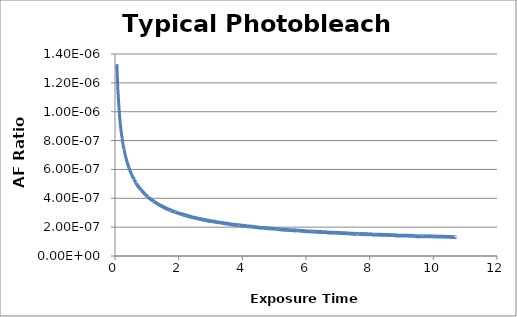
| Category | AF Ratio (a.u.) |
|---|---|
| 0.05972 | 0 |
| 0.06111 | 0 |
| 0.0625 | 0 |
| 0.06389 | 0 |
| 0.06528 | 0 |
| 0.06667 | 0 |
| 0.06806 | 0 |
| 0.06944 | 0 |
| 0.07083 | 0 |
| 0.07222 | 0 |
| 0.07361 | 0 |
| 0.075 | 0 |
| 0.07639 | 0 |
| 0.07778 | 0 |
| 0.07917 | 0 |
| 0.08056 | 0 |
| 0.08194 | 0 |
| 0.08333 | 0 |
| 0.08472 | 0 |
| 0.08611 | 0 |
| 0.0875 | 0 |
| 0.08889 | 0 |
| 0.09028 | 0 |
| 0.09167 | 0 |
| 0.09306 | 0 |
| 0.09444 | 0 |
| 0.09583 | 0 |
| 0.09722 | 0 |
| 0.09861 | 0 |
| 0.1 | 0 |
| 0.10139 | 0 |
| 0.10278 | 0 |
| 0.10417 | 0 |
| 0.10556 | 0 |
| 0.10694 | 0 |
| 0.10833 | 0 |
| 0.10972 | 0 |
| 0.11111 | 0 |
| 0.1125 | 0 |
| 0.11389 | 0 |
| 0.11528 | 0 |
| 0.11667 | 0 |
| 0.11806 | 0 |
| 0.11944 | 0 |
| 0.12083 | 0 |
| 0.12222 | 0 |
| 0.12361 | 0 |
| 0.125 | 0 |
| 0.12639 | 0 |
| 0.12778 | 0 |
| 0.12917 | 0 |
| 0.13056 | 0 |
| 0.13194 | 0 |
| 0.13333 | 0 |
| 0.13472 | 0 |
| 0.13611 | 0 |
| 0.1375 | 0 |
| 0.13889 | 0 |
| 0.14028 | 0 |
| 0.14167 | 0 |
| 0.14306 | 0 |
| 0.14444 | 0 |
| 0.14583 | 0 |
| 0.14722 | 0 |
| 0.14861 | 0 |
| 0.15 | 0 |
| 0.15139 | 0 |
| 0.15278 | 0 |
| 0.15417 | 0 |
| 0.15556 | 0 |
| 0.15694 | 0 |
| 0.15833 | 0 |
| 0.15972 | 0 |
| 0.16111 | 0 |
| 0.1625 | 0 |
| 0.16389 | 0 |
| 0.16528 | 0 |
| 0.16667 | 0 |
| 0.16806 | 0 |
| 0.16944 | 0 |
| 0.17083 | 0 |
| 0.17222 | 0 |
| 0.17361 | 0 |
| 0.175 | 0 |
| 0.17639 | 0 |
| 0.17778 | 0 |
| 0.17917 | 0 |
| 0.18056 | 0 |
| 0.18194 | 0 |
| 0.18333 | 0 |
| 0.18472 | 0 |
| 0.18611 | 0 |
| 0.1875 | 0 |
| 0.18889 | 0 |
| 0.19028 | 0 |
| 0.19167 | 0 |
| 0.19306 | 0 |
| 0.19444 | 0 |
| 0.19583 | 0 |
| 0.19722 | 0 |
| 0.19861 | 0 |
| 0.2 | 0 |
| 0.20139 | 0 |
| 0.20278 | 0 |
| 0.20417 | 0 |
| 0.20556 | 0 |
| 0.20694 | 0 |
| 0.20833 | 0 |
| 0.20972 | 0 |
| 0.21111 | 0 |
| 0.2125 | 0 |
| 0.21389 | 0 |
| 0.21528 | 0 |
| 0.21667 | 0 |
| 0.21806 | 0 |
| 0.21944 | 0 |
| 0.22083 | 0 |
| 0.22222 | 0 |
| 0.22361 | 0 |
| 0.225 | 0 |
| 0.22639 | 0 |
| 0.22778 | 0 |
| 0.22917 | 0 |
| 0.23056 | 0 |
| 0.23194 | 0 |
| 0.23333 | 0 |
| 0.23472 | 0 |
| 0.23611 | 0 |
| 0.2375 | 0 |
| 0.23889 | 0 |
| 0.24028 | 0 |
| 0.24167 | 0 |
| 0.24306 | 0 |
| 0.24444 | 0 |
| 0.24583 | 0 |
| 0.24722 | 0 |
| 0.24861 | 0 |
| 0.25 | 0 |
| 0.25139 | 0 |
| 0.25278 | 0 |
| 0.25417 | 0 |
| 0.25556 | 0 |
| 0.25694 | 0 |
| 0.25833 | 0 |
| 0.25972 | 0 |
| 0.26111 | 0 |
| 0.2625 | 0 |
| 0.26389 | 0 |
| 0.26528 | 0 |
| 0.26667 | 0 |
| 0.26806 | 0 |
| 0.26944 | 0 |
| 0.27083 | 0 |
| 0.27222 | 0 |
| 0.27361 | 0 |
| 0.275 | 0 |
| 0.27639 | 0 |
| 0.27778 | 0 |
| 0.27917 | 0 |
| 0.28056 | 0 |
| 0.28194 | 0 |
| 0.28333 | 0 |
| 0.28472 | 0 |
| 0.28611 | 0 |
| 0.2875 | 0 |
| 0.28889 | 0 |
| 0.29028 | 0 |
| 0.29167 | 0 |
| 0.29306 | 0 |
| 0.29444 | 0 |
| 0.29583 | 0 |
| 0.29722 | 0 |
| 0.29861 | 0 |
| 0.3 | 0 |
| 0.30139 | 0 |
| 0.30278 | 0 |
| 0.30417 | 0 |
| 0.30556 | 0 |
| 0.30694 | 0 |
| 0.30833 | 0 |
| 0.30972 | 0 |
| 0.31111 | 0 |
| 0.3125 | 0 |
| 0.31389 | 0 |
| 0.31528 | 0 |
| 0.31667 | 0 |
| 0.31806 | 0 |
| 0.31944 | 0 |
| 0.32083 | 0 |
| 0.32222 | 0 |
| 0.32361 | 0 |
| 0.325 | 0 |
| 0.32639 | 0 |
| 0.32778 | 0 |
| 0.32917 | 0 |
| 0.33056 | 0 |
| 0.33194 | 0 |
| 0.33333 | 0 |
| 0.33472 | 0 |
| 0.33611 | 0 |
| 0.3375 | 0 |
| 0.33889 | 0 |
| 0.34028 | 0 |
| 0.34167 | 0 |
| 0.34306 | 0 |
| 0.34444 | 0 |
| 0.34583 | 0 |
| 0.34722 | 0 |
| 0.34861 | 0 |
| 0.35 | 0 |
| 0.35139 | 0 |
| 0.35278 | 0 |
| 0.35417 | 0 |
| 0.35556 | 0 |
| 0.35694 | 0 |
| 0.35833 | 0 |
| 0.35972 | 0 |
| 0.36111 | 0 |
| 0.3625 | 0 |
| 0.36389 | 0 |
| 0.36528 | 0 |
| 0.36667 | 0 |
| 0.36806 | 0 |
| 0.36944 | 0 |
| 0.37083 | 0 |
| 0.37222 | 0 |
| 0.37361 | 0 |
| 0.375 | 0 |
| 0.37639 | 0 |
| 0.37778 | 0 |
| 0.37917 | 0 |
| 0.38056 | 0 |
| 0.38194 | 0 |
| 0.38333 | 0 |
| 0.38472 | 0 |
| 0.38611 | 0 |
| 0.3875 | 0 |
| 0.38889 | 0 |
| 0.39028 | 0 |
| 0.39167 | 0 |
| 0.39306 | 0 |
| 0.39444 | 0 |
| 0.39583 | 0 |
| 0.39722 | 0 |
| 0.39861 | 0 |
| 0.4 | 0 |
| 0.40139 | 0 |
| 0.40278 | 0 |
| 0.40417 | 0 |
| 0.40556 | 0 |
| 0.40694 | 0 |
| 0.40833 | 0 |
| 0.40972 | 0 |
| 0.41111 | 0 |
| 0.4125 | 0 |
| 0.41389 | 0 |
| 0.41528 | 0 |
| 0.41667 | 0 |
| 0.41806 | 0 |
| 0.41944 | 0 |
| 0.42083 | 0 |
| 0.42222 | 0 |
| 0.42361 | 0 |
| 0.425 | 0 |
| 0.42639 | 0 |
| 0.42778 | 0 |
| 0.42917 | 0 |
| 0.43056 | 0 |
| 0.43194 | 0 |
| 0.43333 | 0 |
| 0.43472 | 0 |
| 0.43611 | 0 |
| 0.4375 | 0 |
| 0.43889 | 0 |
| 0.44028 | 0 |
| 0.44167 | 0 |
| 0.44306 | 0 |
| 0.44444 | 0 |
| 0.44583 | 0 |
| 0.44722 | 0 |
| 0.44861 | 0 |
| 0.45 | 0 |
| 0.45139 | 0 |
| 0.45278 | 0 |
| 0.45417 | 0 |
| 0.45556 | 0 |
| 0.45694 | 0 |
| 0.45833 | 0 |
| 0.45972 | 0 |
| 0.46111 | 0 |
| 0.4625 | 0 |
| 0.46389 | 0 |
| 0.46528 | 0 |
| 0.46667 | 0 |
| 0.46806 | 0 |
| 0.46944 | 0 |
| 0.47083 | 0 |
| 0.47222 | 0 |
| 0.47361 | 0 |
| 0.475 | 0 |
| 0.47639 | 0 |
| 0.47778 | 0 |
| 0.47917 | 0 |
| 0.48056 | 0 |
| 0.48194 | 0 |
| 0.48333 | 0 |
| 0.48472 | 0 |
| 0.48611 | 0 |
| 0.4875 | 0 |
| 0.48889 | 0 |
| 0.49028 | 0 |
| 0.49167 | 0 |
| 0.49306 | 0 |
| 0.49444 | 0 |
| 0.49583 | 0 |
| 0.49722 | 0 |
| 0.49861 | 0 |
| 0.5 | 0 |
| 0.50139 | 0 |
| 0.50278 | 0 |
| 0.50417 | 0 |
| 0.50556 | 0 |
| 0.50694 | 0 |
| 0.50833 | 0 |
| 0.50972 | 0 |
| 0.51111 | 0 |
| 0.5125 | 0 |
| 0.51389 | 0 |
| 0.51528 | 0 |
| 0.51667 | 0 |
| 0.51806 | 0 |
| 0.51944 | 0 |
| 0.52083 | 0 |
| 0.52222 | 0 |
| 0.52361 | 0 |
| 0.525 | 0 |
| 0.52639 | 0 |
| 0.52778 | 0 |
| 0.52917 | 0 |
| 0.53056 | 0 |
| 0.53194 | 0 |
| 0.53333 | 0 |
| 0.53472 | 0 |
| 0.53611 | 0 |
| 0.5375 | 0 |
| 0.53889 | 0 |
| 0.54028 | 0 |
| 0.54167 | 0 |
| 0.54306 | 0 |
| 0.54444 | 0 |
| 0.54583 | 0 |
| 0.54722 | 0 |
| 0.54861 | 0 |
| 0.55 | 0 |
| 0.55139 | 0 |
| 0.55278 | 0 |
| 0.55417 | 0 |
| 0.55556 | 0 |
| 0.55694 | 0 |
| 0.55833 | 0 |
| 0.55972 | 0 |
| 0.56111 | 0 |
| 0.5625 | 0 |
| 0.56389 | 0 |
| 0.56528 | 0 |
| 0.56667 | 0 |
| 0.56806 | 0 |
| 0.56944 | 0 |
| 0.57083 | 0 |
| 0.57222 | 0 |
| 0.57361 | 0 |
| 0.575 | 0 |
| 0.57639 | 0 |
| 0.57778 | 0 |
| 0.57917 | 0 |
| 0.58056 | 0 |
| 0.58194 | 0 |
| 0.58333 | 0 |
| 0.58472 | 0 |
| 0.58611 | 0 |
| 0.5875 | 0 |
| 0.58889 | 0 |
| 0.59028 | 0 |
| 0.59167 | 0 |
| 0.59306 | 0 |
| 0.59444 | 0 |
| 0.59583 | 0 |
| 0.59722 | 0 |
| 0.59861 | 0 |
| 0.6 | 0 |
| 0.60139 | 0 |
| 0.60278 | 0 |
| 0.60417 | 0 |
| 0.60556 | 0 |
| 0.60694 | 0 |
| 0.60833 | 0 |
| 0.60972 | 0 |
| 0.61111 | 0 |
| 0.6125 | 0 |
| 0.61389 | 0 |
| 0.61528 | 0 |
| 0.61667 | 0 |
| 0.61806 | 0 |
| 0.61944 | 0 |
| 0.62083 | 0 |
| 0.62222 | 0 |
| 0.62361 | 0 |
| 0.625 | 0 |
| 0.62639 | 0 |
| 0.62778 | 0 |
| 0.62917 | 0 |
| 0.63056 | 0 |
| 0.63194 | 0 |
| 0.63333 | 0 |
| 0.63472 | 0 |
| 0.63611 | 0 |
| 0.6375 | 0 |
| 0.63889 | 0 |
| 0.64028 | 0 |
| 0.64167 | 0 |
| 0.64306 | 0 |
| 0.64444 | 0 |
| 0.64583 | 0 |
| 0.64722 | 0 |
| 0.64861 | 0 |
| 0.65 | 0 |
| 0.65139 | 0 |
| 0.65278 | 0 |
| 0.65417 | 0 |
| 0.65556 | 0 |
| 0.65694 | 0 |
| 0.65833 | 0 |
| 0.65972 | 0 |
| 0.66111 | 0 |
| 0.6625 | 0 |
| 0.66389 | 0 |
| 0.66528 | 0 |
| 0.66667 | 0 |
| 0.66806 | 0 |
| 0.66944 | 0 |
| 0.67083 | 0 |
| 0.67222 | 0 |
| 0.67361 | 0 |
| 0.675 | 0 |
| 0.67639 | 0 |
| 0.67778 | 0 |
| 0.67917 | 0 |
| 0.68056 | 0 |
| 0.68194 | 0 |
| 0.68333 | 0 |
| 0.68472 | 0 |
| 0.68611 | 0 |
| 0.6875 | 0 |
| 0.68889 | 0 |
| 0.69028 | 0 |
| 0.69167 | 0 |
| 0.69306 | 0 |
| 0.69444 | 0 |
| 0.69583 | 0 |
| 0.69722 | 0 |
| 0.69861 | 0 |
| 0.7 | 0 |
| 0.70139 | 0 |
| 0.70278 | 0 |
| 0.70417 | 0 |
| 0.70556 | 0 |
| 0.70694 | 0 |
| 0.70833 | 0 |
| 0.70972 | 0 |
| 0.71111 | 0 |
| 0.7125 | 0 |
| 0.71389 | 0 |
| 0.71528 | 0 |
| 0.71667 | 0 |
| 0.71806 | 0 |
| 0.71944 | 0 |
| 0.72083 | 0 |
| 0.72222 | 0 |
| 0.72361 | 0 |
| 0.725 | 0 |
| 0.72639 | 0 |
| 0.72778 | 0 |
| 0.72917 | 0 |
| 0.73056 | 0 |
| 0.73194 | 0 |
| 0.73333 | 0 |
| 0.73472 | 0 |
| 0.73611 | 0 |
| 0.7375 | 0 |
| 0.73889 | 0 |
| 0.74028 | 0 |
| 0.74167 | 0 |
| 0.74306 | 0 |
| 0.74444 | 0 |
| 0.74583 | 0 |
| 0.74722 | 0 |
| 0.74861 | 0 |
| 0.75 | 0 |
| 0.75139 | 0 |
| 0.75278 | 0 |
| 0.75417 | 0 |
| 0.75556 | 0 |
| 0.75694 | 0 |
| 0.75833 | 0 |
| 0.75972 | 0 |
| 0.76111 | 0 |
| 0.7625 | 0 |
| 0.76389 | 0 |
| 0.76528 | 0 |
| 0.76667 | 0 |
| 0.76806 | 0 |
| 0.76944 | 0 |
| 0.77083 | 0 |
| 0.77222 | 0 |
| 0.77361 | 0 |
| 0.775 | 0 |
| 0.77639 | 0 |
| 0.77778 | 0 |
| 0.77917 | 0 |
| 0.78056 | 0 |
| 0.78194 | 0 |
| 0.78333 | 0 |
| 0.78472 | 0 |
| 0.78611 | 0 |
| 0.7875 | 0 |
| 0.78889 | 0 |
| 0.79028 | 0 |
| 0.79167 | 0 |
| 0.79306 | 0 |
| 0.79444 | 0 |
| 0.79583 | 0 |
| 0.79722 | 0 |
| 0.79861 | 0 |
| 0.8 | 0 |
| 0.80139 | 0 |
| 0.80278 | 0 |
| 0.80417 | 0 |
| 0.80556 | 0 |
| 0.80694 | 0 |
| 0.80833 | 0 |
| 0.80972 | 0 |
| 0.81111 | 0 |
| 0.8125 | 0 |
| 0.81389 | 0 |
| 0.81528 | 0 |
| 0.81667 | 0 |
| 0.81806 | 0 |
| 0.81944 | 0 |
| 0.82083 | 0 |
| 0.82222 | 0 |
| 0.82361 | 0 |
| 0.825 | 0 |
| 0.82639 | 0 |
| 0.82778 | 0 |
| 0.82917 | 0 |
| 0.83056 | 0 |
| 0.83194 | 0 |
| 0.83333 | 0 |
| 0.83472 | 0 |
| 0.83611 | 0 |
| 0.8375 | 0 |
| 0.83889 | 0 |
| 0.84028 | 0 |
| 0.84167 | 0 |
| 0.84306 | 0 |
| 0.84444 | 0 |
| 0.84583 | 0 |
| 0.84722 | 0 |
| 0.84861 | 0 |
| 0.85 | 0 |
| 0.85139 | 0 |
| 0.85278 | 0 |
| 0.85417 | 0 |
| 0.85556 | 0 |
| 0.85694 | 0 |
| 0.85833 | 0 |
| 0.85972 | 0 |
| 0.86111 | 0 |
| 0.8625 | 0 |
| 0.86389 | 0 |
| 0.86528 | 0 |
| 0.86667 | 0 |
| 0.86806 | 0 |
| 0.86944 | 0 |
| 0.87083 | 0 |
| 0.87222 | 0 |
| 0.87361 | 0 |
| 0.875 | 0 |
| 0.87639 | 0 |
| 0.87778 | 0 |
| 0.87917 | 0 |
| 0.88056 | 0 |
| 0.88194 | 0 |
| 0.88333 | 0 |
| 0.88472 | 0 |
| 0.88611 | 0 |
| 0.8875 | 0 |
| 0.88889 | 0 |
| 0.89028 | 0 |
| 0.89167 | 0 |
| 0.89306 | 0 |
| 0.89444 | 0 |
| 0.89583 | 0 |
| 0.89722 | 0 |
| 0.89861 | 0 |
| 0.9 | 0 |
| 0.90139 | 0 |
| 0.90278 | 0 |
| 0.90417 | 0 |
| 0.90556 | 0 |
| 0.90694 | 0 |
| 0.90833 | 0 |
| 0.90972 | 0 |
| 0.91111 | 0 |
| 0.9125 | 0 |
| 0.91389 | 0 |
| 0.91528 | 0 |
| 0.91667 | 0 |
| 0.91806 | 0 |
| 0.91944 | 0 |
| 0.92083 | 0 |
| 0.92222 | 0 |
| 0.92361 | 0 |
| 0.925 | 0 |
| 0.92639 | 0 |
| 0.92778 | 0 |
| 0.92917 | 0 |
| 0.93056 | 0 |
| 0.93194 | 0 |
| 0.93333 | 0 |
| 0.93472 | 0 |
| 0.93611 | 0 |
| 0.9375 | 0 |
| 0.93889 | 0 |
| 0.94028 | 0 |
| 0.94167 | 0 |
| 0.94306 | 0 |
| 0.94444 | 0 |
| 0.94583 | 0 |
| 0.94722 | 0 |
| 0.94861 | 0 |
| 0.95 | 0 |
| 0.95139 | 0 |
| 0.95278 | 0 |
| 0.95417 | 0 |
| 0.95556 | 0 |
| 0.95694 | 0 |
| 0.95833 | 0 |
| 0.95972 | 0 |
| 0.96111 | 0 |
| 0.9625 | 0 |
| 0.96389 | 0 |
| 0.96528 | 0 |
| 0.96667 | 0 |
| 0.96806 | 0 |
| 0.96944 | 0 |
| 0.97083 | 0 |
| 0.97222 | 0 |
| 0.97361 | 0 |
| 0.975 | 0 |
| 0.97639 | 0 |
| 0.97778 | 0 |
| 0.97917 | 0 |
| 0.98056 | 0 |
| 0.98194 | 0 |
| 0.98333 | 0 |
| 0.98472 | 0 |
| 0.98611 | 0 |
| 0.9875 | 0 |
| 0.98889 | 0 |
| 0.99028 | 0 |
| 0.99167 | 0 |
| 0.99306 | 0 |
| 0.99444 | 0 |
| 0.99583 | 0 |
| 0.99722 | 0 |
| 0.99861 | 0 |
| 1.0 | 0 |
| 1.00139 | 0 |
| 1.00278 | 0 |
| 1.00417 | 0 |
| 1.00556 | 0 |
| 1.00694 | 0 |
| 1.00833 | 0 |
| 1.00972 | 0 |
| 1.01111 | 0 |
| 1.0125 | 0 |
| 1.01389 | 0 |
| 1.01528 | 0 |
| 1.01667 | 0 |
| 1.01806 | 0 |
| 1.01944 | 0 |
| 1.02083 | 0 |
| 1.02222 | 0 |
| 1.02361 | 0 |
| 1.025 | 0 |
| 1.02639 | 0 |
| 1.02778 | 0 |
| 1.02917 | 0 |
| 1.03056 | 0 |
| 1.03194 | 0 |
| 1.03333 | 0 |
| 1.03472 | 0 |
| 1.03611 | 0 |
| 1.0375 | 0 |
| 1.03889 | 0 |
| 1.04028 | 0 |
| 1.04167 | 0 |
| 1.04306 | 0 |
| 1.04444 | 0 |
| 1.04583 | 0 |
| 1.04722 | 0 |
| 1.04861 | 0 |
| 1.05 | 0 |
| 1.05139 | 0 |
| 1.05278 | 0 |
| 1.05417 | 0 |
| 1.05556 | 0 |
| 1.05694 | 0 |
| 1.05833 | 0 |
| 1.05972 | 0 |
| 1.06111 | 0 |
| 1.0625 | 0 |
| 1.06389 | 0 |
| 1.06528 | 0 |
| 1.06667 | 0 |
| 1.06806 | 0 |
| 1.06944 | 0 |
| 1.07083 | 0 |
| 1.07222 | 0 |
| 1.07361 | 0 |
| 1.075 | 0 |
| 1.07639 | 0 |
| 1.07778 | 0 |
| 1.07917 | 0 |
| 1.08056 | 0 |
| 1.08194 | 0 |
| 1.08333 | 0 |
| 1.08472 | 0 |
| 1.08611 | 0 |
| 1.0875 | 0 |
| 1.08889 | 0 |
| 1.09028 | 0 |
| 1.09167 | 0 |
| 1.09306 | 0 |
| 1.09444 | 0 |
| 1.09583 | 0 |
| 1.09722 | 0 |
| 1.09861 | 0 |
| 1.1 | 0 |
| 1.10139 | 0 |
| 1.10278 | 0 |
| 1.10417 | 0 |
| 1.10556 | 0 |
| 1.10694 | 0 |
| 1.10833 | 0 |
| 1.10972 | 0 |
| 1.11111 | 0 |
| 1.1125 | 0 |
| 1.11389 | 0 |
| 1.11528 | 0 |
| 1.11667 | 0 |
| 1.11806 | 0 |
| 1.11944 | 0 |
| 1.12083 | 0 |
| 1.12222 | 0 |
| 1.12361 | 0 |
| 1.125 | 0 |
| 1.12639 | 0 |
| 1.12778 | 0 |
| 1.12917 | 0 |
| 1.13056 | 0 |
| 1.13194 | 0 |
| 1.13333 | 0 |
| 1.13472 | 0 |
| 1.13611 | 0 |
| 1.1375 | 0 |
| 1.13889 | 0 |
| 1.14028 | 0 |
| 1.14167 | 0 |
| 1.14306 | 0 |
| 1.14444 | 0 |
| 1.14583 | 0 |
| 1.14722 | 0 |
| 1.14861 | 0 |
| 1.15 | 0 |
| 1.15139 | 0 |
| 1.15278 | 0 |
| 1.15417 | 0 |
| 1.15556 | 0 |
| 1.15694 | 0 |
| 1.15833 | 0 |
| 1.15972 | 0 |
| 1.16111 | 0 |
| 1.1625 | 0 |
| 1.16389 | 0 |
| 1.16528 | 0 |
| 1.16667 | 0 |
| 1.16806 | 0 |
| 1.16944 | 0 |
| 1.17083 | 0 |
| 1.17222 | 0 |
| 1.17361 | 0 |
| 1.175 | 0 |
| 1.17639 | 0 |
| 1.17778 | 0 |
| 1.17917 | 0 |
| 1.18056 | 0 |
| 1.18194 | 0 |
| 1.18333 | 0 |
| 1.18472 | 0 |
| 1.18611 | 0 |
| 1.1875 | 0 |
| 1.18889 | 0 |
| 1.19028 | 0 |
| 1.19167 | 0 |
| 1.19306 | 0 |
| 1.19444 | 0 |
| 1.19583 | 0 |
| 1.19722 | 0 |
| 1.19861 | 0 |
| 1.2 | 0 |
| 1.20139 | 0 |
| 1.20278 | 0 |
| 1.20417 | 0 |
| 1.20556 | 0 |
| 1.20694 | 0 |
| 1.20833 | 0 |
| 1.20972 | 0 |
| 1.21111 | 0 |
| 1.2125 | 0 |
| 1.21389 | 0 |
| 1.21528 | 0 |
| 1.21667 | 0 |
| 1.21806 | 0 |
| 1.21944 | 0 |
| 1.22083 | 0 |
| 1.22222 | 0 |
| 1.22361 | 0 |
| 1.225 | 0 |
| 1.22639 | 0 |
| 1.22778 | 0 |
| 1.22917 | 0 |
| 1.23056 | 0 |
| 1.23194 | 0 |
| 1.23333 | 0 |
| 1.23472 | 0 |
| 1.23611 | 0 |
| 1.2375 | 0 |
| 1.23889 | 0 |
| 1.24028 | 0 |
| 1.24167 | 0 |
| 1.24306 | 0 |
| 1.24444 | 0 |
| 1.24583 | 0 |
| 1.24722 | 0 |
| 1.24861 | 0 |
| 1.25 | 0 |
| 1.25139 | 0 |
| 1.25278 | 0 |
| 1.25417 | 0 |
| 1.25556 | 0 |
| 1.25694 | 0 |
| 1.25833 | 0 |
| 1.25972 | 0 |
| 1.26111 | 0 |
| 1.2625 | 0 |
| 1.26389 | 0 |
| 1.26528 | 0 |
| 1.26667 | 0 |
| 1.26806 | 0 |
| 1.26944 | 0 |
| 1.27083 | 0 |
| 1.27222 | 0 |
| 1.27361 | 0 |
| 1.275 | 0 |
| 1.27639 | 0 |
| 1.27778 | 0 |
| 1.27917 | 0 |
| 1.28056 | 0 |
| 1.28194 | 0 |
| 1.28333 | 0 |
| 1.28472 | 0 |
| 1.28611 | 0 |
| 1.2875 | 0 |
| 1.28889 | 0 |
| 1.29028 | 0 |
| 1.29167 | 0 |
| 1.29306 | 0 |
| 1.29444 | 0 |
| 1.29583 | 0 |
| 1.29722 | 0 |
| 1.29861 | 0 |
| 1.3 | 0 |
| 1.30139 | 0 |
| 1.30278 | 0 |
| 1.30417 | 0 |
| 1.30556 | 0 |
| 1.30694 | 0 |
| 1.30833 | 0 |
| 1.30972 | 0 |
| 1.31111 | 0 |
| 1.3125 | 0 |
| 1.31389 | 0 |
| 1.31528 | 0 |
| 1.31667 | 0 |
| 1.31806 | 0 |
| 1.31944 | 0 |
| 1.32083 | 0 |
| 1.32222 | 0 |
| 1.32361 | 0 |
| 1.325 | 0 |
| 1.32639 | 0 |
| 1.32778 | 0 |
| 1.32917 | 0 |
| 1.33056 | 0 |
| 1.33194 | 0 |
| 1.33333 | 0 |
| 1.33472 | 0 |
| 1.33611 | 0 |
| 1.3375 | 0 |
| 1.33889 | 0 |
| 1.34028 | 0 |
| 1.34167 | 0 |
| 1.34306 | 0 |
| 1.34444 | 0 |
| 1.34583 | 0 |
| 1.34722 | 0 |
| 1.34861 | 0 |
| 1.35 | 0 |
| 1.35139 | 0 |
| 1.35278 | 0 |
| 1.35417 | 0 |
| 1.35556 | 0 |
| 1.35694 | 0 |
| 1.35833 | 0 |
| 1.35972 | 0 |
| 1.36111 | 0 |
| 1.3625 | 0 |
| 1.36389 | 0 |
| 1.36528 | 0 |
| 1.36667 | 0 |
| 1.36806 | 0 |
| 1.36944 | 0 |
| 1.37083 | 0 |
| 1.37222 | 0 |
| 1.37361 | 0 |
| 1.375 | 0 |
| 1.37639 | 0 |
| 1.37778 | 0 |
| 1.37917 | 0 |
| 1.38056 | 0 |
| 1.38194 | 0 |
| 1.38333 | 0 |
| 1.38472 | 0 |
| 1.38611 | 0 |
| 1.3875 | 0 |
| 1.38889 | 0 |
| 1.39028 | 0 |
| 1.39167 | 0 |
| 1.39306 | 0 |
| 1.39444 | 0 |
| 1.39583 | 0 |
| 1.39722 | 0 |
| 1.39861 | 0 |
| 1.4 | 0 |
| 1.40139 | 0 |
| 1.40278 | 0 |
| 1.40417 | 0 |
| 1.40556 | 0 |
| 1.40694 | 0 |
| 1.40833 | 0 |
| 1.40972 | 0 |
| 1.41111 | 0 |
| 1.4125 | 0 |
| 1.41389 | 0 |
| 1.41528 | 0 |
| 1.41667 | 0 |
| 1.41806 | 0 |
| 1.41944 | 0 |
| 1.42083 | 0 |
| 1.42222 | 0 |
| 1.42361 | 0 |
| 1.425 | 0 |
| 1.42639 | 0 |
| 1.42778 | 0 |
| 1.42917 | 0 |
| 1.43056 | 0 |
| 1.43194 | 0 |
| 1.43333 | 0 |
| 1.43472 | 0 |
| 1.43611 | 0 |
| 1.4375 | 0 |
| 1.43889 | 0 |
| 1.44028 | 0 |
| 1.44167 | 0 |
| 1.44306 | 0 |
| 1.44444 | 0 |
| 1.44583 | 0 |
| 1.44722 | 0 |
| 1.44861 | 0 |
| 1.45 | 0 |
| 1.45139 | 0 |
| 1.45278 | 0 |
| 1.45417 | 0 |
| 1.45556 | 0 |
| 1.45694 | 0 |
| 1.45833 | 0 |
| 1.45972 | 0 |
| 1.46111 | 0 |
| 1.4625 | 0 |
| 1.46389 | 0 |
| 1.46528 | 0 |
| 1.46667 | 0 |
| 1.46806 | 0 |
| 1.46944 | 0 |
| 1.47083 | 0 |
| 1.47222 | 0 |
| 1.47361 | 0 |
| 1.475 | 0 |
| 1.47639 | 0 |
| 1.47778 | 0 |
| 1.47917 | 0 |
| 1.48056 | 0 |
| 1.48194 | 0 |
| 1.48333 | 0 |
| 1.48472 | 0 |
| 1.48611 | 0 |
| 1.4875 | 0 |
| 1.48889 | 0 |
| 1.49028 | 0 |
| 1.49167 | 0 |
| 1.49306 | 0 |
| 1.49444 | 0 |
| 1.49583 | 0 |
| 1.49722 | 0 |
| 1.49861 | 0 |
| 1.5 | 0 |
| 1.50139 | 0 |
| 1.50278 | 0 |
| 1.50417 | 0 |
| 1.50556 | 0 |
| 1.50694 | 0 |
| 1.50833 | 0 |
| 1.50972 | 0 |
| 1.51111 | 0 |
| 1.5125 | 0 |
| 1.51389 | 0 |
| 1.51528 | 0 |
| 1.51667 | 0 |
| 1.51806 | 0 |
| 1.51944 | 0 |
| 1.52083 | 0 |
| 1.52222 | 0 |
| 1.52361 | 0 |
| 1.525 | 0 |
| 1.52639 | 0 |
| 1.52778 | 0 |
| 1.52917 | 0 |
| 1.53056 | 0 |
| 1.53194 | 0 |
| 1.53333 | 0 |
| 1.53472 | 0 |
| 1.53611 | 0 |
| 1.5375 | 0 |
| 1.53889 | 0 |
| 1.54028 | 0 |
| 1.54167 | 0 |
| 1.54306 | 0 |
| 1.54444 | 0 |
| 1.54583 | 0 |
| 1.54722 | 0 |
| 1.54861 | 0 |
| 1.55 | 0 |
| 1.55139 | 0 |
| 1.55278 | 0 |
| 1.55417 | 0 |
| 1.55556 | 0 |
| 1.55694 | 0 |
| 1.55833 | 0 |
| 1.55972 | 0 |
| 1.56111 | 0 |
| 1.5625 | 0 |
| 1.56389 | 0 |
| 1.56528 | 0 |
| 1.56667 | 0 |
| 1.56806 | 0 |
| 1.56944 | 0 |
| 1.57083 | 0 |
| 1.57222 | 0 |
| 1.57361 | 0 |
| 1.575 | 0 |
| 1.57639 | 0 |
| 1.57778 | 0 |
| 1.57917 | 0 |
| 1.58056 | 0 |
| 1.58194 | 0 |
| 1.58333 | 0 |
| 1.58472 | 0 |
| 1.58611 | 0 |
| 1.5875 | 0 |
| 1.58889 | 0 |
| 1.59028 | 0 |
| 1.59167 | 0 |
| 1.59306 | 0 |
| 1.59444 | 0 |
| 1.59583 | 0 |
| 1.59722 | 0 |
| 1.59861 | 0 |
| 1.6 | 0 |
| 1.60139 | 0 |
| 1.60278 | 0 |
| 1.60417 | 0 |
| 1.60556 | 0 |
| 1.60694 | 0 |
| 1.60833 | 0 |
| 1.60972 | 0 |
| 1.61111 | 0 |
| 1.6125 | 0 |
| 1.61389 | 0 |
| 1.61528 | 0 |
| 1.61667 | 0 |
| 1.61806 | 0 |
| 1.61944 | 0 |
| 1.62083 | 0 |
| 1.62222 | 0 |
| 1.62361 | 0 |
| 1.625 | 0 |
| 1.62639 | 0 |
| 1.62778 | 0 |
| 1.62917 | 0 |
| 1.63056 | 0 |
| 1.63194 | 0 |
| 1.63333 | 0 |
| 1.63472 | 0 |
| 1.63611 | 0 |
| 1.6375 | 0 |
| 1.63889 | 0 |
| 1.64028 | 0 |
| 1.64167 | 0 |
| 1.64306 | 0 |
| 1.64444 | 0 |
| 1.64583 | 0 |
| 1.64722 | 0 |
| 1.64861 | 0 |
| 1.65 | 0 |
| 1.65139 | 0 |
| 1.65278 | 0 |
| 1.65417 | 0 |
| 1.65556 | 0 |
| 1.65694 | 0 |
| 1.65833 | 0 |
| 1.65972 | 0 |
| 1.66111 | 0 |
| 1.6625 | 0 |
| 1.66389 | 0 |
| 1.66528 | 0 |
| 1.66667 | 0 |
| 1.66806 | 0 |
| 1.66944 | 0 |
| 1.67083 | 0 |
| 1.67222 | 0 |
| 1.67361 | 0 |
| 1.675 | 0 |
| 1.67639 | 0 |
| 1.67778 | 0 |
| 1.67917 | 0 |
| 1.68056 | 0 |
| 1.68194 | 0 |
| 1.68333 | 0 |
| 1.68472 | 0 |
| 1.68611 | 0 |
| 1.6875 | 0 |
| 1.68889 | 0 |
| 1.69028 | 0 |
| 1.69167 | 0 |
| 1.69306 | 0 |
| 1.69444 | 0 |
| 1.69583 | 0 |
| 1.69722 | 0 |
| 1.69861 | 0 |
| 1.7 | 0 |
| 1.70139 | 0 |
| 1.70278 | 0 |
| 1.70417 | 0 |
| 1.70556 | 0 |
| 1.70694 | 0 |
| 1.70833 | 0 |
| 1.70972 | 0 |
| 1.71111 | 0 |
| 1.7125 | 0 |
| 1.71389 | 0 |
| 1.71528 | 0 |
| 1.71667 | 0 |
| 1.71806 | 0 |
| 1.71944 | 0 |
| 1.72083 | 0 |
| 1.72222 | 0 |
| 1.72361 | 0 |
| 1.725 | 0 |
| 1.72639 | 0 |
| 1.72778 | 0 |
| 1.72917 | 0 |
| 1.73056 | 0 |
| 1.73194 | 0 |
| 1.73333 | 0 |
| 1.73472 | 0 |
| 1.73611 | 0 |
| 1.7375 | 0 |
| 1.73889 | 0 |
| 1.74028 | 0 |
| 1.74167 | 0 |
| 1.74306 | 0 |
| 1.74444 | 0 |
| 1.74583 | 0 |
| 1.74722 | 0 |
| 1.74861 | 0 |
| 1.75 | 0 |
| 1.75139 | 0 |
| 1.75278 | 0 |
| 1.75417 | 0 |
| 1.75556 | 0 |
| 1.75694 | 0 |
| 1.75833 | 0 |
| 1.75972 | 0 |
| 1.76111 | 0 |
| 1.7625 | 0 |
| 1.76389 | 0 |
| 1.76528 | 0 |
| 1.76667 | 0 |
| 1.76806 | 0 |
| 1.76944 | 0 |
| 1.77083 | 0 |
| 1.77222 | 0 |
| 1.77361 | 0 |
| 1.775 | 0 |
| 1.77639 | 0 |
| 1.77778 | 0 |
| 1.77917 | 0 |
| 1.78056 | 0 |
| 1.78194 | 0 |
| 1.78333 | 0 |
| 1.78472 | 0 |
| 1.78611 | 0 |
| 1.7875 | 0 |
| 1.78889 | 0 |
| 1.79028 | 0 |
| 1.79167 | 0 |
| 1.79306 | 0 |
| 1.79444 | 0 |
| 1.79583 | 0 |
| 1.79722 | 0 |
| 1.79861 | 0 |
| 1.8 | 0 |
| 1.80139 | 0 |
| 1.80278 | 0 |
| 1.80417 | 0 |
| 1.80556 | 0 |
| 1.80694 | 0 |
| 1.80833 | 0 |
| 1.80972 | 0 |
| 1.81111 | 0 |
| 1.8125 | 0 |
| 1.81389 | 0 |
| 1.81528 | 0 |
| 1.81667 | 0 |
| 1.81806 | 0 |
| 1.81944 | 0 |
| 1.82083 | 0 |
| 1.82222 | 0 |
| 1.82361 | 0 |
| 1.825 | 0 |
| 1.82639 | 0 |
| 1.82778 | 0 |
| 1.82917 | 0 |
| 1.83056 | 0 |
| 1.83194 | 0 |
| 1.83333 | 0 |
| 1.83472 | 0 |
| 1.83611 | 0 |
| 1.8375 | 0 |
| 1.83889 | 0 |
| 1.84028 | 0 |
| 1.84167 | 0 |
| 1.84306 | 0 |
| 1.84444 | 0 |
| 1.84583 | 0 |
| 1.84722 | 0 |
| 1.84861 | 0 |
| 1.85 | 0 |
| 1.85139 | 0 |
| 1.85278 | 0 |
| 1.85417 | 0 |
| 1.85556 | 0 |
| 1.85694 | 0 |
| 1.85833 | 0 |
| 1.85972 | 0 |
| 1.86111 | 0 |
| 1.8625 | 0 |
| 1.86389 | 0 |
| 1.86528 | 0 |
| 1.86667 | 0 |
| 1.86806 | 0 |
| 1.86944 | 0 |
| 1.87083 | 0 |
| 1.87222 | 0 |
| 1.87361 | 0 |
| 1.875 | 0 |
| 1.87639 | 0 |
| 1.87778 | 0 |
| 1.87917 | 0 |
| 1.88056 | 0 |
| 1.88194 | 0 |
| 1.88333 | 0 |
| 1.88472 | 0 |
| 1.88611 | 0 |
| 1.8875 | 0 |
| 1.88889 | 0 |
| 1.89028 | 0 |
| 1.89167 | 0 |
| 1.89306 | 0 |
| 1.89444 | 0 |
| 1.89583 | 0 |
| 1.89722 | 0 |
| 1.89861 | 0 |
| 1.9 | 0 |
| 1.90139 | 0 |
| 1.90278 | 0 |
| 1.90417 | 0 |
| 1.90556 | 0 |
| 1.90694 | 0 |
| 1.90833 | 0 |
| 1.90972 | 0 |
| 1.91111 | 0 |
| 1.9125 | 0 |
| 1.91389 | 0 |
| 1.91528 | 0 |
| 1.91667 | 0 |
| 1.91806 | 0 |
| 1.91944 | 0 |
| 1.92083 | 0 |
| 1.92222 | 0 |
| 1.92361 | 0 |
| 1.925 | 0 |
| 1.92639 | 0 |
| 1.92778 | 0 |
| 1.92917 | 0 |
| 1.93056 | 0 |
| 1.93194 | 0 |
| 1.93333 | 0 |
| 1.93472 | 0 |
| 1.93611 | 0 |
| 1.9375 | 0 |
| 1.93889 | 0 |
| 1.94028 | 0 |
| 1.94167 | 0 |
| 1.94306 | 0 |
| 1.94444 | 0 |
| 1.94583 | 0 |
| 1.94722 | 0 |
| 1.94861 | 0 |
| 1.95 | 0 |
| 1.95139 | 0 |
| 1.95278 | 0 |
| 1.95417 | 0 |
| 1.95556 | 0 |
| 1.95694 | 0 |
| 1.95833 | 0 |
| 1.95972 | 0 |
| 1.96111 | 0 |
| 1.9625 | 0 |
| 1.96389 | 0 |
| 1.96528 | 0 |
| 1.96667 | 0 |
| 1.96806 | 0 |
| 1.96944 | 0 |
| 1.97083 | 0 |
| 1.97222 | 0 |
| 1.97361 | 0 |
| 1.975 | 0 |
| 1.97639 | 0 |
| 1.97778 | 0 |
| 1.97917 | 0 |
| 1.98056 | 0 |
| 1.98194 | 0 |
| 1.98333 | 0 |
| 1.98472 | 0 |
| 1.98611 | 0 |
| 1.9875 | 0 |
| 1.98889 | 0 |
| 1.99028 | 0 |
| 1.99167 | 0 |
| 1.99306 | 0 |
| 1.99444 | 0 |
| 1.99583 | 0 |
| 1.99722 | 0 |
| 1.99861 | 0 |
| 2.0 | 0 |
| 2.00139 | 0 |
| 2.00278 | 0 |
| 2.00417 | 0 |
| 2.00556 | 0 |
| 2.00694 | 0 |
| 2.00833 | 0 |
| 2.00972 | 0 |
| 2.01111 | 0 |
| 2.0125 | 0 |
| 2.01389 | 0 |
| 2.01528 | 0 |
| 2.01667 | 0 |
| 2.01806 | 0 |
| 2.01944 | 0 |
| 2.02083 | 0 |
| 2.02222 | 0 |
| 2.02361 | 0 |
| 2.025 | 0 |
| 2.02639 | 0 |
| 2.02778 | 0 |
| 2.02917 | 0 |
| 2.03056 | 0 |
| 2.03194 | 0 |
| 2.03333 | 0 |
| 2.03472 | 0 |
| 2.03611 | 0 |
| 2.0375 | 0 |
| 2.03889 | 0 |
| 2.04028 | 0 |
| 2.04167 | 0 |
| 2.04306 | 0 |
| 2.04444 | 0 |
| 2.04583 | 0 |
| 2.04722 | 0 |
| 2.04861 | 0 |
| 2.05 | 0 |
| 2.05139 | 0 |
| 2.05278 | 0 |
| 2.05417 | 0 |
| 2.05556 | 0 |
| 2.05694 | 0 |
| 2.05833 | 0 |
| 2.05972 | 0 |
| 2.06111 | 0 |
| 2.0625 | 0 |
| 2.06389 | 0 |
| 2.06528 | 0 |
| 2.06667 | 0 |
| 2.06806 | 0 |
| 2.06944 | 0 |
| 2.07083 | 0 |
| 2.07222 | 0 |
| 2.07361 | 0 |
| 2.075 | 0 |
| 2.07639 | 0 |
| 2.07778 | 0 |
| 2.07917 | 0 |
| 2.08056 | 0 |
| 2.08194 | 0 |
| 2.08333 | 0 |
| 2.08472 | 0 |
| 2.08611 | 0 |
| 2.0875 | 0 |
| 2.08889 | 0 |
| 2.09028 | 0 |
| 2.09167 | 0 |
| 2.09306 | 0 |
| 2.09444 | 0 |
| 2.09583 | 0 |
| 2.09722 | 0 |
| 2.09861 | 0 |
| 2.1 | 0 |
| 2.10139 | 0 |
| 2.10278 | 0 |
| 2.10417 | 0 |
| 2.10556 | 0 |
| 2.10694 | 0 |
| 2.10833 | 0 |
| 2.10972 | 0 |
| 2.11111 | 0 |
| 2.1125 | 0 |
| 2.11389 | 0 |
| 2.11528 | 0 |
| 2.11667 | 0 |
| 2.11806 | 0 |
| 2.11944 | 0 |
| 2.12083 | 0 |
| 2.12222 | 0 |
| 2.12361 | 0 |
| 2.125 | 0 |
| 2.12639 | 0 |
| 2.12778 | 0 |
| 2.12917 | 0 |
| 2.13056 | 0 |
| 2.13194 | 0 |
| 2.13333 | 0 |
| 2.13472 | 0 |
| 2.13611 | 0 |
| 2.1375 | 0 |
| 2.13889 | 0 |
| 2.14028 | 0 |
| 2.14167 | 0 |
| 2.14306 | 0 |
| 2.14444 | 0 |
| 2.14583 | 0 |
| 2.14722 | 0 |
| 2.14861 | 0 |
| 2.15 | 0 |
| 2.15139 | 0 |
| 2.15278 | 0 |
| 2.15417 | 0 |
| 2.15556 | 0 |
| 2.15694 | 0 |
| 2.15833 | 0 |
| 2.15972 | 0 |
| 2.16111 | 0 |
| 2.1625 | 0 |
| 2.16389 | 0 |
| 2.16528 | 0 |
| 2.16667 | 0 |
| 2.16806 | 0 |
| 2.16944 | 0 |
| 2.17083 | 0 |
| 2.17222 | 0 |
| 2.17361 | 0 |
| 2.175 | 0 |
| 2.17639 | 0 |
| 2.17778 | 0 |
| 2.17917 | 0 |
| 2.18056 | 0 |
| 2.18194 | 0 |
| 2.18333 | 0 |
| 2.18472 | 0 |
| 2.18611 | 0 |
| 2.1875 | 0 |
| 2.18889 | 0 |
| 2.19028 | 0 |
| 2.19167 | 0 |
| 2.19306 | 0 |
| 2.19444 | 0 |
| 2.19583 | 0 |
| 2.19722 | 0 |
| 2.19861 | 0 |
| 2.2 | 0 |
| 2.20139 | 0 |
| 2.20278 | 0 |
| 2.20417 | 0 |
| 2.20556 | 0 |
| 2.20694 | 0 |
| 2.20833 | 0 |
| 2.20972 | 0 |
| 2.21111 | 0 |
| 2.2125 | 0 |
| 2.21389 | 0 |
| 2.21528 | 0 |
| 2.21667 | 0 |
| 2.21806 | 0 |
| 2.21944 | 0 |
| 2.22083 | 0 |
| 2.22222 | 0 |
| 2.22361 | 0 |
| 2.225 | 0 |
| 2.22639 | 0 |
| 2.22778 | 0 |
| 2.22917 | 0 |
| 2.23056 | 0 |
| 2.23194 | 0 |
| 2.23333 | 0 |
| 2.23472 | 0 |
| 2.23611 | 0 |
| 2.2375 | 0 |
| 2.23889 | 0 |
| 2.24028 | 0 |
| 2.24167 | 0 |
| 2.24306 | 0 |
| 2.24444 | 0 |
| 2.24583 | 0 |
| 2.24722 | 0 |
| 2.24861 | 0 |
| 2.25 | 0 |
| 2.25139 | 0 |
| 2.25278 | 0 |
| 2.25417 | 0 |
| 2.25556 | 0 |
| 2.25694 | 0 |
| 2.25833 | 0 |
| 2.25972 | 0 |
| 2.26111 | 0 |
| 2.2625 | 0 |
| 2.26389 | 0 |
| 2.26528 | 0 |
| 2.26667 | 0 |
| 2.26806 | 0 |
| 2.26944 | 0 |
| 2.27083 | 0 |
| 2.27222 | 0 |
| 2.27361 | 0 |
| 2.275 | 0 |
| 2.27639 | 0 |
| 2.27778 | 0 |
| 2.27917 | 0 |
| 2.28056 | 0 |
| 2.28194 | 0 |
| 2.28333 | 0 |
| 2.28472 | 0 |
| 2.28611 | 0 |
| 2.2875 | 0 |
| 2.28889 | 0 |
| 2.29028 | 0 |
| 2.29167 | 0 |
| 2.29306 | 0 |
| 2.29444 | 0 |
| 2.29583 | 0 |
| 2.29722 | 0 |
| 2.29861 | 0 |
| 2.3 | 0 |
| 2.30139 | 0 |
| 2.30278 | 0 |
| 2.30417 | 0 |
| 2.30556 | 0 |
| 2.30694 | 0 |
| 2.30833 | 0 |
| 2.30972 | 0 |
| 2.31111 | 0 |
| 2.3125 | 0 |
| 2.31389 | 0 |
| 2.31528 | 0 |
| 2.31667 | 0 |
| 2.31806 | 0 |
| 2.31944 | 0 |
| 2.32083 | 0 |
| 2.32222 | 0 |
| 2.32361 | 0 |
| 2.325 | 0 |
| 2.32639 | 0 |
| 2.32778 | 0 |
| 2.32917 | 0 |
| 2.33056 | 0 |
| 2.33194 | 0 |
| 2.33333 | 0 |
| 2.33472 | 0 |
| 2.33611 | 0 |
| 2.3375 | 0 |
| 2.33889 | 0 |
| 2.34028 | 0 |
| 2.34167 | 0 |
| 2.34306 | 0 |
| 2.34444 | 0 |
| 2.34583 | 0 |
| 2.34722 | 0 |
| 2.34861 | 0 |
| 2.35 | 0 |
| 2.35139 | 0 |
| 2.35278 | 0 |
| 2.35417 | 0 |
| 2.35556 | 0 |
| 2.35694 | 0 |
| 2.35833 | 0 |
| 2.35972 | 0 |
| 2.36111 | 0 |
| 2.3625 | 0 |
| 2.36389 | 0 |
| 2.36528 | 0 |
| 2.36667 | 0 |
| 2.36806 | 0 |
| 2.36944 | 0 |
| 2.37083 | 0 |
| 2.37222 | 0 |
| 2.37361 | 0 |
| 2.375 | 0 |
| 2.37639 | 0 |
| 2.37778 | 0 |
| 2.37917 | 0 |
| 2.38056 | 0 |
| 2.38194 | 0 |
| 2.38333 | 0 |
| 2.38472 | 0 |
| 2.38611 | 0 |
| 2.3875 | 0 |
| 2.38889 | 0 |
| 2.39028 | 0 |
| 2.39167 | 0 |
| 2.39306 | 0 |
| 2.39444 | 0 |
| 2.39583 | 0 |
| 2.39722 | 0 |
| 2.39861 | 0 |
| 2.4 | 0 |
| 2.40139 | 0 |
| 2.40278 | 0 |
| 2.40417 | 0 |
| 2.40556 | 0 |
| 2.40694 | 0 |
| 2.40833 | 0 |
| 2.40972 | 0 |
| 2.41111 | 0 |
| 2.4125 | 0 |
| 2.41389 | 0 |
| 2.41528 | 0 |
| 2.41667 | 0 |
| 2.41806 | 0 |
| 2.41944 | 0 |
| 2.42083 | 0 |
| 2.42222 | 0 |
| 2.42361 | 0 |
| 2.425 | 0 |
| 2.42639 | 0 |
| 2.42778 | 0 |
| 2.42917 | 0 |
| 2.43056 | 0 |
| 2.43194 | 0 |
| 2.43333 | 0 |
| 2.43472 | 0 |
| 2.43611 | 0 |
| 2.4375 | 0 |
| 2.43889 | 0 |
| 2.44028 | 0 |
| 2.44167 | 0 |
| 2.44306 | 0 |
| 2.44444 | 0 |
| 2.44583 | 0 |
| 2.44722 | 0 |
| 2.44861 | 0 |
| 2.45 | 0 |
| 2.45139 | 0 |
| 2.45278 | 0 |
| 2.45417 | 0 |
| 2.45556 | 0 |
| 2.45694 | 0 |
| 2.45833 | 0 |
| 2.45972 | 0 |
| 2.46111 | 0 |
| 2.4625 | 0 |
| 2.46389 | 0 |
| 2.46528 | 0 |
| 2.46667 | 0 |
| 2.46806 | 0 |
| 2.46944 | 0 |
| 2.47083 | 0 |
| 2.47222 | 0 |
| 2.47361 | 0 |
| 2.475 | 0 |
| 2.47639 | 0 |
| 2.47778 | 0 |
| 2.47917 | 0 |
| 2.48056 | 0 |
| 2.48194 | 0 |
| 2.48333 | 0 |
| 2.48472 | 0 |
| 2.48611 | 0 |
| 2.4875 | 0 |
| 2.48889 | 0 |
| 2.49028 | 0 |
| 2.49167 | 0 |
| 2.49306 | 0 |
| 2.49444 | 0 |
| 2.49583 | 0 |
| 2.49722 | 0 |
| 2.49861 | 0 |
| 2.5 | 0 |
| 2.50139 | 0 |
| 2.50278 | 0 |
| 2.50417 | 0 |
| 2.50556 | 0 |
| 2.50694 | 0 |
| 2.50833 | 0 |
| 2.50972 | 0 |
| 2.51111 | 0 |
| 2.5125 | 0 |
| 2.51389 | 0 |
| 2.51528 | 0 |
| 2.51667 | 0 |
| 2.51806 | 0 |
| 2.51944 | 0 |
| 2.52083 | 0 |
| 2.52222 | 0 |
| 2.52361 | 0 |
| 2.525 | 0 |
| 2.52639 | 0 |
| 2.52778 | 0 |
| 2.52917 | 0 |
| 2.53056 | 0 |
| 2.53194 | 0 |
| 2.53333 | 0 |
| 2.53472 | 0 |
| 2.53611 | 0 |
| 2.5375 | 0 |
| 2.53889 | 0 |
| 2.54028 | 0 |
| 2.54167 | 0 |
| 2.54306 | 0 |
| 2.54444 | 0 |
| 2.54583 | 0 |
| 2.54722 | 0 |
| 2.54861 | 0 |
| 2.55 | 0 |
| 2.55139 | 0 |
| 2.55278 | 0 |
| 2.55417 | 0 |
| 2.55556 | 0 |
| 2.55694 | 0 |
| 2.55833 | 0 |
| 2.55972 | 0 |
| 2.56111 | 0 |
| 2.5625 | 0 |
| 2.56389 | 0 |
| 2.56528 | 0 |
| 2.56667 | 0 |
| 2.56806 | 0 |
| 2.56944 | 0 |
| 2.57083 | 0 |
| 2.57222 | 0 |
| 2.57361 | 0 |
| 2.575 | 0 |
| 2.57639 | 0 |
| 2.57778 | 0 |
| 2.57917 | 0 |
| 2.58056 | 0 |
| 2.58194 | 0 |
| 2.58333 | 0 |
| 2.58472 | 0 |
| 2.58611 | 0 |
| 2.5875 | 0 |
| 2.58889 | 0 |
| 2.59028 | 0 |
| 2.59167 | 0 |
| 2.59306 | 0 |
| 2.59444 | 0 |
| 2.59583 | 0 |
| 2.59722 | 0 |
| 2.59861 | 0 |
| 2.6 | 0 |
| 2.60139 | 0 |
| 2.60278 | 0 |
| 2.60417 | 0 |
| 2.60556 | 0 |
| 2.60694 | 0 |
| 2.60833 | 0 |
| 2.60972 | 0 |
| 2.61111 | 0 |
| 2.6125 | 0 |
| 2.61389 | 0 |
| 2.61528 | 0 |
| 2.61667 | 0 |
| 2.61806 | 0 |
| 2.61944 | 0 |
| 2.62083 | 0 |
| 2.62222 | 0 |
| 2.62361 | 0 |
| 2.625 | 0 |
| 2.62639 | 0 |
| 2.62778 | 0 |
| 2.62917 | 0 |
| 2.63056 | 0 |
| 2.63194 | 0 |
| 2.63333 | 0 |
| 2.63472 | 0 |
| 2.63611 | 0 |
| 2.6375 | 0 |
| 2.63889 | 0 |
| 2.64028 | 0 |
| 2.64167 | 0 |
| 2.64306 | 0 |
| 2.64444 | 0 |
| 2.64583 | 0 |
| 2.64722 | 0 |
| 2.64861 | 0 |
| 2.65 | 0 |
| 2.65139 | 0 |
| 2.65278 | 0 |
| 2.65417 | 0 |
| 2.65556 | 0 |
| 2.65694 | 0 |
| 2.65833 | 0 |
| 2.65972 | 0 |
| 2.66111 | 0 |
| 2.6625 | 0 |
| 2.66389 | 0 |
| 2.66528 | 0 |
| 2.66667 | 0 |
| 2.66806 | 0 |
| 2.66944 | 0 |
| 2.67083 | 0 |
| 2.67222 | 0 |
| 2.67361 | 0 |
| 2.675 | 0 |
| 2.67639 | 0 |
| 2.67778 | 0 |
| 2.67917 | 0 |
| 2.68056 | 0 |
| 2.68194 | 0 |
| 2.68333 | 0 |
| 2.68472 | 0 |
| 2.68611 | 0 |
| 2.6875 | 0 |
| 2.68889 | 0 |
| 2.69028 | 0 |
| 2.69167 | 0 |
| 2.69306 | 0 |
| 2.69444 | 0 |
| 2.69583 | 0 |
| 2.69722 | 0 |
| 2.69861 | 0 |
| 2.7 | 0 |
| 2.70139 | 0 |
| 2.70278 | 0 |
| 2.70417 | 0 |
| 2.70556 | 0 |
| 2.70694 | 0 |
| 2.70833 | 0 |
| 2.70972 | 0 |
| 2.71111 | 0 |
| 2.7125 | 0 |
| 2.71389 | 0 |
| 2.71528 | 0 |
| 2.71667 | 0 |
| 2.71806 | 0 |
| 2.71944 | 0 |
| 2.72083 | 0 |
| 2.72222 | 0 |
| 2.72361 | 0 |
| 2.725 | 0 |
| 2.72639 | 0 |
| 2.72778 | 0 |
| 2.72917 | 0 |
| 2.73056 | 0 |
| 2.73194 | 0 |
| 2.73333 | 0 |
| 2.73472 | 0 |
| 2.73611 | 0 |
| 2.7375 | 0 |
| 2.73889 | 0 |
| 2.74028 | 0 |
| 2.74167 | 0 |
| 2.74306 | 0 |
| 2.74444 | 0 |
| 2.74583 | 0 |
| 2.74722 | 0 |
| 2.74861 | 0 |
| 2.75 | 0 |
| 2.75139 | 0 |
| 2.75278 | 0 |
| 2.75417 | 0 |
| 2.75556 | 0 |
| 2.75694 | 0 |
| 2.75833 | 0 |
| 2.75972 | 0 |
| 2.76111 | 0 |
| 2.7625 | 0 |
| 2.76389 | 0 |
| 2.76528 | 0 |
| 2.76667 | 0 |
| 2.76806 | 0 |
| 2.76944 | 0 |
| 2.77083 | 0 |
| 2.77222 | 0 |
| 2.77361 | 0 |
| 2.775 | 0 |
| 2.77639 | 0 |
| 2.77778 | 0 |
| 2.77917 | 0 |
| 2.78056 | 0 |
| 2.78194 | 0 |
| 2.78333 | 0 |
| 2.78472 | 0 |
| 2.78611 | 0 |
| 2.7875 | 0 |
| 2.78889 | 0 |
| 2.79028 | 0 |
| 2.79167 | 0 |
| 2.79306 | 0 |
| 2.79444 | 0 |
| 2.79583 | 0 |
| 2.79722 | 0 |
| 2.79861 | 0 |
| 2.8 | 0 |
| 2.80139 | 0 |
| 2.80278 | 0 |
| 2.80417 | 0 |
| 2.80556 | 0 |
| 2.80694 | 0 |
| 2.80833 | 0 |
| 2.80972 | 0 |
| 2.81111 | 0 |
| 2.8125 | 0 |
| 2.81389 | 0 |
| 2.81528 | 0 |
| 2.81667 | 0 |
| 2.81806 | 0 |
| 2.81944 | 0 |
| 2.82083 | 0 |
| 2.82222 | 0 |
| 2.82361 | 0 |
| 2.825 | 0 |
| 2.82639 | 0 |
| 2.82778 | 0 |
| 2.82917 | 0 |
| 2.83056 | 0 |
| 2.83194 | 0 |
| 2.83333 | 0 |
| 2.83472 | 0 |
| 2.83611 | 0 |
| 2.8375 | 0 |
| 2.83889 | 0 |
| 2.84028 | 0 |
| 2.84167 | 0 |
| 2.84306 | 0 |
| 2.84444 | 0 |
| 2.84583 | 0 |
| 2.84722 | 0 |
| 2.84861 | 0 |
| 2.85 | 0 |
| 2.85139 | 0 |
| 2.85278 | 0 |
| 2.85417 | 0 |
| 2.85556 | 0 |
| 2.85694 | 0 |
| 2.85833 | 0 |
| 2.85972 | 0 |
| 2.86111 | 0 |
| 2.8625 | 0 |
| 2.86389 | 0 |
| 2.86528 | 0 |
| 2.86667 | 0 |
| 2.86806 | 0 |
| 2.86944 | 0 |
| 2.87083 | 0 |
| 2.87222 | 0 |
| 2.87361 | 0 |
| 2.875 | 0 |
| 2.87639 | 0 |
| 2.87778 | 0 |
| 2.87917 | 0 |
| 2.88056 | 0 |
| 2.88194 | 0 |
| 2.88333 | 0 |
| 2.88472 | 0 |
| 2.88611 | 0 |
| 2.8875 | 0 |
| 2.88889 | 0 |
| 2.89028 | 0 |
| 2.89167 | 0 |
| 2.89306 | 0 |
| 2.89444 | 0 |
| 2.89583 | 0 |
| 2.89722 | 0 |
| 2.89861 | 0 |
| 2.9 | 0 |
| 2.90139 | 0 |
| 2.90278 | 0 |
| 2.90417 | 0 |
| 2.90556 | 0 |
| 2.90694 | 0 |
| 2.90833 | 0 |
| 2.90972 | 0 |
| 2.91111 | 0 |
| 2.9125 | 0 |
| 2.91389 | 0 |
| 2.91528 | 0 |
| 2.91667 | 0 |
| 2.91806 | 0 |
| 2.91944 | 0 |
| 2.92083 | 0 |
| 2.92222 | 0 |
| 2.92361 | 0 |
| 2.925 | 0 |
| 2.92639 | 0 |
| 2.92778 | 0 |
| 2.92917 | 0 |
| 2.93056 | 0 |
| 2.93194 | 0 |
| 2.93333 | 0 |
| 2.93472 | 0 |
| 2.93611 | 0 |
| 2.9375 | 0 |
| 2.93889 | 0 |
| 2.94028 | 0 |
| 2.94167 | 0 |
| 2.94306 | 0 |
| 2.94444 | 0 |
| 2.94583 | 0 |
| 2.94722 | 0 |
| 2.94861 | 0 |
| 2.95 | 0 |
| 2.95139 | 0 |
| 2.95278 | 0 |
| 2.95417 | 0 |
| 2.95556 | 0 |
| 2.95694 | 0 |
| 2.95833 | 0 |
| 2.95972 | 0 |
| 2.96111 | 0 |
| 2.9625 | 0 |
| 2.96389 | 0 |
| 2.96528 | 0 |
| 2.96667 | 0 |
| 2.96806 | 0 |
| 2.96944 | 0 |
| 2.97083 | 0 |
| 2.97222 | 0 |
| 2.97361 | 0 |
| 2.975 | 0 |
| 2.97639 | 0 |
| 2.97778 | 0 |
| 2.97917 | 0 |
| 2.98056 | 0 |
| 2.98194 | 0 |
| 2.98333 | 0 |
| 2.98472 | 0 |
| 2.98611 | 0 |
| 2.9875 | 0 |
| 2.98889 | 0 |
| 2.99028 | 0 |
| 2.99167 | 0 |
| 2.99306 | 0 |
| 2.99444 | 0 |
| 2.99583 | 0 |
| 2.99722 | 0 |
| 2.99861 | 0 |
| 3.0 | 0 |
| 3.00139 | 0 |
| 3.00278 | 0 |
| 3.00417 | 0 |
| 3.00556 | 0 |
| 3.00694 | 0 |
| 3.00833 | 0 |
| 3.00972 | 0 |
| 3.01111 | 0 |
| 3.0125 | 0 |
| 3.01389 | 0 |
| 3.01528 | 0 |
| 3.01667 | 0 |
| 3.01806 | 0 |
| 3.01944 | 0 |
| 3.02083 | 0 |
| 3.02222 | 0 |
| 3.02361 | 0 |
| 3.025 | 0 |
| 3.02639 | 0 |
| 3.02778 | 0 |
| 3.02917 | 0 |
| 3.03056 | 0 |
| 3.03194 | 0 |
| 3.03333 | 0 |
| 3.03472 | 0 |
| 3.03611 | 0 |
| 3.0375 | 0 |
| 3.03889 | 0 |
| 3.04028 | 0 |
| 3.04167 | 0 |
| 3.04306 | 0 |
| 3.04444 | 0 |
| 3.04583 | 0 |
| 3.04722 | 0 |
| 3.04861 | 0 |
| 3.05 | 0 |
| 3.05139 | 0 |
| 3.05278 | 0 |
| 3.05417 | 0 |
| 3.05556 | 0 |
| 3.05694 | 0 |
| 3.05833 | 0 |
| 3.05972 | 0 |
| 3.06111 | 0 |
| 3.0625 | 0 |
| 3.06389 | 0 |
| 3.06528 | 0 |
| 3.06667 | 0 |
| 3.06806 | 0 |
| 3.06944 | 0 |
| 3.07083 | 0 |
| 3.07222 | 0 |
| 3.07361 | 0 |
| 3.075 | 0 |
| 3.07639 | 0 |
| 3.07778 | 0 |
| 3.07917 | 0 |
| 3.08056 | 0 |
| 3.08194 | 0 |
| 3.08333 | 0 |
| 3.08472 | 0 |
| 3.08611 | 0 |
| 3.0875 | 0 |
| 3.08889 | 0 |
| 3.09028 | 0 |
| 3.09167 | 0 |
| 3.09306 | 0 |
| 3.09444 | 0 |
| 3.09583 | 0 |
| 3.09722 | 0 |
| 3.09861 | 0 |
| 3.1 | 0 |
| 3.10139 | 0 |
| 3.10278 | 0 |
| 3.10417 | 0 |
| 3.10556 | 0 |
| 3.10694 | 0 |
| 3.10833 | 0 |
| 3.10972 | 0 |
| 3.11111 | 0 |
| 3.1125 | 0 |
| 3.11389 | 0 |
| 3.11528 | 0 |
| 3.11667 | 0 |
| 3.11806 | 0 |
| 3.11944 | 0 |
| 3.12083 | 0 |
| 3.12222 | 0 |
| 3.12361 | 0 |
| 3.125 | 0 |
| 3.12639 | 0 |
| 3.12778 | 0 |
| 3.12917 | 0 |
| 3.13056 | 0 |
| 3.13194 | 0 |
| 3.13333 | 0 |
| 3.13472 | 0 |
| 3.13611 | 0 |
| 3.1375 | 0 |
| 3.13889 | 0 |
| 3.14028 | 0 |
| 3.14167 | 0 |
| 3.14306 | 0 |
| 3.14444 | 0 |
| 3.14583 | 0 |
| 3.14722 | 0 |
| 3.14861 | 0 |
| 3.15 | 0 |
| 3.15139 | 0 |
| 3.15278 | 0 |
| 3.15417 | 0 |
| 3.15556 | 0 |
| 3.15694 | 0 |
| 3.15833 | 0 |
| 3.15972 | 0 |
| 3.16111 | 0 |
| 3.1625 | 0 |
| 3.16389 | 0 |
| 3.16528 | 0 |
| 3.16667 | 0 |
| 3.16806 | 0 |
| 3.16944 | 0 |
| 3.17083 | 0 |
| 3.17222 | 0 |
| 3.17361 | 0 |
| 3.175 | 0 |
| 3.17639 | 0 |
| 3.17778 | 0 |
| 3.17917 | 0 |
| 3.18056 | 0 |
| 3.18194 | 0 |
| 3.18333 | 0 |
| 3.18472 | 0 |
| 3.18611 | 0 |
| 3.1875 | 0 |
| 3.18889 | 0 |
| 3.19028 | 0 |
| 3.19167 | 0 |
| 3.19306 | 0 |
| 3.19444 | 0 |
| 3.19583 | 0 |
| 3.19722 | 0 |
| 3.19861 | 0 |
| 3.2 | 0 |
| 3.20139 | 0 |
| 3.20278 | 0 |
| 3.20417 | 0 |
| 3.20556 | 0 |
| 3.20694 | 0 |
| 3.20833 | 0 |
| 3.20972 | 0 |
| 3.21111 | 0 |
| 3.2125 | 0 |
| 3.21389 | 0 |
| 3.21528 | 0 |
| 3.21667 | 0 |
| 3.21806 | 0 |
| 3.21944 | 0 |
| 3.22083 | 0 |
| 3.22222 | 0 |
| 3.22361 | 0 |
| 3.225 | 0 |
| 3.22639 | 0 |
| 3.22778 | 0 |
| 3.22917 | 0 |
| 3.23056 | 0 |
| 3.23194 | 0 |
| 3.23333 | 0 |
| 3.23472 | 0 |
| 3.23611 | 0 |
| 3.2375 | 0 |
| 3.23889 | 0 |
| 3.24028 | 0 |
| 3.24167 | 0 |
| 3.24306 | 0 |
| 3.24444 | 0 |
| 3.24583 | 0 |
| 3.24722 | 0 |
| 3.24861 | 0 |
| 3.25 | 0 |
| 3.25139 | 0 |
| 3.25278 | 0 |
| 3.25417 | 0 |
| 3.25556 | 0 |
| 3.25694 | 0 |
| 3.25833 | 0 |
| 3.25972 | 0 |
| 3.26111 | 0 |
| 3.2625 | 0 |
| 3.26389 | 0 |
| 3.26528 | 0 |
| 3.26667 | 0 |
| 3.26806 | 0 |
| 3.26944 | 0 |
| 3.27083 | 0 |
| 3.27222 | 0 |
| 3.27361 | 0 |
| 3.275 | 0 |
| 3.27639 | 0 |
| 3.27778 | 0 |
| 3.27917 | 0 |
| 3.28056 | 0 |
| 3.28194 | 0 |
| 3.28333 | 0 |
| 3.28472 | 0 |
| 3.28611 | 0 |
| 3.2875 | 0 |
| 3.28889 | 0 |
| 3.29028 | 0 |
| 3.29167 | 0 |
| 3.29306 | 0 |
| 3.29444 | 0 |
| 3.29583 | 0 |
| 3.29722 | 0 |
| 3.29861 | 0 |
| 3.3 | 0 |
| 3.30139 | 0 |
| 3.30278 | 0 |
| 3.30417 | 0 |
| 3.30556 | 0 |
| 3.30694 | 0 |
| 3.30833 | 0 |
| 3.30972 | 0 |
| 3.31111 | 0 |
| 3.3125 | 0 |
| 3.31389 | 0 |
| 3.31528 | 0 |
| 3.31667 | 0 |
| 3.31806 | 0 |
| 3.31944 | 0 |
| 3.32083 | 0 |
| 3.32222 | 0 |
| 3.32361 | 0 |
| 3.325 | 0 |
| 3.32639 | 0 |
| 3.32778 | 0 |
| 3.32917 | 0 |
| 3.33056 | 0 |
| 3.33194 | 0 |
| 3.33333 | 0 |
| 3.33472 | 0 |
| 3.33611 | 0 |
| 3.3375 | 0 |
| 3.33889 | 0 |
| 3.34028 | 0 |
| 3.34167 | 0 |
| 3.34306 | 0 |
| 3.34444 | 0 |
| 3.34583 | 0 |
| 3.34722 | 0 |
| 3.34861 | 0 |
| 3.35 | 0 |
| 3.35139 | 0 |
| 3.35278 | 0 |
| 3.35417 | 0 |
| 3.35556 | 0 |
| 3.35694 | 0 |
| 3.35833 | 0 |
| 3.35972 | 0 |
| 3.36111 | 0 |
| 3.3625 | 0 |
| 3.36389 | 0 |
| 3.36528 | 0 |
| 3.36667 | 0 |
| 3.36806 | 0 |
| 3.36944 | 0 |
| 3.37083 | 0 |
| 3.37222 | 0 |
| 3.37361 | 0 |
| 3.375 | 0 |
| 3.37639 | 0 |
| 3.37778 | 0 |
| 3.37917 | 0 |
| 3.38056 | 0 |
| 3.38194 | 0 |
| 3.38333 | 0 |
| 3.38472 | 0 |
| 3.38611 | 0 |
| 3.3875 | 0 |
| 3.38889 | 0 |
| 3.39028 | 0 |
| 3.39167 | 0 |
| 3.39306 | 0 |
| 3.39444 | 0 |
| 3.39583 | 0 |
| 3.39722 | 0 |
| 3.39861 | 0 |
| 3.4 | 0 |
| 3.40139 | 0 |
| 3.40278 | 0 |
| 3.40417 | 0 |
| 3.40556 | 0 |
| 3.40694 | 0 |
| 3.40833 | 0 |
| 3.40972 | 0 |
| 3.41111 | 0 |
| 3.4125 | 0 |
| 3.41389 | 0 |
| 3.41528 | 0 |
| 3.41667 | 0 |
| 3.41806 | 0 |
| 3.41944 | 0 |
| 3.42083 | 0 |
| 3.42222 | 0 |
| 3.42361 | 0 |
| 3.425 | 0 |
| 3.42639 | 0 |
| 3.42778 | 0 |
| 3.42917 | 0 |
| 3.43056 | 0 |
| 3.43194 | 0 |
| 3.43333 | 0 |
| 3.43472 | 0 |
| 3.43611 | 0 |
| 3.4375 | 0 |
| 3.43889 | 0 |
| 3.44028 | 0 |
| 3.44167 | 0 |
| 3.44306 | 0 |
| 3.44444 | 0 |
| 3.44583 | 0 |
| 3.44722 | 0 |
| 3.44861 | 0 |
| 3.45 | 0 |
| 3.45139 | 0 |
| 3.45278 | 0 |
| 3.45417 | 0 |
| 3.45556 | 0 |
| 3.45694 | 0 |
| 3.45833 | 0 |
| 3.45972 | 0 |
| 3.46111 | 0 |
| 3.4625 | 0 |
| 3.46389 | 0 |
| 3.46528 | 0 |
| 3.46667 | 0 |
| 3.46806 | 0 |
| 3.46944 | 0 |
| 3.47083 | 0 |
| 3.47222 | 0 |
| 3.47361 | 0 |
| 3.475 | 0 |
| 3.47639 | 0 |
| 3.47778 | 0 |
| 3.47917 | 0 |
| 3.48056 | 0 |
| 3.48194 | 0 |
| 3.48333 | 0 |
| 3.48472 | 0 |
| 3.48611 | 0 |
| 3.4875 | 0 |
| 3.48889 | 0 |
| 3.49028 | 0 |
| 3.49167 | 0 |
| 3.49306 | 0 |
| 3.49444 | 0 |
| 3.49583 | 0 |
| 3.49722 | 0 |
| 3.49861 | 0 |
| 3.5 | 0 |
| 3.50139 | 0 |
| 3.50278 | 0 |
| 3.50417 | 0 |
| 3.50556 | 0 |
| 3.50694 | 0 |
| 3.50833 | 0 |
| 3.50972 | 0 |
| 3.51111 | 0 |
| 3.5125 | 0 |
| 3.51389 | 0 |
| 3.51528 | 0 |
| 3.51667 | 0 |
| 3.51806 | 0 |
| 3.51944 | 0 |
| 3.52083 | 0 |
| 3.52222 | 0 |
| 3.52361 | 0 |
| 3.525 | 0 |
| 3.52639 | 0 |
| 3.52778 | 0 |
| 3.52917 | 0 |
| 3.53056 | 0 |
| 3.53194 | 0 |
| 3.53333 | 0 |
| 3.53472 | 0 |
| 3.53611 | 0 |
| 3.5375 | 0 |
| 3.53889 | 0 |
| 3.54028 | 0 |
| 3.54167 | 0 |
| 3.54306 | 0 |
| 3.54444 | 0 |
| 3.54583 | 0 |
| 3.54722 | 0 |
| 3.54861 | 0 |
| 3.55 | 0 |
| 3.55139 | 0 |
| 3.55278 | 0 |
| 3.55417 | 0 |
| 3.55556 | 0 |
| 3.55694 | 0 |
| 3.55833 | 0 |
| 3.55972 | 0 |
| 3.56111 | 0 |
| 3.5625 | 0 |
| 3.56389 | 0 |
| 3.56528 | 0 |
| 3.56667 | 0 |
| 3.56806 | 0 |
| 3.56944 | 0 |
| 3.57083 | 0 |
| 3.57222 | 0 |
| 3.57361 | 0 |
| 3.575 | 0 |
| 3.57639 | 0 |
| 3.57778 | 0 |
| 3.57917 | 0 |
| 3.58056 | 0 |
| 3.58194 | 0 |
| 3.58333 | 0 |
| 3.58472 | 0 |
| 3.58611 | 0 |
| 3.5875 | 0 |
| 3.58889 | 0 |
| 3.59028 | 0 |
| 3.59167 | 0 |
| 3.59306 | 0 |
| 3.59444 | 0 |
| 3.59583 | 0 |
| 3.59722 | 0 |
| 3.59861 | 0 |
| 3.6 | 0 |
| 3.60139 | 0 |
| 3.60278 | 0 |
| 3.60417 | 0 |
| 3.60556 | 0 |
| 3.60694 | 0 |
| 3.60833 | 0 |
| 3.60972 | 0 |
| 3.61111 | 0 |
| 3.6125 | 0 |
| 3.61389 | 0 |
| 3.61528 | 0 |
| 3.61667 | 0 |
| 3.61806 | 0 |
| 3.61944 | 0 |
| 3.62083 | 0 |
| 3.62222 | 0 |
| 3.62361 | 0 |
| 3.625 | 0 |
| 3.62639 | 0 |
| 3.62778 | 0 |
| 3.62917 | 0 |
| 3.63056 | 0 |
| 3.63194 | 0 |
| 3.63333 | 0 |
| 3.63472 | 0 |
| 3.63611 | 0 |
| 3.6375 | 0 |
| 3.63889 | 0 |
| 3.64028 | 0 |
| 3.64167 | 0 |
| 3.64306 | 0 |
| 3.64444 | 0 |
| 3.64583 | 0 |
| 3.64722 | 0 |
| 3.64861 | 0 |
| 3.65 | 0 |
| 3.65139 | 0 |
| 3.65278 | 0 |
| 3.65417 | 0 |
| 3.65556 | 0 |
| 3.65694 | 0 |
| 3.65833 | 0 |
| 3.65972 | 0 |
| 3.66111 | 0 |
| 3.6625 | 0 |
| 3.66389 | 0 |
| 3.66528 | 0 |
| 3.66667 | 0 |
| 3.66806 | 0 |
| 3.66944 | 0 |
| 3.67083 | 0 |
| 3.67222 | 0 |
| 3.67361 | 0 |
| 3.675 | 0 |
| 3.67639 | 0 |
| 3.67778 | 0 |
| 3.67917 | 0 |
| 3.68056 | 0 |
| 3.68194 | 0 |
| 3.68333 | 0 |
| 3.68472 | 0 |
| 3.68611 | 0 |
| 3.6875 | 0 |
| 3.68889 | 0 |
| 3.69028 | 0 |
| 3.69167 | 0 |
| 3.69306 | 0 |
| 3.69444 | 0 |
| 3.69583 | 0 |
| 3.69722 | 0 |
| 3.69861 | 0 |
| 3.7 | 0 |
| 3.70139 | 0 |
| 3.70278 | 0 |
| 3.70417 | 0 |
| 3.70556 | 0 |
| 3.70694 | 0 |
| 3.70833 | 0 |
| 3.70972 | 0 |
| 3.71111 | 0 |
| 3.7125 | 0 |
| 3.71389 | 0 |
| 3.71528 | 0 |
| 3.71667 | 0 |
| 3.71806 | 0 |
| 3.71944 | 0 |
| 3.72083 | 0 |
| 3.72222 | 0 |
| 3.72361 | 0 |
| 3.725 | 0 |
| 3.72639 | 0 |
| 3.72778 | 0 |
| 3.72917 | 0 |
| 3.73056 | 0 |
| 3.73194 | 0 |
| 3.73333 | 0 |
| 3.73472 | 0 |
| 3.73611 | 0 |
| 3.7375 | 0 |
| 3.73889 | 0 |
| 3.74028 | 0 |
| 3.74167 | 0 |
| 3.74306 | 0 |
| 3.74444 | 0 |
| 3.74583 | 0 |
| 3.74722 | 0 |
| 3.74861 | 0 |
| 3.75 | 0 |
| 3.75139 | 0 |
| 3.75278 | 0 |
| 3.75417 | 0 |
| 3.75556 | 0 |
| 3.75694 | 0 |
| 3.75833 | 0 |
| 3.75972 | 0 |
| 3.76111 | 0 |
| 3.7625 | 0 |
| 3.76389 | 0 |
| 3.76528 | 0 |
| 3.76667 | 0 |
| 3.76806 | 0 |
| 3.76944 | 0 |
| 3.77083 | 0 |
| 3.77222 | 0 |
| 3.77361 | 0 |
| 3.775 | 0 |
| 3.77639 | 0 |
| 3.77778 | 0 |
| 3.77917 | 0 |
| 3.78056 | 0 |
| 3.78194 | 0 |
| 3.78333 | 0 |
| 3.78472 | 0 |
| 3.78611 | 0 |
| 3.7875 | 0 |
| 3.78889 | 0 |
| 3.79028 | 0 |
| 3.79167 | 0 |
| 3.79306 | 0 |
| 3.79444 | 0 |
| 3.79583 | 0 |
| 3.79722 | 0 |
| 3.79861 | 0 |
| 3.8 | 0 |
| 3.80139 | 0 |
| 3.80278 | 0 |
| 3.80417 | 0 |
| 3.80556 | 0 |
| 3.80694 | 0 |
| 3.80833 | 0 |
| 3.80972 | 0 |
| 3.81111 | 0 |
| 3.8125 | 0 |
| 3.81389 | 0 |
| 3.81528 | 0 |
| 3.81667 | 0 |
| 3.81806 | 0 |
| 3.81944 | 0 |
| 3.82083 | 0 |
| 3.82222 | 0 |
| 3.82361 | 0 |
| 3.825 | 0 |
| 3.82639 | 0 |
| 3.82778 | 0 |
| 3.82917 | 0 |
| 3.83056 | 0 |
| 3.83194 | 0 |
| 3.83333 | 0 |
| 3.83472 | 0 |
| 3.83611 | 0 |
| 3.8375 | 0 |
| 3.83889 | 0 |
| 3.84028 | 0 |
| 3.84167 | 0 |
| 3.84306 | 0 |
| 3.84444 | 0 |
| 3.84583 | 0 |
| 3.84722 | 0 |
| 3.84861 | 0 |
| 3.85 | 0 |
| 3.85139 | 0 |
| 3.85278 | 0 |
| 3.85417 | 0 |
| 3.85556 | 0 |
| 3.85694 | 0 |
| 3.85833 | 0 |
| 3.85972 | 0 |
| 3.86111 | 0 |
| 3.8625 | 0 |
| 3.86389 | 0 |
| 3.86528 | 0 |
| 3.86667 | 0 |
| 3.86806 | 0 |
| 3.86944 | 0 |
| 3.87083 | 0 |
| 3.87222 | 0 |
| 3.87361 | 0 |
| 3.875 | 0 |
| 3.87639 | 0 |
| 3.87778 | 0 |
| 3.87917 | 0 |
| 3.88056 | 0 |
| 3.88194 | 0 |
| 3.88333 | 0 |
| 3.88472 | 0 |
| 3.88611 | 0 |
| 3.8875 | 0 |
| 3.88889 | 0 |
| 3.89028 | 0 |
| 3.89167 | 0 |
| 3.89306 | 0 |
| 3.89444 | 0 |
| 3.89583 | 0 |
| 3.89722 | 0 |
| 3.89861 | 0 |
| 3.9 | 0 |
| 3.90139 | 0 |
| 3.90278 | 0 |
| 3.90417 | 0 |
| 3.90556 | 0 |
| 3.90694 | 0 |
| 3.90833 | 0 |
| 3.90972 | 0 |
| 3.91111 | 0 |
| 3.9125 | 0 |
| 3.91389 | 0 |
| 3.91528 | 0 |
| 3.91667 | 0 |
| 3.91806 | 0 |
| 3.91944 | 0 |
| 3.92083 | 0 |
| 3.92222 | 0 |
| 3.92361 | 0 |
| 3.925 | 0 |
| 3.92639 | 0 |
| 3.92778 | 0 |
| 3.92917 | 0 |
| 3.93056 | 0 |
| 3.93194 | 0 |
| 3.93333 | 0 |
| 3.93472 | 0 |
| 3.93611 | 0 |
| 3.9375 | 0 |
| 3.93889 | 0 |
| 3.94028 | 0 |
| 3.94167 | 0 |
| 3.94306 | 0 |
| 3.94444 | 0 |
| 3.94583 | 0 |
| 3.94722 | 0 |
| 3.94861 | 0 |
| 3.95 | 0 |
| 3.95139 | 0 |
| 3.95278 | 0 |
| 3.95417 | 0 |
| 3.95556 | 0 |
| 3.95694 | 0 |
| 3.95833 | 0 |
| 3.95972 | 0 |
| 3.96111 | 0 |
| 3.9625 | 0 |
| 3.96389 | 0 |
| 3.96528 | 0 |
| 3.96667 | 0 |
| 3.96806 | 0 |
| 3.96944 | 0 |
| 3.97083 | 0 |
| 3.97222 | 0 |
| 3.97361 | 0 |
| 3.975 | 0 |
| 3.97639 | 0 |
| 3.97778 | 0 |
| 3.97917 | 0 |
| 3.98056 | 0 |
| 3.98194 | 0 |
| 3.98333 | 0 |
| 3.98472 | 0 |
| 3.98611 | 0 |
| 3.9875 | 0 |
| 3.98889 | 0 |
| 3.99028 | 0 |
| 3.99167 | 0 |
| 3.99306 | 0 |
| 3.99444 | 0 |
| 3.99583 | 0 |
| 3.99722 | 0 |
| 3.99861 | 0 |
| 4.0 | 0 |
| 4.00139 | 0 |
| 4.00278 | 0 |
| 4.00417 | 0 |
| 4.00556 | 0 |
| 4.00694 | 0 |
| 4.00833 | 0 |
| 4.00972 | 0 |
| 4.01111 | 0 |
| 4.0125 | 0 |
| 4.01389 | 0 |
| 4.01528 | 0 |
| 4.01667 | 0 |
| 4.01806 | 0 |
| 4.01944 | 0 |
| 4.02083 | 0 |
| 4.02222 | 0 |
| 4.02361 | 0 |
| 4.025 | 0 |
| 4.02639 | 0 |
| 4.02778 | 0 |
| 4.02917 | 0 |
| 4.03056 | 0 |
| 4.03194 | 0 |
| 4.03333 | 0 |
| 4.03472 | 0 |
| 4.03611 | 0 |
| 4.0375 | 0 |
| 4.03889 | 0 |
| 4.04028 | 0 |
| 4.04167 | 0 |
| 4.04306 | 0 |
| 4.04444 | 0 |
| 4.04583 | 0 |
| 4.04722 | 0 |
| 4.04861 | 0 |
| 4.05 | 0 |
| 4.05139 | 0 |
| 4.05278 | 0 |
| 4.05417 | 0 |
| 4.05556 | 0 |
| 4.05694 | 0 |
| 4.05833 | 0 |
| 4.05972 | 0 |
| 4.06111 | 0 |
| 4.0625 | 0 |
| 4.06389 | 0 |
| 4.06528 | 0 |
| 4.06667 | 0 |
| 4.06806 | 0 |
| 4.06944 | 0 |
| 4.07083 | 0 |
| 4.07222 | 0 |
| 4.07361 | 0 |
| 4.075 | 0 |
| 4.07639 | 0 |
| 4.07778 | 0 |
| 4.07917 | 0 |
| 4.08056 | 0 |
| 4.08194 | 0 |
| 4.08333 | 0 |
| 4.08472 | 0 |
| 4.08611 | 0 |
| 4.0875 | 0 |
| 4.08889 | 0 |
| 4.09028 | 0 |
| 4.09167 | 0 |
| 4.09306 | 0 |
| 4.09444 | 0 |
| 4.09583 | 0 |
| 4.09722 | 0 |
| 4.09861 | 0 |
| 4.1 | 0 |
| 4.10139 | 0 |
| 4.10278 | 0 |
| 4.10417 | 0 |
| 4.10556 | 0 |
| 4.10694 | 0 |
| 4.10833 | 0 |
| 4.10972 | 0 |
| 4.11111 | 0 |
| 4.1125 | 0 |
| 4.11389 | 0 |
| 4.11528 | 0 |
| 4.11667 | 0 |
| 4.11806 | 0 |
| 4.11944 | 0 |
| 4.12083 | 0 |
| 4.12222 | 0 |
| 4.12361 | 0 |
| 4.125 | 0 |
| 4.12639 | 0 |
| 4.12778 | 0 |
| 4.12917 | 0 |
| 4.13056 | 0 |
| 4.13194 | 0 |
| 4.13333 | 0 |
| 4.13472 | 0 |
| 4.13611 | 0 |
| 4.1375 | 0 |
| 4.13889 | 0 |
| 4.14028 | 0 |
| 4.14167 | 0 |
| 4.14306 | 0 |
| 4.14444 | 0 |
| 4.14583 | 0 |
| 4.14722 | 0 |
| 4.14861 | 0 |
| 4.15 | 0 |
| 4.15139 | 0 |
| 4.15278 | 0 |
| 4.15417 | 0 |
| 4.15556 | 0 |
| 4.15694 | 0 |
| 4.15833 | 0 |
| 4.15972 | 0 |
| 4.16111 | 0 |
| 4.1625 | 0 |
| 4.16389 | 0 |
| 4.16528 | 0 |
| 4.16667 | 0 |
| 4.16806 | 0 |
| 4.16944 | 0 |
| 4.17083 | 0 |
| 4.17222 | 0 |
| 4.17361 | 0 |
| 4.175 | 0 |
| 4.17639 | 0 |
| 4.17778 | 0 |
| 4.17917 | 0 |
| 4.18056 | 0 |
| 4.18194 | 0 |
| 4.18333 | 0 |
| 4.18472 | 0 |
| 4.18611 | 0 |
| 4.1875 | 0 |
| 4.18889 | 0 |
| 4.19028 | 0 |
| 4.19167 | 0 |
| 4.19306 | 0 |
| 4.19444 | 0 |
| 4.19583 | 0 |
| 4.19722 | 0 |
| 4.19861 | 0 |
| 4.2 | 0 |
| 4.20139 | 0 |
| 4.20278 | 0 |
| 4.20417 | 0 |
| 4.20556 | 0 |
| 4.20694 | 0 |
| 4.20833 | 0 |
| 4.20972 | 0 |
| 4.21111 | 0 |
| 4.2125 | 0 |
| 4.21389 | 0 |
| 4.21528 | 0 |
| 4.21667 | 0 |
| 4.21806 | 0 |
| 4.21944 | 0 |
| 4.22083 | 0 |
| 4.22222 | 0 |
| 4.22361 | 0 |
| 4.225 | 0 |
| 4.22639 | 0 |
| 4.22778 | 0 |
| 4.22917 | 0 |
| 4.23056 | 0 |
| 4.23194 | 0 |
| 4.23333 | 0 |
| 4.23472 | 0 |
| 4.23611 | 0 |
| 4.2375 | 0 |
| 4.23889 | 0 |
| 4.24028 | 0 |
| 4.24167 | 0 |
| 4.24306 | 0 |
| 4.24444 | 0 |
| 4.24583 | 0 |
| 4.24722 | 0 |
| 4.24861 | 0 |
| 4.25 | 0 |
| 4.25139 | 0 |
| 4.25278 | 0 |
| 4.25417 | 0 |
| 4.25556 | 0 |
| 4.25694 | 0 |
| 4.25833 | 0 |
| 4.25972 | 0 |
| 4.26111 | 0 |
| 4.2625 | 0 |
| 4.26389 | 0 |
| 4.26528 | 0 |
| 4.26667 | 0 |
| 4.26806 | 0 |
| 4.26944 | 0 |
| 4.27083 | 0 |
| 4.27222 | 0 |
| 4.27361 | 0 |
| 4.275 | 0 |
| 4.27639 | 0 |
| 4.27778 | 0 |
| 4.27917 | 0 |
| 4.28056 | 0 |
| 4.28194 | 0 |
| 4.28333 | 0 |
| 4.28472 | 0 |
| 4.28611 | 0 |
| 4.2875 | 0 |
| 4.28889 | 0 |
| 4.29028 | 0 |
| 4.29167 | 0 |
| 4.29306 | 0 |
| 4.29444 | 0 |
| 4.29583 | 0 |
| 4.29722 | 0 |
| 4.29861 | 0 |
| 4.3 | 0 |
| 4.30139 | 0 |
| 4.30278 | 0 |
| 4.30417 | 0 |
| 4.30556 | 0 |
| 4.30694 | 0 |
| 4.30833 | 0 |
| 4.30972 | 0 |
| 4.31111 | 0 |
| 4.3125 | 0 |
| 4.31389 | 0 |
| 4.31528 | 0 |
| 4.31667 | 0 |
| 4.31806 | 0 |
| 4.31944 | 0 |
| 4.32083 | 0 |
| 4.32222 | 0 |
| 4.32361 | 0 |
| 4.325 | 0 |
| 4.32639 | 0 |
| 4.32778 | 0 |
| 4.32917 | 0 |
| 4.33056 | 0 |
| 4.33194 | 0 |
| 4.33333 | 0 |
| 4.33472 | 0 |
| 4.33611 | 0 |
| 4.3375 | 0 |
| 4.33889 | 0 |
| 4.34028 | 0 |
| 4.34167 | 0 |
| 4.34306 | 0 |
| 4.34444 | 0 |
| 4.34583 | 0 |
| 4.34722 | 0 |
| 4.34861 | 0 |
| 4.35 | 0 |
| 4.35139 | 0 |
| 4.35278 | 0 |
| 4.35417 | 0 |
| 4.35556 | 0 |
| 4.35694 | 0 |
| 4.35833 | 0 |
| 4.35972 | 0 |
| 4.36111 | 0 |
| 4.3625 | 0 |
| 4.36389 | 0 |
| 4.36528 | 0 |
| 4.36667 | 0 |
| 4.36806 | 0 |
| 4.36944 | 0 |
| 4.37083 | 0 |
| 4.37222 | 0 |
| 4.37361 | 0 |
| 4.375 | 0 |
| 4.37639 | 0 |
| 4.37778 | 0 |
| 4.37917 | 0 |
| 4.38056 | 0 |
| 4.38194 | 0 |
| 4.38333 | 0 |
| 4.38472 | 0 |
| 4.38611 | 0 |
| 4.3875 | 0 |
| 4.38889 | 0 |
| 4.39028 | 0 |
| 4.39167 | 0 |
| 4.39306 | 0 |
| 4.39444 | 0 |
| 4.39583 | 0 |
| 4.39722 | 0 |
| 4.39861 | 0 |
| 4.4 | 0 |
| 4.40139 | 0 |
| 4.40278 | 0 |
| 4.40417 | 0 |
| 4.40556 | 0 |
| 4.40694 | 0 |
| 4.40833 | 0 |
| 4.40972 | 0 |
| 4.41111 | 0 |
| 4.4125 | 0 |
| 4.41389 | 0 |
| 4.41528 | 0 |
| 4.41667 | 0 |
| 4.41806 | 0 |
| 4.41944 | 0 |
| 4.42083 | 0 |
| 4.42222 | 0 |
| 4.42361 | 0 |
| 4.425 | 0 |
| 4.42639 | 0 |
| 4.42778 | 0 |
| 4.42917 | 0 |
| 4.43056 | 0 |
| 4.43194 | 0 |
| 4.43333 | 0 |
| 4.43472 | 0 |
| 4.43611 | 0 |
| 4.4375 | 0 |
| 4.43889 | 0 |
| 4.44028 | 0 |
| 4.44167 | 0 |
| 4.44306 | 0 |
| 4.44444 | 0 |
| 4.44583 | 0 |
| 4.44722 | 0 |
| 4.44861 | 0 |
| 4.45 | 0 |
| 4.45139 | 0 |
| 4.45278 | 0 |
| 4.45417 | 0 |
| 4.45556 | 0 |
| 4.45694 | 0 |
| 4.45833 | 0 |
| 4.45972 | 0 |
| 4.46111 | 0 |
| 4.4625 | 0 |
| 4.46389 | 0 |
| 4.46528 | 0 |
| 4.46667 | 0 |
| 4.46806 | 0 |
| 4.46944 | 0 |
| 4.47083 | 0 |
| 4.47222 | 0 |
| 4.47361 | 0 |
| 4.475 | 0 |
| 4.47639 | 0 |
| 4.47778 | 0 |
| 4.47917 | 0 |
| 4.48056 | 0 |
| 4.48194 | 0 |
| 4.48333 | 0 |
| 4.48472 | 0 |
| 4.48611 | 0 |
| 4.4875 | 0 |
| 4.48889 | 0 |
| 4.49028 | 0 |
| 4.49167 | 0 |
| 4.49306 | 0 |
| 4.49444 | 0 |
| 4.49583 | 0 |
| 4.49722 | 0 |
| 4.49861 | 0 |
| 4.5 | 0 |
| 4.50139 | 0 |
| 4.50278 | 0 |
| 4.50417 | 0 |
| 4.50556 | 0 |
| 4.50694 | 0 |
| 4.50833 | 0 |
| 4.50972 | 0 |
| 4.51111 | 0 |
| 4.5125 | 0 |
| 4.51389 | 0 |
| 4.51528 | 0 |
| 4.51667 | 0 |
| 4.51806 | 0 |
| 4.51944 | 0 |
| 4.52083 | 0 |
| 4.52222 | 0 |
| 4.52361 | 0 |
| 4.525 | 0 |
| 4.52639 | 0 |
| 4.52778 | 0 |
| 4.52917 | 0 |
| 4.53056 | 0 |
| 4.53194 | 0 |
| 4.53333 | 0 |
| 4.53472 | 0 |
| 4.53611 | 0 |
| 4.5375 | 0 |
| 4.53889 | 0 |
| 4.54028 | 0 |
| 4.54167 | 0 |
| 4.54306 | 0 |
| 4.54444 | 0 |
| 4.54583 | 0 |
| 4.54722 | 0 |
| 4.54861 | 0 |
| 4.55 | 0 |
| 4.55139 | 0 |
| 4.55278 | 0 |
| 4.55417 | 0 |
| 4.55556 | 0 |
| 4.55694 | 0 |
| 4.55833 | 0 |
| 4.55972 | 0 |
| 4.56111 | 0 |
| 4.5625 | 0 |
| 4.56389 | 0 |
| 4.56528 | 0 |
| 4.56667 | 0 |
| 4.56806 | 0 |
| 4.56944 | 0 |
| 4.57083 | 0 |
| 4.57222 | 0 |
| 4.57361 | 0 |
| 4.575 | 0 |
| 4.57639 | 0 |
| 4.57778 | 0 |
| 4.57917 | 0 |
| 4.58056 | 0 |
| 4.58194 | 0 |
| 4.58333 | 0 |
| 4.58472 | 0 |
| 4.58611 | 0 |
| 4.5875 | 0 |
| 4.58889 | 0 |
| 4.59028 | 0 |
| 4.59167 | 0 |
| 4.59306 | 0 |
| 4.59444 | 0 |
| 4.59583 | 0 |
| 4.59722 | 0 |
| 4.59861 | 0 |
| 4.6 | 0 |
| 4.60139 | 0 |
| 4.60278 | 0 |
| 4.60417 | 0 |
| 4.60556 | 0 |
| 4.60694 | 0 |
| 4.60833 | 0 |
| 4.60972 | 0 |
| 4.61111 | 0 |
| 4.6125 | 0 |
| 4.61389 | 0 |
| 4.61528 | 0 |
| 4.61667 | 0 |
| 4.61806 | 0 |
| 4.61944 | 0 |
| 4.62083 | 0 |
| 4.62222 | 0 |
| 4.62361 | 0 |
| 4.625 | 0 |
| 4.62639 | 0 |
| 4.62778 | 0 |
| 4.62917 | 0 |
| 4.63056 | 0 |
| 4.63194 | 0 |
| 4.63333 | 0 |
| 4.63472 | 0 |
| 4.63611 | 0 |
| 4.6375 | 0 |
| 4.63889 | 0 |
| 4.64028 | 0 |
| 4.64167 | 0 |
| 4.64306 | 0 |
| 4.64444 | 0 |
| 4.64583 | 0 |
| 4.64722 | 0 |
| 4.64861 | 0 |
| 4.65 | 0 |
| 4.65139 | 0 |
| 4.65278 | 0 |
| 4.65417 | 0 |
| 4.65556 | 0 |
| 4.65694 | 0 |
| 4.65833 | 0 |
| 4.65972 | 0 |
| 4.66111 | 0 |
| 4.6625 | 0 |
| 4.66389 | 0 |
| 4.66528 | 0 |
| 4.66667 | 0 |
| 4.66806 | 0 |
| 4.66944 | 0 |
| 4.67083 | 0 |
| 4.67222 | 0 |
| 4.67361 | 0 |
| 4.675 | 0 |
| 4.67639 | 0 |
| 4.67778 | 0 |
| 4.67917 | 0 |
| 4.68056 | 0 |
| 4.68194 | 0 |
| 4.68333 | 0 |
| 4.68472 | 0 |
| 4.68611 | 0 |
| 4.6875 | 0 |
| 4.68889 | 0 |
| 4.69028 | 0 |
| 4.69167 | 0 |
| 4.69306 | 0 |
| 4.69444 | 0 |
| 4.69583 | 0 |
| 4.69722 | 0 |
| 4.69861 | 0 |
| 4.7 | 0 |
| 4.70139 | 0 |
| 4.70278 | 0 |
| 4.70417 | 0 |
| 4.70556 | 0 |
| 4.70694 | 0 |
| 4.70833 | 0 |
| 4.70972 | 0 |
| 4.71111 | 0 |
| 4.7125 | 0 |
| 4.71389 | 0 |
| 4.71528 | 0 |
| 4.71667 | 0 |
| 4.71806 | 0 |
| 4.71944 | 0 |
| 4.72083 | 0 |
| 4.72222 | 0 |
| 4.72361 | 0 |
| 4.725 | 0 |
| 4.72639 | 0 |
| 4.72778 | 0 |
| 4.72917 | 0 |
| 4.73056 | 0 |
| 4.73194 | 0 |
| 4.73333 | 0 |
| 4.73472 | 0 |
| 4.73611 | 0 |
| 4.7375 | 0 |
| 4.73889 | 0 |
| 4.74028 | 0 |
| 4.74167 | 0 |
| 4.74306 | 0 |
| 4.74444 | 0 |
| 4.74583 | 0 |
| 4.74722 | 0 |
| 4.74861 | 0 |
| 4.75 | 0 |
| 4.75139 | 0 |
| 4.75278 | 0 |
| 4.75417 | 0 |
| 4.75556 | 0 |
| 4.75694 | 0 |
| 4.75833 | 0 |
| 4.75972 | 0 |
| 4.76111 | 0 |
| 4.7625 | 0 |
| 4.76389 | 0 |
| 4.76528 | 0 |
| 4.76667 | 0 |
| 4.76806 | 0 |
| 4.76944 | 0 |
| 4.77083 | 0 |
| 4.77222 | 0 |
| 4.77361 | 0 |
| 4.775 | 0 |
| 4.77639 | 0 |
| 4.77778 | 0 |
| 4.77917 | 0 |
| 4.78056 | 0 |
| 4.78194 | 0 |
| 4.78333 | 0 |
| 4.78472 | 0 |
| 4.78611 | 0 |
| 4.7875 | 0 |
| 4.78889 | 0 |
| 4.79028 | 0 |
| 4.79167 | 0 |
| 4.79306 | 0 |
| 4.79444 | 0 |
| 4.79583 | 0 |
| 4.79722 | 0 |
| 4.79861 | 0 |
| 4.8 | 0 |
| 4.80139 | 0 |
| 4.80278 | 0 |
| 4.80417 | 0 |
| 4.80556 | 0 |
| 4.80694 | 0 |
| 4.80833 | 0 |
| 4.80972 | 0 |
| 4.81111 | 0 |
| 4.8125 | 0 |
| 4.81389 | 0 |
| 4.81528 | 0 |
| 4.81667 | 0 |
| 4.81806 | 0 |
| 4.81944 | 0 |
| 4.82083 | 0 |
| 4.82222 | 0 |
| 4.82361 | 0 |
| 4.825 | 0 |
| 4.82639 | 0 |
| 4.82778 | 0 |
| 4.82917 | 0 |
| 4.83056 | 0 |
| 4.83194 | 0 |
| 4.83333 | 0 |
| 4.83472 | 0 |
| 4.83611 | 0 |
| 4.8375 | 0 |
| 4.83889 | 0 |
| 4.84028 | 0 |
| 4.84167 | 0 |
| 4.84306 | 0 |
| 4.84444 | 0 |
| 4.84583 | 0 |
| 4.84722 | 0 |
| 4.84861 | 0 |
| 4.85 | 0 |
| 4.85139 | 0 |
| 4.85278 | 0 |
| 4.85417 | 0 |
| 4.85556 | 0 |
| 4.85694 | 0 |
| 4.85833 | 0 |
| 4.85972 | 0 |
| 4.86111 | 0 |
| 4.8625 | 0 |
| 4.86389 | 0 |
| 4.86528 | 0 |
| 4.86667 | 0 |
| 4.86806 | 0 |
| 4.86944 | 0 |
| 4.87083 | 0 |
| 4.87222 | 0 |
| 4.87361 | 0 |
| 4.875 | 0 |
| 4.87639 | 0 |
| 4.87778 | 0 |
| 4.87917 | 0 |
| 4.88056 | 0 |
| 4.88194 | 0 |
| 4.88333 | 0 |
| 4.88472 | 0 |
| 4.88611 | 0 |
| 4.8875 | 0 |
| 4.88889 | 0 |
| 4.89028 | 0 |
| 4.89167 | 0 |
| 4.89306 | 0 |
| 4.89444 | 0 |
| 4.89583 | 0 |
| 4.89722 | 0 |
| 4.89861 | 0 |
| 4.9 | 0 |
| 4.90139 | 0 |
| 4.90278 | 0 |
| 4.90417 | 0 |
| 4.90556 | 0 |
| 4.90694 | 0 |
| 4.90833 | 0 |
| 4.90972 | 0 |
| 4.91111 | 0 |
| 4.9125 | 0 |
| 4.91389 | 0 |
| 4.91528 | 0 |
| 4.91667 | 0 |
| 4.91806 | 0 |
| 4.91944 | 0 |
| 4.92083 | 0 |
| 4.92222 | 0 |
| 4.92361 | 0 |
| 4.925 | 0 |
| 4.92639 | 0 |
| 4.92778 | 0 |
| 4.92917 | 0 |
| 4.93056 | 0 |
| 4.93194 | 0 |
| 4.93333 | 0 |
| 4.93472 | 0 |
| 4.93611 | 0 |
| 4.9375 | 0 |
| 4.93889 | 0 |
| 4.94028 | 0 |
| 4.94167 | 0 |
| 4.94306 | 0 |
| 4.94444 | 0 |
| 4.94583 | 0 |
| 4.94722 | 0 |
| 4.94861 | 0 |
| 4.95 | 0 |
| 4.95139 | 0 |
| 4.95278 | 0 |
| 4.95417 | 0 |
| 4.95556 | 0 |
| 4.95694 | 0 |
| 4.95833 | 0 |
| 4.95972 | 0 |
| 4.96111 | 0 |
| 4.9625 | 0 |
| 4.96389 | 0 |
| 4.96528 | 0 |
| 4.96667 | 0 |
| 4.96806 | 0 |
| 4.96944 | 0 |
| 4.97083 | 0 |
| 4.97222 | 0 |
| 4.97361 | 0 |
| 4.975 | 0 |
| 4.97639 | 0 |
| 4.97778 | 0 |
| 4.97917 | 0 |
| 4.98056 | 0 |
| 4.98194 | 0 |
| 4.98333 | 0 |
| 4.98472 | 0 |
| 4.98611 | 0 |
| 4.9875 | 0 |
| 4.98889 | 0 |
| 4.99028 | 0 |
| 4.99167 | 0 |
| 4.99306 | 0 |
| 4.99444 | 0 |
| 4.99583 | 0 |
| 4.99722 | 0 |
| 4.99861 | 0 |
| 5.0 | 0 |
| 5.00139 | 0 |
| 5.00278 | 0 |
| 5.00417 | 0 |
| 5.00556 | 0 |
| 5.00694 | 0 |
| 5.00833 | 0 |
| 5.00972 | 0 |
| 5.01111 | 0 |
| 5.0125 | 0 |
| 5.01389 | 0 |
| 5.01528 | 0 |
| 5.01667 | 0 |
| 5.01806 | 0 |
| 5.01944 | 0 |
| 5.02083 | 0 |
| 5.02222 | 0 |
| 5.02361 | 0 |
| 5.025 | 0 |
| 5.02639 | 0 |
| 5.02778 | 0 |
| 5.02917 | 0 |
| 5.03056 | 0 |
| 5.03194 | 0 |
| 5.03333 | 0 |
| 5.03472 | 0 |
| 5.03611 | 0 |
| 5.0375 | 0 |
| 5.03889 | 0 |
| 5.04028 | 0 |
| 5.04167 | 0 |
| 5.04306 | 0 |
| 5.04444 | 0 |
| 5.04583 | 0 |
| 5.04722 | 0 |
| 5.04861 | 0 |
| 5.05 | 0 |
| 5.05139 | 0 |
| 5.05278 | 0 |
| 5.05417 | 0 |
| 5.05556 | 0 |
| 5.05694 | 0 |
| 5.05833 | 0 |
| 5.05972 | 0 |
| 5.06111 | 0 |
| 5.0625 | 0 |
| 5.06389 | 0 |
| 5.06528 | 0 |
| 5.06667 | 0 |
| 5.06806 | 0 |
| 5.06944 | 0 |
| 5.07083 | 0 |
| 5.07222 | 0 |
| 5.07361 | 0 |
| 5.075 | 0 |
| 5.07639 | 0 |
| 5.07778 | 0 |
| 5.07917 | 0 |
| 5.08056 | 0 |
| 5.08194 | 0 |
| 5.08333 | 0 |
| 5.08472 | 0 |
| 5.08611 | 0 |
| 5.0875 | 0 |
| 5.08889 | 0 |
| 5.09028 | 0 |
| 5.09167 | 0 |
| 5.09306 | 0 |
| 5.09444 | 0 |
| 5.09583 | 0 |
| 5.09722 | 0 |
| 5.09861 | 0 |
| 5.1 | 0 |
| 5.10139 | 0 |
| 5.10278 | 0 |
| 5.10417 | 0 |
| 5.10556 | 0 |
| 5.10694 | 0 |
| 5.10833 | 0 |
| 5.10972 | 0 |
| 5.11111 | 0 |
| 5.1125 | 0 |
| 5.11389 | 0 |
| 5.11528 | 0 |
| 5.11667 | 0 |
| 5.11806 | 0 |
| 5.11944 | 0 |
| 5.12083 | 0 |
| 5.12222 | 0 |
| 5.12361 | 0 |
| 5.125 | 0 |
| 5.12639 | 0 |
| 5.12778 | 0 |
| 5.12917 | 0 |
| 5.13056 | 0 |
| 5.13194 | 0 |
| 5.13333 | 0 |
| 5.13472 | 0 |
| 5.13611 | 0 |
| 5.1375 | 0 |
| 5.13889 | 0 |
| 5.14028 | 0 |
| 5.14167 | 0 |
| 5.14306 | 0 |
| 5.14444 | 0 |
| 5.14583 | 0 |
| 5.14722 | 0 |
| 5.14861 | 0 |
| 5.15 | 0 |
| 5.15139 | 0 |
| 5.15278 | 0 |
| 5.15417 | 0 |
| 5.15556 | 0 |
| 5.15694 | 0 |
| 5.15833 | 0 |
| 5.15972 | 0 |
| 5.16111 | 0 |
| 5.1625 | 0 |
| 5.16389 | 0 |
| 5.16528 | 0 |
| 5.16667 | 0 |
| 5.16806 | 0 |
| 5.16944 | 0 |
| 5.17083 | 0 |
| 5.17222 | 0 |
| 5.17361 | 0 |
| 5.175 | 0 |
| 5.17639 | 0 |
| 5.17778 | 0 |
| 5.17917 | 0 |
| 5.18056 | 0 |
| 5.18194 | 0 |
| 5.18333 | 0 |
| 5.18472 | 0 |
| 5.18611 | 0 |
| 5.1875 | 0 |
| 5.18889 | 0 |
| 5.19028 | 0 |
| 5.19167 | 0 |
| 5.19306 | 0 |
| 5.19444 | 0 |
| 5.19583 | 0 |
| 5.19722 | 0 |
| 5.19861 | 0 |
| 5.2 | 0 |
| 5.20139 | 0 |
| 5.20278 | 0 |
| 5.20417 | 0 |
| 5.20556 | 0 |
| 5.20694 | 0 |
| 5.20833 | 0 |
| 5.20972 | 0 |
| 5.21111 | 0 |
| 5.2125 | 0 |
| 5.21389 | 0 |
| 5.21528 | 0 |
| 5.21667 | 0 |
| 5.21806 | 0 |
| 5.21944 | 0 |
| 5.22083 | 0 |
| 5.22222 | 0 |
| 5.22361 | 0 |
| 5.225 | 0 |
| 5.22639 | 0 |
| 5.22778 | 0 |
| 5.22917 | 0 |
| 5.23056 | 0 |
| 5.23194 | 0 |
| 5.23333 | 0 |
| 5.23472 | 0 |
| 5.23611 | 0 |
| 5.2375 | 0 |
| 5.23889 | 0 |
| 5.24028 | 0 |
| 5.24167 | 0 |
| 5.24306 | 0 |
| 5.24444 | 0 |
| 5.24583 | 0 |
| 5.24722 | 0 |
| 5.24861 | 0 |
| 5.25 | 0 |
| 5.25139 | 0 |
| 5.25278 | 0 |
| 5.25417 | 0 |
| 5.25556 | 0 |
| 5.25694 | 0 |
| 5.25833 | 0 |
| 5.25972 | 0 |
| 5.26111 | 0 |
| 5.2625 | 0 |
| 5.26389 | 0 |
| 5.26528 | 0 |
| 5.26667 | 0 |
| 5.26806 | 0 |
| 5.26944 | 0 |
| 5.27083 | 0 |
| 5.27222 | 0 |
| 5.27361 | 0 |
| 5.275 | 0 |
| 5.27639 | 0 |
| 5.27778 | 0 |
| 5.27917 | 0 |
| 5.28056 | 0 |
| 5.28194 | 0 |
| 5.28333 | 0 |
| 5.28472 | 0 |
| 5.28611 | 0 |
| 5.2875 | 0 |
| 5.28889 | 0 |
| 5.29028 | 0 |
| 5.29167 | 0 |
| 5.29306 | 0 |
| 5.29444 | 0 |
| 5.29583 | 0 |
| 5.29722 | 0 |
| 5.29861 | 0 |
| 5.3 | 0 |
| 5.30139 | 0 |
| 5.30278 | 0 |
| 5.30417 | 0 |
| 5.30556 | 0 |
| 5.30694 | 0 |
| 5.30833 | 0 |
| 5.30972 | 0 |
| 5.31111 | 0 |
| 5.3125 | 0 |
| 5.31389 | 0 |
| 5.31528 | 0 |
| 5.31667 | 0 |
| 5.31806 | 0 |
| 5.31944 | 0 |
| 5.32083 | 0 |
| 5.32222 | 0 |
| 5.32361 | 0 |
| 5.325 | 0 |
| 5.32639 | 0 |
| 5.32778 | 0 |
| 5.32917 | 0 |
| 5.33056 | 0 |
| 5.33194 | 0 |
| 5.33333 | 0 |
| 5.33472 | 0 |
| 5.33611 | 0 |
| 5.3375 | 0 |
| 5.33889 | 0 |
| 5.34028 | 0 |
| 5.34167 | 0 |
| 5.34306 | 0 |
| 5.34444 | 0 |
| 5.34583 | 0 |
| 5.34722 | 0 |
| 5.34861 | 0 |
| 5.35 | 0 |
| 5.35139 | 0 |
| 5.35278 | 0 |
| 5.35417 | 0 |
| 5.35556 | 0 |
| 5.35694 | 0 |
| 5.35833 | 0 |
| 5.35972 | 0 |
| 5.36111 | 0 |
| 5.3625 | 0 |
| 5.36389 | 0 |
| 5.36528 | 0 |
| 5.36667 | 0 |
| 5.36806 | 0 |
| 5.36944 | 0 |
| 5.37083 | 0 |
| 5.37222 | 0 |
| 5.37361 | 0 |
| 5.375 | 0 |
| 5.37639 | 0 |
| 5.37778 | 0 |
| 5.37917 | 0 |
| 5.38056 | 0 |
| 5.38194 | 0 |
| 5.38333 | 0 |
| 5.38472 | 0 |
| 5.38611 | 0 |
| 5.3875 | 0 |
| 5.38889 | 0 |
| 5.39028 | 0 |
| 5.39167 | 0 |
| 5.39306 | 0 |
| 5.39444 | 0 |
| 5.39583 | 0 |
| 5.39722 | 0 |
| 5.39861 | 0 |
| 5.4 | 0 |
| 5.40139 | 0 |
| 5.40278 | 0 |
| 5.40417 | 0 |
| 5.40556 | 0 |
| 5.40694 | 0 |
| 5.40833 | 0 |
| 5.40972 | 0 |
| 5.41111 | 0 |
| 5.4125 | 0 |
| 5.41389 | 0 |
| 5.41528 | 0 |
| 5.41667 | 0 |
| 5.41806 | 0 |
| 5.41944 | 0 |
| 5.42083 | 0 |
| 5.42222 | 0 |
| 5.42361 | 0 |
| 5.425 | 0 |
| 5.42639 | 0 |
| 5.42778 | 0 |
| 5.42917 | 0 |
| 5.43056 | 0 |
| 5.43194 | 0 |
| 5.43333 | 0 |
| 5.43472 | 0 |
| 5.43611 | 0 |
| 5.4375 | 0 |
| 5.43889 | 0 |
| 5.44028 | 0 |
| 5.44167 | 0 |
| 5.44306 | 0 |
| 5.44444 | 0 |
| 5.44583 | 0 |
| 5.44722 | 0 |
| 5.44861 | 0 |
| 5.45 | 0 |
| 5.45139 | 0 |
| 5.45278 | 0 |
| 5.45417 | 0 |
| 5.45556 | 0 |
| 5.45694 | 0 |
| 5.45833 | 0 |
| 5.45972 | 0 |
| 5.46111 | 0 |
| 5.4625 | 0 |
| 5.46389 | 0 |
| 5.46528 | 0 |
| 5.46667 | 0 |
| 5.46806 | 0 |
| 5.46944 | 0 |
| 5.47083 | 0 |
| 5.47222 | 0 |
| 5.47361 | 0 |
| 5.475 | 0 |
| 5.47639 | 0 |
| 5.47778 | 0 |
| 5.47917 | 0 |
| 5.48056 | 0 |
| 5.48194 | 0 |
| 5.48333 | 0 |
| 5.48472 | 0 |
| 5.48611 | 0 |
| 5.4875 | 0 |
| 5.48889 | 0 |
| 5.49028 | 0 |
| 5.49167 | 0 |
| 5.49306 | 0 |
| 5.49444 | 0 |
| 5.49583 | 0 |
| 5.49722 | 0 |
| 5.49861 | 0 |
| 5.5 | 0 |
| 5.50139 | 0 |
| 5.50278 | 0 |
| 5.50417 | 0 |
| 5.50556 | 0 |
| 5.50694 | 0 |
| 5.50833 | 0 |
| 5.50972 | 0 |
| 5.51111 | 0 |
| 5.5125 | 0 |
| 5.51389 | 0 |
| 5.51528 | 0 |
| 5.51667 | 0 |
| 5.51806 | 0 |
| 5.51944 | 0 |
| 5.52083 | 0 |
| 5.52222 | 0 |
| 5.52361 | 0 |
| 5.525 | 0 |
| 5.52639 | 0 |
| 5.52778 | 0 |
| 5.52917 | 0 |
| 5.53056 | 0 |
| 5.53194 | 0 |
| 5.53333 | 0 |
| 5.53472 | 0 |
| 5.53611 | 0 |
| 5.5375 | 0 |
| 5.53889 | 0 |
| 5.54028 | 0 |
| 5.54167 | 0 |
| 5.54306 | 0 |
| 5.54444 | 0 |
| 5.54583 | 0 |
| 5.54722 | 0 |
| 5.54861 | 0 |
| 5.55 | 0 |
| 5.55139 | 0 |
| 5.55278 | 0 |
| 5.55417 | 0 |
| 5.55556 | 0 |
| 5.55694 | 0 |
| 5.55833 | 0 |
| 5.55972 | 0 |
| 5.56111 | 0 |
| 5.5625 | 0 |
| 5.56389 | 0 |
| 5.56528 | 0 |
| 5.56667 | 0 |
| 5.56806 | 0 |
| 5.56944 | 0 |
| 5.57083 | 0 |
| 5.57222 | 0 |
| 5.57361 | 0 |
| 5.575 | 0 |
| 5.57639 | 0 |
| 5.57778 | 0 |
| 5.57917 | 0 |
| 5.58056 | 0 |
| 5.58194 | 0 |
| 5.58333 | 0 |
| 5.58472 | 0 |
| 5.58611 | 0 |
| 5.5875 | 0 |
| 5.58889 | 0 |
| 5.59028 | 0 |
| 5.59167 | 0 |
| 5.59306 | 0 |
| 5.59444 | 0 |
| 5.59583 | 0 |
| 5.59722 | 0 |
| 5.59861 | 0 |
| 5.6 | 0 |
| 5.60139 | 0 |
| 5.60278 | 0 |
| 5.60417 | 0 |
| 5.60556 | 0 |
| 5.60694 | 0 |
| 5.60833 | 0 |
| 5.60972 | 0 |
| 5.61111 | 0 |
| 5.6125 | 0 |
| 5.61389 | 0 |
| 5.61528 | 0 |
| 5.61667 | 0 |
| 5.61806 | 0 |
| 5.61944 | 0 |
| 5.62083 | 0 |
| 5.62222 | 0 |
| 5.62361 | 0 |
| 5.625 | 0 |
| 5.62639 | 0 |
| 5.62778 | 0 |
| 5.62917 | 0 |
| 5.63056 | 0 |
| 5.63194 | 0 |
| 5.63333 | 0 |
| 5.63472 | 0 |
| 5.63611 | 0 |
| 5.6375 | 0 |
| 5.63889 | 0 |
| 5.64028 | 0 |
| 5.64167 | 0 |
| 5.64306 | 0 |
| 5.64444 | 0 |
| 5.64583 | 0 |
| 5.64722 | 0 |
| 5.64861 | 0 |
| 5.65 | 0 |
| 5.65139 | 0 |
| 5.65278 | 0 |
| 5.65417 | 0 |
| 5.65556 | 0 |
| 5.65694 | 0 |
| 5.65833 | 0 |
| 5.65972 | 0 |
| 5.66111 | 0 |
| 5.6625 | 0 |
| 5.66389 | 0 |
| 5.66528 | 0 |
| 5.66667 | 0 |
| 5.66806 | 0 |
| 5.66944 | 0 |
| 5.67083 | 0 |
| 5.67222 | 0 |
| 5.67361 | 0 |
| 5.675 | 0 |
| 5.67639 | 0 |
| 5.67778 | 0 |
| 5.67917 | 0 |
| 5.68056 | 0 |
| 5.68194 | 0 |
| 5.68333 | 0 |
| 5.68472 | 0 |
| 5.68611 | 0 |
| 5.6875 | 0 |
| 5.68889 | 0 |
| 5.69028 | 0 |
| 5.69167 | 0 |
| 5.69306 | 0 |
| 5.69444 | 0 |
| 5.69583 | 0 |
| 5.69722 | 0 |
| 5.69861 | 0 |
| 5.7 | 0 |
| 5.70139 | 0 |
| 5.70278 | 0 |
| 5.70417 | 0 |
| 5.70556 | 0 |
| 5.70694 | 0 |
| 5.70833 | 0 |
| 5.70972 | 0 |
| 5.71111 | 0 |
| 5.7125 | 0 |
| 5.71389 | 0 |
| 5.71528 | 0 |
| 5.71667 | 0 |
| 5.71806 | 0 |
| 5.71944 | 0 |
| 5.72083 | 0 |
| 5.72222 | 0 |
| 5.72361 | 0 |
| 5.725 | 0 |
| 5.72639 | 0 |
| 5.72778 | 0 |
| 5.72917 | 0 |
| 5.73056 | 0 |
| 5.73194 | 0 |
| 5.73333 | 0 |
| 5.73472 | 0 |
| 5.73611 | 0 |
| 5.7375 | 0 |
| 5.73889 | 0 |
| 5.74028 | 0 |
| 5.74167 | 0 |
| 5.74306 | 0 |
| 5.74444 | 0 |
| 5.74583 | 0 |
| 5.74722 | 0 |
| 5.74861 | 0 |
| 5.75 | 0 |
| 5.75139 | 0 |
| 5.75278 | 0 |
| 5.75417 | 0 |
| 5.75556 | 0 |
| 5.75694 | 0 |
| 5.75833 | 0 |
| 5.75972 | 0 |
| 5.76111 | 0 |
| 5.7625 | 0 |
| 5.76389 | 0 |
| 5.76528 | 0 |
| 5.76667 | 0 |
| 5.76806 | 0 |
| 5.76944 | 0 |
| 5.77083 | 0 |
| 5.77222 | 0 |
| 5.77361 | 0 |
| 5.775 | 0 |
| 5.77639 | 0 |
| 5.77778 | 0 |
| 5.77917 | 0 |
| 5.78056 | 0 |
| 5.78194 | 0 |
| 5.78333 | 0 |
| 5.78472 | 0 |
| 5.78611 | 0 |
| 5.7875 | 0 |
| 5.78889 | 0 |
| 5.79028 | 0 |
| 5.79167 | 0 |
| 5.79306 | 0 |
| 5.79444 | 0 |
| 5.79583 | 0 |
| 5.79722 | 0 |
| 5.79861 | 0 |
| 5.8 | 0 |
| 5.80139 | 0 |
| 5.80278 | 0 |
| 5.80417 | 0 |
| 5.80556 | 0 |
| 5.80694 | 0 |
| 5.80833 | 0 |
| 5.80972 | 0 |
| 5.81111 | 0 |
| 5.8125 | 0 |
| 5.81389 | 0 |
| 5.81528 | 0 |
| 5.81667 | 0 |
| 5.81806 | 0 |
| 5.81944 | 0 |
| 5.82083 | 0 |
| 5.82222 | 0 |
| 5.82361 | 0 |
| 5.825 | 0 |
| 5.82639 | 0 |
| 5.82778 | 0 |
| 5.82917 | 0 |
| 5.83056 | 0 |
| 5.83194 | 0 |
| 5.83333 | 0 |
| 5.83472 | 0 |
| 5.83611 | 0 |
| 5.8375 | 0 |
| 5.83889 | 0 |
| 5.84028 | 0 |
| 5.84167 | 0 |
| 5.84306 | 0 |
| 5.84444 | 0 |
| 5.84583 | 0 |
| 5.84722 | 0 |
| 5.84861 | 0 |
| 5.85 | 0 |
| 5.85139 | 0 |
| 5.85278 | 0 |
| 5.85417 | 0 |
| 5.85556 | 0 |
| 5.85694 | 0 |
| 5.85833 | 0 |
| 5.85972 | 0 |
| 5.86111 | 0 |
| 5.8625 | 0 |
| 5.86389 | 0 |
| 5.86528 | 0 |
| 5.86667 | 0 |
| 5.86806 | 0 |
| 5.86944 | 0 |
| 5.87083 | 0 |
| 5.87222 | 0 |
| 5.87361 | 0 |
| 5.875 | 0 |
| 5.87639 | 0 |
| 5.87778 | 0 |
| 5.87917 | 0 |
| 5.88056 | 0 |
| 5.88194 | 0 |
| 5.88333 | 0 |
| 5.88472 | 0 |
| 5.88611 | 0 |
| 5.8875 | 0 |
| 5.88889 | 0 |
| 5.89028 | 0 |
| 5.89167 | 0 |
| 5.89306 | 0 |
| 5.89444 | 0 |
| 5.89583 | 0 |
| 5.89722 | 0 |
| 5.89861 | 0 |
| 5.9 | 0 |
| 5.90139 | 0 |
| 5.90278 | 0 |
| 5.90417 | 0 |
| 5.90556 | 0 |
| 5.90694 | 0 |
| 5.90833 | 0 |
| 5.90972 | 0 |
| 5.91111 | 0 |
| 5.9125 | 0 |
| 5.91389 | 0 |
| 5.91528 | 0 |
| 5.91667 | 0 |
| 5.91806 | 0 |
| 5.91944 | 0 |
| 5.92083 | 0 |
| 5.92222 | 0 |
| 5.92361 | 0 |
| 5.925 | 0 |
| 5.92639 | 0 |
| 5.92778 | 0 |
| 5.92917 | 0 |
| 5.93056 | 0 |
| 5.93194 | 0 |
| 5.93333 | 0 |
| 5.93472 | 0 |
| 5.93611 | 0 |
| 5.9375 | 0 |
| 5.93889 | 0 |
| 5.94028 | 0 |
| 5.94167 | 0 |
| 5.94306 | 0 |
| 5.94444 | 0 |
| 5.94583 | 0 |
| 5.94722 | 0 |
| 5.94861 | 0 |
| 5.95 | 0 |
| 5.95139 | 0 |
| 5.95278 | 0 |
| 5.95417 | 0 |
| 5.95556 | 0 |
| 5.95694 | 0 |
| 5.95833 | 0 |
| 5.95972 | 0 |
| 5.96111 | 0 |
| 5.9625 | 0 |
| 5.96389 | 0 |
| 5.96528 | 0 |
| 5.96667 | 0 |
| 5.96806 | 0 |
| 5.96944 | 0 |
| 5.97083 | 0 |
| 5.97222 | 0 |
| 5.97361 | 0 |
| 5.975 | 0 |
| 5.97639 | 0 |
| 5.97778 | 0 |
| 5.97917 | 0 |
| 5.98056 | 0 |
| 5.98194 | 0 |
| 5.98333 | 0 |
| 5.98472 | 0 |
| 5.98611 | 0 |
| 5.9875 | 0 |
| 5.98889 | 0 |
| 5.99028 | 0 |
| 5.99167 | 0 |
| 5.99306 | 0 |
| 5.99444 | 0 |
| 5.99583 | 0 |
| 5.99722 | 0 |
| 5.99861 | 0 |
| 6.0 | 0 |
| 6.00139 | 0 |
| 6.00278 | 0 |
| 6.00417 | 0 |
| 6.00556 | 0 |
| 6.00694 | 0 |
| 6.00833 | 0 |
| 6.00972 | 0 |
| 6.01111 | 0 |
| 6.0125 | 0 |
| 6.01389 | 0 |
| 6.01528 | 0 |
| 6.01667 | 0 |
| 6.01806 | 0 |
| 6.01944 | 0 |
| 6.02083 | 0 |
| 6.02222 | 0 |
| 6.02361 | 0 |
| 6.025 | 0 |
| 6.02639 | 0 |
| 6.02778 | 0 |
| 6.02917 | 0 |
| 6.03056 | 0 |
| 6.03194 | 0 |
| 6.03333 | 0 |
| 6.03472 | 0 |
| 6.03611 | 0 |
| 6.0375 | 0 |
| 6.03889 | 0 |
| 6.04028 | 0 |
| 6.04167 | 0 |
| 6.04306 | 0 |
| 6.04444 | 0 |
| 6.04583 | 0 |
| 6.04722 | 0 |
| 6.04861 | 0 |
| 6.05 | 0 |
| 6.05139 | 0 |
| 6.05278 | 0 |
| 6.05417 | 0 |
| 6.05556 | 0 |
| 6.05694 | 0 |
| 6.05833 | 0 |
| 6.05972 | 0 |
| 6.06111 | 0 |
| 6.0625 | 0 |
| 6.06389 | 0 |
| 6.06528 | 0 |
| 6.06667 | 0 |
| 6.06806 | 0 |
| 6.06944 | 0 |
| 6.07083 | 0 |
| 6.07222 | 0 |
| 6.07361 | 0 |
| 6.075 | 0 |
| 6.07639 | 0 |
| 6.07778 | 0 |
| 6.07917 | 0 |
| 6.08056 | 0 |
| 6.08194 | 0 |
| 6.08333 | 0 |
| 6.08472 | 0 |
| 6.08611 | 0 |
| 6.0875 | 0 |
| 6.08889 | 0 |
| 6.09028 | 0 |
| 6.09167 | 0 |
| 6.09306 | 0 |
| 6.09444 | 0 |
| 6.09583 | 0 |
| 6.09722 | 0 |
| 6.09861 | 0 |
| 6.1 | 0 |
| 6.10139 | 0 |
| 6.10278 | 0 |
| 6.10417 | 0 |
| 6.10556 | 0 |
| 6.10694 | 0 |
| 6.10833 | 0 |
| 6.10972 | 0 |
| 6.11111 | 0 |
| 6.1125 | 0 |
| 6.11389 | 0 |
| 6.11528 | 0 |
| 6.11667 | 0 |
| 6.11806 | 0 |
| 6.11944 | 0 |
| 6.12083 | 0 |
| 6.12222 | 0 |
| 6.12361 | 0 |
| 6.125 | 0 |
| 6.12639 | 0 |
| 6.12778 | 0 |
| 6.12917 | 0 |
| 6.13056 | 0 |
| 6.13194 | 0 |
| 6.13333 | 0 |
| 6.13472 | 0 |
| 6.13611 | 0 |
| 6.1375 | 0 |
| 6.13889 | 0 |
| 6.14028 | 0 |
| 6.14167 | 0 |
| 6.14306 | 0 |
| 6.14444 | 0 |
| 6.14583 | 0 |
| 6.14722 | 0 |
| 6.14861 | 0 |
| 6.15 | 0 |
| 6.15139 | 0 |
| 6.15278 | 0 |
| 6.15417 | 0 |
| 6.15556 | 0 |
| 6.15694 | 0 |
| 6.15833 | 0 |
| 6.15972 | 0 |
| 6.16111 | 0 |
| 6.1625 | 0 |
| 6.16389 | 0 |
| 6.16528 | 0 |
| 6.16667 | 0 |
| 6.16806 | 0 |
| 6.16944 | 0 |
| 6.17083 | 0 |
| 6.17222 | 0 |
| 6.17361 | 0 |
| 6.175 | 0 |
| 6.17639 | 0 |
| 6.17778 | 0 |
| 6.17917 | 0 |
| 6.18056 | 0 |
| 6.18194 | 0 |
| 6.18333 | 0 |
| 6.18472 | 0 |
| 6.18611 | 0 |
| 6.1875 | 0 |
| 6.18889 | 0 |
| 6.19028 | 0 |
| 6.19167 | 0 |
| 6.19306 | 0 |
| 6.19444 | 0 |
| 6.19583 | 0 |
| 6.19722 | 0 |
| 6.19861 | 0 |
| 6.2 | 0 |
| 6.20139 | 0 |
| 6.20278 | 0 |
| 6.20417 | 0 |
| 6.20556 | 0 |
| 6.20694 | 0 |
| 6.20833 | 0 |
| 6.20972 | 0 |
| 6.21111 | 0 |
| 6.2125 | 0 |
| 6.21389 | 0 |
| 6.21528 | 0 |
| 6.21667 | 0 |
| 6.21806 | 0 |
| 6.21944 | 0 |
| 6.22083 | 0 |
| 6.22222 | 0 |
| 6.22361 | 0 |
| 6.225 | 0 |
| 6.22639 | 0 |
| 6.22778 | 0 |
| 6.22917 | 0 |
| 6.23056 | 0 |
| 6.23194 | 0 |
| 6.23333 | 0 |
| 6.23472 | 0 |
| 6.23611 | 0 |
| 6.2375 | 0 |
| 6.23889 | 0 |
| 6.24028 | 0 |
| 6.24167 | 0 |
| 6.24306 | 0 |
| 6.24444 | 0 |
| 6.24583 | 0 |
| 6.24722 | 0 |
| 6.24861 | 0 |
| 6.25 | 0 |
| 6.25139 | 0 |
| 6.25278 | 0 |
| 6.25417 | 0 |
| 6.25556 | 0 |
| 6.25694 | 0 |
| 6.25833 | 0 |
| 6.25972 | 0 |
| 6.26111 | 0 |
| 6.2625 | 0 |
| 6.26389 | 0 |
| 6.26528 | 0 |
| 6.26667 | 0 |
| 6.26806 | 0 |
| 6.26944 | 0 |
| 6.27083 | 0 |
| 6.27222 | 0 |
| 6.27361 | 0 |
| 6.275 | 0 |
| 6.27639 | 0 |
| 6.27778 | 0 |
| 6.27917 | 0 |
| 6.28056 | 0 |
| 6.28194 | 0 |
| 6.28333 | 0 |
| 6.28472 | 0 |
| 6.28611 | 0 |
| 6.2875 | 0 |
| 6.28889 | 0 |
| 6.29028 | 0 |
| 6.29167 | 0 |
| 6.29306 | 0 |
| 6.29444 | 0 |
| 6.29583 | 0 |
| 6.29722 | 0 |
| 6.29861 | 0 |
| 6.3 | 0 |
| 6.30139 | 0 |
| 6.30278 | 0 |
| 6.30417 | 0 |
| 6.30556 | 0 |
| 6.30694 | 0 |
| 6.30833 | 0 |
| 6.30972 | 0 |
| 6.31111 | 0 |
| 6.3125 | 0 |
| 6.31389 | 0 |
| 6.31528 | 0 |
| 6.31667 | 0 |
| 6.31806 | 0 |
| 6.31944 | 0 |
| 6.32083 | 0 |
| 6.32222 | 0 |
| 6.32361 | 0 |
| 6.325 | 0 |
| 6.32639 | 0 |
| 6.32778 | 0 |
| 6.32917 | 0 |
| 6.33056 | 0 |
| 6.33194 | 0 |
| 6.33333 | 0 |
| 6.33472 | 0 |
| 6.33611 | 0 |
| 6.3375 | 0 |
| 6.33889 | 0 |
| 6.34028 | 0 |
| 6.34167 | 0 |
| 6.34306 | 0 |
| 6.34444 | 0 |
| 6.34583 | 0 |
| 6.34722 | 0 |
| 6.34861 | 0 |
| 6.35 | 0 |
| 6.35139 | 0 |
| 6.35278 | 0 |
| 6.35417 | 0 |
| 6.35556 | 0 |
| 6.35694 | 0 |
| 6.35833 | 0 |
| 6.35972 | 0 |
| 6.36111 | 0 |
| 6.3625 | 0 |
| 6.36389 | 0 |
| 6.36528 | 0 |
| 6.36667 | 0 |
| 6.36806 | 0 |
| 6.36944 | 0 |
| 6.37083 | 0 |
| 6.37222 | 0 |
| 6.37361 | 0 |
| 6.375 | 0 |
| 6.37639 | 0 |
| 6.37778 | 0 |
| 6.37917 | 0 |
| 6.38056 | 0 |
| 6.38194 | 0 |
| 6.38333 | 0 |
| 6.38472 | 0 |
| 6.38611 | 0 |
| 6.3875 | 0 |
| 6.38889 | 0 |
| 6.39028 | 0 |
| 6.39167 | 0 |
| 6.39306 | 0 |
| 6.39444 | 0 |
| 6.39583 | 0 |
| 6.39722 | 0 |
| 6.39861 | 0 |
| 6.4 | 0 |
| 6.40139 | 0 |
| 6.40278 | 0 |
| 6.40417 | 0 |
| 6.40556 | 0 |
| 6.40694 | 0 |
| 6.40833 | 0 |
| 6.40972 | 0 |
| 6.41111 | 0 |
| 6.4125 | 0 |
| 6.41389 | 0 |
| 6.41528 | 0 |
| 6.41667 | 0 |
| 6.41806 | 0 |
| 6.41944 | 0 |
| 6.42083 | 0 |
| 6.42222 | 0 |
| 6.42361 | 0 |
| 6.425 | 0 |
| 6.42639 | 0 |
| 6.42778 | 0 |
| 6.42917 | 0 |
| 6.43056 | 0 |
| 6.43194 | 0 |
| 6.43333 | 0 |
| 6.43472 | 0 |
| 6.43611 | 0 |
| 6.4375 | 0 |
| 6.43889 | 0 |
| 6.44028 | 0 |
| 6.44167 | 0 |
| 6.44306 | 0 |
| 6.44444 | 0 |
| 6.44583 | 0 |
| 6.44722 | 0 |
| 6.44861 | 0 |
| 6.45 | 0 |
| 6.45139 | 0 |
| 6.45278 | 0 |
| 6.45417 | 0 |
| 6.45556 | 0 |
| 6.45694 | 0 |
| 6.45833 | 0 |
| 6.45972 | 0 |
| 6.46111 | 0 |
| 6.4625 | 0 |
| 6.46389 | 0 |
| 6.46528 | 0 |
| 6.46667 | 0 |
| 6.46806 | 0 |
| 6.46944 | 0 |
| 6.47083 | 0 |
| 6.47222 | 0 |
| 6.47361 | 0 |
| 6.475 | 0 |
| 6.47639 | 0 |
| 6.47778 | 0 |
| 6.47917 | 0 |
| 6.48056 | 0 |
| 6.48194 | 0 |
| 6.48333 | 0 |
| 6.48472 | 0 |
| 6.48611 | 0 |
| 6.4875 | 0 |
| 6.48889 | 0 |
| 6.49028 | 0 |
| 6.49167 | 0 |
| 6.49306 | 0 |
| 6.49444 | 0 |
| 6.49583 | 0 |
| 6.49722 | 0 |
| 6.49861 | 0 |
| 6.5 | 0 |
| 6.50139 | 0 |
| 6.50278 | 0 |
| 6.50417 | 0 |
| 6.50556 | 0 |
| 6.50694 | 0 |
| 6.50833 | 0 |
| 6.50972 | 0 |
| 6.51111 | 0 |
| 6.5125 | 0 |
| 6.51389 | 0 |
| 6.51528 | 0 |
| 6.51667 | 0 |
| 6.51806 | 0 |
| 6.51944 | 0 |
| 6.52083 | 0 |
| 6.52222 | 0 |
| 6.52361 | 0 |
| 6.525 | 0 |
| 6.52639 | 0 |
| 6.52778 | 0 |
| 6.52917 | 0 |
| 6.53056 | 0 |
| 6.53194 | 0 |
| 6.53333 | 0 |
| 6.53472 | 0 |
| 6.53611 | 0 |
| 6.5375 | 0 |
| 6.53889 | 0 |
| 6.54028 | 0 |
| 6.54167 | 0 |
| 6.54306 | 0 |
| 6.54444 | 0 |
| 6.54583 | 0 |
| 6.54722 | 0 |
| 6.54861 | 0 |
| 6.55 | 0 |
| 6.55139 | 0 |
| 6.55278 | 0 |
| 6.55417 | 0 |
| 6.55556 | 0 |
| 6.55694 | 0 |
| 6.55833 | 0 |
| 6.55972 | 0 |
| 6.56111 | 0 |
| 6.5625 | 0 |
| 6.56389 | 0 |
| 6.56528 | 0 |
| 6.56667 | 0 |
| 6.56806 | 0 |
| 6.56944 | 0 |
| 6.57083 | 0 |
| 6.57222 | 0 |
| 6.57361 | 0 |
| 6.575 | 0 |
| 6.57639 | 0 |
| 6.57778 | 0 |
| 6.57917 | 0 |
| 6.58056 | 0 |
| 6.58194 | 0 |
| 6.58333 | 0 |
| 6.58472 | 0 |
| 6.58611 | 0 |
| 6.5875 | 0 |
| 6.58889 | 0 |
| 6.59028 | 0 |
| 6.59167 | 0 |
| 6.59306 | 0 |
| 6.59444 | 0 |
| 6.59583 | 0 |
| 6.59722 | 0 |
| 6.59861 | 0 |
| 6.6 | 0 |
| 6.60139 | 0 |
| 6.60278 | 0 |
| 6.60417 | 0 |
| 6.60556 | 0 |
| 6.60694 | 0 |
| 6.60833 | 0 |
| 6.60972 | 0 |
| 6.61111 | 0 |
| 6.6125 | 0 |
| 6.61389 | 0 |
| 6.61528 | 0 |
| 6.61667 | 0 |
| 6.61806 | 0 |
| 6.61944 | 0 |
| 6.62083 | 0 |
| 6.62222 | 0 |
| 6.62361 | 0 |
| 6.625 | 0 |
| 6.62639 | 0 |
| 6.62778 | 0 |
| 6.62917 | 0 |
| 6.63056 | 0 |
| 6.63194 | 0 |
| 6.63333 | 0 |
| 6.63472 | 0 |
| 6.63611 | 0 |
| 6.6375 | 0 |
| 6.63889 | 0 |
| 6.64028 | 0 |
| 6.64167 | 0 |
| 6.64306 | 0 |
| 6.64444 | 0 |
| 6.64583 | 0 |
| 6.64722 | 0 |
| 6.64861 | 0 |
| 6.65 | 0 |
| 6.65139 | 0 |
| 6.65278 | 0 |
| 6.65417 | 0 |
| 6.65556 | 0 |
| 6.65694 | 0 |
| 6.65833 | 0 |
| 6.65972 | 0 |
| 6.66111 | 0 |
| 6.6625 | 0 |
| 6.66389 | 0 |
| 6.66528 | 0 |
| 6.66667 | 0 |
| 6.66806 | 0 |
| 6.66944 | 0 |
| 6.67083 | 0 |
| 6.67222 | 0 |
| 6.67361 | 0 |
| 6.675 | 0 |
| 6.67639 | 0 |
| 6.67778 | 0 |
| 6.67917 | 0 |
| 6.68056 | 0 |
| 6.68194 | 0 |
| 6.68333 | 0 |
| 6.68472 | 0 |
| 6.68611 | 0 |
| 6.6875 | 0 |
| 6.68889 | 0 |
| 6.69028 | 0 |
| 6.69167 | 0 |
| 6.69306 | 0 |
| 6.69444 | 0 |
| 6.69583 | 0 |
| 6.69722 | 0 |
| 6.69861 | 0 |
| 6.7 | 0 |
| 6.70139 | 0 |
| 6.70278 | 0 |
| 6.70417 | 0 |
| 6.70556 | 0 |
| 6.70694 | 0 |
| 6.70833 | 0 |
| 6.70972 | 0 |
| 6.71111 | 0 |
| 6.7125 | 0 |
| 6.71389 | 0 |
| 6.71528 | 0 |
| 6.71667 | 0 |
| 6.71806 | 0 |
| 6.71944 | 0 |
| 6.72083 | 0 |
| 6.72222 | 0 |
| 6.72361 | 0 |
| 6.725 | 0 |
| 6.72639 | 0 |
| 6.72778 | 0 |
| 6.72917 | 0 |
| 6.73056 | 0 |
| 6.73194 | 0 |
| 6.73333 | 0 |
| 6.73472 | 0 |
| 6.73611 | 0 |
| 6.7375 | 0 |
| 6.73889 | 0 |
| 6.74028 | 0 |
| 6.74167 | 0 |
| 6.74306 | 0 |
| 6.74444 | 0 |
| 6.74583 | 0 |
| 6.74722 | 0 |
| 6.74861 | 0 |
| 6.75 | 0 |
| 6.75139 | 0 |
| 6.75278 | 0 |
| 6.75417 | 0 |
| 6.75556 | 0 |
| 6.75694 | 0 |
| 6.75833 | 0 |
| 6.75972 | 0 |
| 6.76111 | 0 |
| 6.7625 | 0 |
| 6.76389 | 0 |
| 6.76528 | 0 |
| 6.76667 | 0 |
| 6.76806 | 0 |
| 6.76944 | 0 |
| 6.77083 | 0 |
| 6.77222 | 0 |
| 6.77361 | 0 |
| 6.775 | 0 |
| 6.77639 | 0 |
| 6.77778 | 0 |
| 6.77917 | 0 |
| 6.78056 | 0 |
| 6.78194 | 0 |
| 6.78333 | 0 |
| 6.78472 | 0 |
| 6.78611 | 0 |
| 6.7875 | 0 |
| 6.78889 | 0 |
| 6.79028 | 0 |
| 6.79167 | 0 |
| 6.79306 | 0 |
| 6.79444 | 0 |
| 6.79583 | 0 |
| 6.79722 | 0 |
| 6.79861 | 0 |
| 6.8 | 0 |
| 6.80139 | 0 |
| 6.80278 | 0 |
| 6.80417 | 0 |
| 6.80556 | 0 |
| 6.80694 | 0 |
| 6.80833 | 0 |
| 6.80972 | 0 |
| 6.81111 | 0 |
| 6.8125 | 0 |
| 6.81389 | 0 |
| 6.81528 | 0 |
| 6.81667 | 0 |
| 6.81806 | 0 |
| 6.81944 | 0 |
| 6.82083 | 0 |
| 6.82222 | 0 |
| 6.82361 | 0 |
| 6.825 | 0 |
| 6.82639 | 0 |
| 6.82778 | 0 |
| 6.82917 | 0 |
| 6.83056 | 0 |
| 6.83194 | 0 |
| 6.83333 | 0 |
| 6.83472 | 0 |
| 6.83611 | 0 |
| 6.8375 | 0 |
| 6.83889 | 0 |
| 6.84028 | 0 |
| 6.84167 | 0 |
| 6.84306 | 0 |
| 6.84444 | 0 |
| 6.84583 | 0 |
| 6.84722 | 0 |
| 6.84861 | 0 |
| 6.85 | 0 |
| 6.85139 | 0 |
| 6.85278 | 0 |
| 6.85417 | 0 |
| 6.85556 | 0 |
| 6.85694 | 0 |
| 6.85833 | 0 |
| 6.85972 | 0 |
| 6.86111 | 0 |
| 6.8625 | 0 |
| 6.86389 | 0 |
| 6.86528 | 0 |
| 6.86667 | 0 |
| 6.86806 | 0 |
| 6.86944 | 0 |
| 6.87083 | 0 |
| 6.87222 | 0 |
| 6.87361 | 0 |
| 6.875 | 0 |
| 6.87639 | 0 |
| 6.87778 | 0 |
| 6.87917 | 0 |
| 6.88056 | 0 |
| 6.88194 | 0 |
| 6.88333 | 0 |
| 6.88472 | 0 |
| 6.88611 | 0 |
| 6.8875 | 0 |
| 6.88889 | 0 |
| 6.89028 | 0 |
| 6.89167 | 0 |
| 6.89306 | 0 |
| 6.89444 | 0 |
| 6.89583 | 0 |
| 6.89722 | 0 |
| 6.89861 | 0 |
| 6.9 | 0 |
| 6.90139 | 0 |
| 6.90278 | 0 |
| 6.90417 | 0 |
| 6.90556 | 0 |
| 6.90694 | 0 |
| 6.90833 | 0 |
| 6.90972 | 0 |
| 6.91111 | 0 |
| 6.9125 | 0 |
| 6.91389 | 0 |
| 6.91528 | 0 |
| 6.91667 | 0 |
| 6.91806 | 0 |
| 6.91944 | 0 |
| 6.92083 | 0 |
| 6.92222 | 0 |
| 6.92361 | 0 |
| 6.925 | 0 |
| 6.92639 | 0 |
| 6.92778 | 0 |
| 6.92917 | 0 |
| 6.93056 | 0 |
| 6.93194 | 0 |
| 6.93333 | 0 |
| 6.93472 | 0 |
| 6.93611 | 0 |
| 6.9375 | 0 |
| 6.93889 | 0 |
| 6.94028 | 0 |
| 6.94167 | 0 |
| 6.94306 | 0 |
| 6.94444 | 0 |
| 6.94583 | 0 |
| 6.94722 | 0 |
| 6.94861 | 0 |
| 6.95 | 0 |
| 6.95139 | 0 |
| 6.95278 | 0 |
| 6.95417 | 0 |
| 6.95556 | 0 |
| 6.95694 | 0 |
| 6.95833 | 0 |
| 6.95972 | 0 |
| 6.96111 | 0 |
| 6.9625 | 0 |
| 6.96389 | 0 |
| 6.96528 | 0 |
| 6.96667 | 0 |
| 6.96806 | 0 |
| 6.96944 | 0 |
| 6.97083 | 0 |
| 6.97222 | 0 |
| 6.97361 | 0 |
| 6.975 | 0 |
| 6.97639 | 0 |
| 6.97778 | 0 |
| 6.97917 | 0 |
| 6.98056 | 0 |
| 6.98194 | 0 |
| 6.98333 | 0 |
| 6.98472 | 0 |
| 6.98611 | 0 |
| 6.9875 | 0 |
| 6.98889 | 0 |
| 6.99028 | 0 |
| 6.99167 | 0 |
| 6.99306 | 0 |
| 6.99444 | 0 |
| 6.99583 | 0 |
| 6.99722 | 0 |
| 6.99861 | 0 |
| 7.0 | 0 |
| 7.00139 | 0 |
| 7.00278 | 0 |
| 7.00417 | 0 |
| 7.00556 | 0 |
| 7.00694 | 0 |
| 7.00833 | 0 |
| 7.00972 | 0 |
| 7.01111 | 0 |
| 7.0125 | 0 |
| 7.01389 | 0 |
| 7.01528 | 0 |
| 7.01667 | 0 |
| 7.01806 | 0 |
| 7.01944 | 0 |
| 7.02083 | 0 |
| 7.02222 | 0 |
| 7.02361 | 0 |
| 7.025 | 0 |
| 7.02639 | 0 |
| 7.02778 | 0 |
| 7.02917 | 0 |
| 7.03056 | 0 |
| 7.03194 | 0 |
| 7.03333 | 0 |
| 7.03472 | 0 |
| 7.03611 | 0 |
| 7.0375 | 0 |
| 7.03889 | 0 |
| 7.04028 | 0 |
| 7.04167 | 0 |
| 7.04306 | 0 |
| 7.04444 | 0 |
| 7.04583 | 0 |
| 7.04722 | 0 |
| 7.04861 | 0 |
| 7.05 | 0 |
| 7.05139 | 0 |
| 7.05278 | 0 |
| 7.05417 | 0 |
| 7.05556 | 0 |
| 7.05694 | 0 |
| 7.05833 | 0 |
| 7.05972 | 0 |
| 7.06111 | 0 |
| 7.0625 | 0 |
| 7.06389 | 0 |
| 7.06528 | 0 |
| 7.06667 | 0 |
| 7.06806 | 0 |
| 7.06944 | 0 |
| 7.07083 | 0 |
| 7.07222 | 0 |
| 7.07361 | 0 |
| 7.075 | 0 |
| 7.07639 | 0 |
| 7.07778 | 0 |
| 7.07917 | 0 |
| 7.08056 | 0 |
| 7.08194 | 0 |
| 7.08333 | 0 |
| 7.08472 | 0 |
| 7.08611 | 0 |
| 7.0875 | 0 |
| 7.08889 | 0 |
| 7.09028 | 0 |
| 7.09167 | 0 |
| 7.09306 | 0 |
| 7.09444 | 0 |
| 7.09583 | 0 |
| 7.09722 | 0 |
| 7.09861 | 0 |
| 7.1 | 0 |
| 7.10139 | 0 |
| 7.10278 | 0 |
| 7.10417 | 0 |
| 7.10556 | 0 |
| 7.10694 | 0 |
| 7.10833 | 0 |
| 7.10972 | 0 |
| 7.11111 | 0 |
| 7.1125 | 0 |
| 7.11389 | 0 |
| 7.11528 | 0 |
| 7.11667 | 0 |
| 7.11806 | 0 |
| 7.11944 | 0 |
| 7.12083 | 0 |
| 7.12222 | 0 |
| 7.12361 | 0 |
| 7.125 | 0 |
| 7.12639 | 0 |
| 7.12778 | 0 |
| 7.12917 | 0 |
| 7.13056 | 0 |
| 7.13194 | 0 |
| 7.13333 | 0 |
| 7.13472 | 0 |
| 7.13611 | 0 |
| 7.1375 | 0 |
| 7.13889 | 0 |
| 7.14028 | 0 |
| 7.14167 | 0 |
| 7.14306 | 0 |
| 7.14444 | 0 |
| 7.14583 | 0 |
| 7.14722 | 0 |
| 7.14861 | 0 |
| 7.15 | 0 |
| 7.15139 | 0 |
| 7.15278 | 0 |
| 7.15417 | 0 |
| 7.15556 | 0 |
| 7.15694 | 0 |
| 7.15833 | 0 |
| 7.15972 | 0 |
| 7.16111 | 0 |
| 7.1625 | 0 |
| 7.16389 | 0 |
| 7.16528 | 0 |
| 7.16667 | 0 |
| 7.16806 | 0 |
| 7.16944 | 0 |
| 7.17083 | 0 |
| 7.17222 | 0 |
| 7.17361 | 0 |
| 7.175 | 0 |
| 7.17639 | 0 |
| 7.17778 | 0 |
| 7.17917 | 0 |
| 7.18056 | 0 |
| 7.18194 | 0 |
| 7.18333 | 0 |
| 7.18472 | 0 |
| 7.18611 | 0 |
| 7.1875 | 0 |
| 7.18889 | 0 |
| 7.19028 | 0 |
| 7.19167 | 0 |
| 7.19306 | 0 |
| 7.19444 | 0 |
| 7.19583 | 0 |
| 7.19722 | 0 |
| 7.19861 | 0 |
| 7.2 | 0 |
| 7.20139 | 0 |
| 7.20278 | 0 |
| 7.20417 | 0 |
| 7.20556 | 0 |
| 7.20694 | 0 |
| 7.20833 | 0 |
| 7.20972 | 0 |
| 7.21111 | 0 |
| 7.2125 | 0 |
| 7.21389 | 0 |
| 7.21528 | 0 |
| 7.21667 | 0 |
| 7.21806 | 0 |
| 7.21944 | 0 |
| 7.22083 | 0 |
| 7.22222 | 0 |
| 7.22361 | 0 |
| 7.225 | 0 |
| 7.22639 | 0 |
| 7.22778 | 0 |
| 7.22917 | 0 |
| 7.23056 | 0 |
| 7.23194 | 0 |
| 7.23333 | 0 |
| 7.23472 | 0 |
| 7.23611 | 0 |
| 7.2375 | 0 |
| 7.23889 | 0 |
| 7.24028 | 0 |
| 7.24167 | 0 |
| 7.24306 | 0 |
| 7.24444 | 0 |
| 7.24583 | 0 |
| 7.24722 | 0 |
| 7.24861 | 0 |
| 7.25 | 0 |
| 7.25139 | 0 |
| 7.25278 | 0 |
| 7.25417 | 0 |
| 7.25556 | 0 |
| 7.25694 | 0 |
| 7.25833 | 0 |
| 7.25972 | 0 |
| 7.26111 | 0 |
| 7.2625 | 0 |
| 7.26389 | 0 |
| 7.26528 | 0 |
| 7.26667 | 0 |
| 7.26806 | 0 |
| 7.26944 | 0 |
| 7.27083 | 0 |
| 7.27222 | 0 |
| 7.27361 | 0 |
| 7.275 | 0 |
| 7.27639 | 0 |
| 7.27778 | 0 |
| 7.27917 | 0 |
| 7.28056 | 0 |
| 7.28194 | 0 |
| 7.28333 | 0 |
| 7.28472 | 0 |
| 7.28611 | 0 |
| 7.2875 | 0 |
| 7.28889 | 0 |
| 7.29028 | 0 |
| 7.29167 | 0 |
| 7.29306 | 0 |
| 7.29444 | 0 |
| 7.29583 | 0 |
| 7.29722 | 0 |
| 7.29861 | 0 |
| 7.3 | 0 |
| 7.30139 | 0 |
| 7.30278 | 0 |
| 7.30417 | 0 |
| 7.30556 | 0 |
| 7.30694 | 0 |
| 7.30833 | 0 |
| 7.30972 | 0 |
| 7.31111 | 0 |
| 7.3125 | 0 |
| 7.31389 | 0 |
| 7.31528 | 0 |
| 7.31667 | 0 |
| 7.31806 | 0 |
| 7.31944 | 0 |
| 7.32083 | 0 |
| 7.32222 | 0 |
| 7.32361 | 0 |
| 7.325 | 0 |
| 7.32639 | 0 |
| 7.32778 | 0 |
| 7.32917 | 0 |
| 7.33056 | 0 |
| 7.33194 | 0 |
| 7.33333 | 0 |
| 7.33472 | 0 |
| 7.33611 | 0 |
| 7.3375 | 0 |
| 7.33889 | 0 |
| 7.34028 | 0 |
| 7.34167 | 0 |
| 7.34306 | 0 |
| 7.34444 | 0 |
| 7.34583 | 0 |
| 7.34722 | 0 |
| 7.34861 | 0 |
| 7.35 | 0 |
| 7.35139 | 0 |
| 7.35278 | 0 |
| 7.35417 | 0 |
| 7.35556 | 0 |
| 7.35694 | 0 |
| 7.35833 | 0 |
| 7.35972 | 0 |
| 7.36111 | 0 |
| 7.3625 | 0 |
| 7.36389 | 0 |
| 7.36528 | 0 |
| 7.36667 | 0 |
| 7.36806 | 0 |
| 7.36944 | 0 |
| 7.37083 | 0 |
| 7.37222 | 0 |
| 7.37361 | 0 |
| 7.375 | 0 |
| 7.37639 | 0 |
| 7.37778 | 0 |
| 7.37917 | 0 |
| 7.38056 | 0 |
| 7.38194 | 0 |
| 7.38333 | 0 |
| 7.38472 | 0 |
| 7.38611 | 0 |
| 7.3875 | 0 |
| 7.38889 | 0 |
| 7.39028 | 0 |
| 7.39167 | 0 |
| 7.39306 | 0 |
| 7.39444 | 0 |
| 7.39583 | 0 |
| 7.39722 | 0 |
| 7.39861 | 0 |
| 7.4 | 0 |
| 7.40139 | 0 |
| 7.40278 | 0 |
| 7.40417 | 0 |
| 7.40556 | 0 |
| 7.40694 | 0 |
| 7.40833 | 0 |
| 7.40972 | 0 |
| 7.41111 | 0 |
| 7.4125 | 0 |
| 7.41389 | 0 |
| 7.41528 | 0 |
| 7.41667 | 0 |
| 7.41806 | 0 |
| 7.41944 | 0 |
| 7.42083 | 0 |
| 7.42222 | 0 |
| 7.42361 | 0 |
| 7.425 | 0 |
| 7.42639 | 0 |
| 7.42778 | 0 |
| 7.42917 | 0 |
| 7.43056 | 0 |
| 7.43194 | 0 |
| 7.43333 | 0 |
| 7.43472 | 0 |
| 7.43611 | 0 |
| 7.4375 | 0 |
| 7.43889 | 0 |
| 7.44028 | 0 |
| 7.44167 | 0 |
| 7.44306 | 0 |
| 7.44444 | 0 |
| 7.44583 | 0 |
| 7.44722 | 0 |
| 7.44861 | 0 |
| 7.45 | 0 |
| 7.45139 | 0 |
| 7.45278 | 0 |
| 7.45417 | 0 |
| 7.45556 | 0 |
| 7.45694 | 0 |
| 7.45833 | 0 |
| 7.45972 | 0 |
| 7.46111 | 0 |
| 7.4625 | 0 |
| 7.46389 | 0 |
| 7.46528 | 0 |
| 7.46667 | 0 |
| 7.46806 | 0 |
| 7.46944 | 0 |
| 7.47083 | 0 |
| 7.47222 | 0 |
| 7.47361 | 0 |
| 7.475 | 0 |
| 7.47639 | 0 |
| 7.47778 | 0 |
| 7.47917 | 0 |
| 7.48056 | 0 |
| 7.48194 | 0 |
| 7.48333 | 0 |
| 7.48472 | 0 |
| 7.48611 | 0 |
| 7.4875 | 0 |
| 7.48889 | 0 |
| 7.49028 | 0 |
| 7.49167 | 0 |
| 7.49306 | 0 |
| 7.49444 | 0 |
| 7.49583 | 0 |
| 7.49722 | 0 |
| 7.49861 | 0 |
| 7.5 | 0 |
| 7.50139 | 0 |
| 7.50278 | 0 |
| 7.50417 | 0 |
| 7.50556 | 0 |
| 7.50694 | 0 |
| 7.50833 | 0 |
| 7.50972 | 0 |
| 7.51111 | 0 |
| 7.5125 | 0 |
| 7.51389 | 0 |
| 7.51528 | 0 |
| 7.51667 | 0 |
| 7.51806 | 0 |
| 7.51944 | 0 |
| 7.52083 | 0 |
| 7.52222 | 0 |
| 7.52361 | 0 |
| 7.525 | 0 |
| 7.52639 | 0 |
| 7.52778 | 0 |
| 7.52917 | 0 |
| 7.53056 | 0 |
| 7.53194 | 0 |
| 7.53333 | 0 |
| 7.53472 | 0 |
| 7.53611 | 0 |
| 7.5375 | 0 |
| 7.53889 | 0 |
| 7.54028 | 0 |
| 7.54167 | 0 |
| 7.54306 | 0 |
| 7.54444 | 0 |
| 7.54583 | 0 |
| 7.54722 | 0 |
| 7.54861 | 0 |
| 7.55 | 0 |
| 7.55139 | 0 |
| 7.55278 | 0 |
| 7.55417 | 0 |
| 7.55556 | 0 |
| 7.55694 | 0 |
| 7.55833 | 0 |
| 7.55972 | 0 |
| 7.56111 | 0 |
| 7.5625 | 0 |
| 7.56389 | 0 |
| 7.56528 | 0 |
| 7.56667 | 0 |
| 7.56806 | 0 |
| 7.56944 | 0 |
| 7.57083 | 0 |
| 7.57222 | 0 |
| 7.57361 | 0 |
| 7.575 | 0 |
| 7.57639 | 0 |
| 7.57778 | 0 |
| 7.57917 | 0 |
| 7.58056 | 0 |
| 7.58194 | 0 |
| 7.58333 | 0 |
| 7.58472 | 0 |
| 7.58611 | 0 |
| 7.5875 | 0 |
| 7.58889 | 0 |
| 7.59028 | 0 |
| 7.59167 | 0 |
| 7.59306 | 0 |
| 7.59444 | 0 |
| 7.59583 | 0 |
| 7.59722 | 0 |
| 7.59861 | 0 |
| 7.6 | 0 |
| 7.60139 | 0 |
| 7.60278 | 0 |
| 7.60417 | 0 |
| 7.60556 | 0 |
| 7.60694 | 0 |
| 7.60833 | 0 |
| 7.60972 | 0 |
| 7.61111 | 0 |
| 7.6125 | 0 |
| 7.61389 | 0 |
| 7.61528 | 0 |
| 7.61667 | 0 |
| 7.61806 | 0 |
| 7.61944 | 0 |
| 7.62083 | 0 |
| 7.62222 | 0 |
| 7.62361 | 0 |
| 7.625 | 0 |
| 7.62639 | 0 |
| 7.62778 | 0 |
| 7.62917 | 0 |
| 7.63056 | 0 |
| 7.63194 | 0 |
| 7.63333 | 0 |
| 7.63472 | 0 |
| 7.63611 | 0 |
| 7.6375 | 0 |
| 7.63889 | 0 |
| 7.64028 | 0 |
| 7.64167 | 0 |
| 7.64306 | 0 |
| 7.64444 | 0 |
| 7.64583 | 0 |
| 7.64722 | 0 |
| 7.64861 | 0 |
| 7.65 | 0 |
| 7.65139 | 0 |
| 7.65278 | 0 |
| 7.65417 | 0 |
| 7.65556 | 0 |
| 7.65694 | 0 |
| 7.65833 | 0 |
| 7.65972 | 0 |
| 7.66111 | 0 |
| 7.6625 | 0 |
| 7.66389 | 0 |
| 7.66528 | 0 |
| 7.66667 | 0 |
| 7.66806 | 0 |
| 7.66944 | 0 |
| 7.67083 | 0 |
| 7.67222 | 0 |
| 7.67361 | 0 |
| 7.675 | 0 |
| 7.67639 | 0 |
| 7.67778 | 0 |
| 7.67917 | 0 |
| 7.68056 | 0 |
| 7.68194 | 0 |
| 7.68333 | 0 |
| 7.68472 | 0 |
| 7.68611 | 0 |
| 7.6875 | 0 |
| 7.68889 | 0 |
| 7.69028 | 0 |
| 7.69167 | 0 |
| 7.69306 | 0 |
| 7.69444 | 0 |
| 7.69583 | 0 |
| 7.69722 | 0 |
| 7.69861 | 0 |
| 7.7 | 0 |
| 7.70139 | 0 |
| 7.70278 | 0 |
| 7.70417 | 0 |
| 7.70556 | 0 |
| 7.70694 | 0 |
| 7.70833 | 0 |
| 7.70972 | 0 |
| 7.71111 | 0 |
| 7.7125 | 0 |
| 7.71389 | 0 |
| 7.71528 | 0 |
| 7.71667 | 0 |
| 7.71806 | 0 |
| 7.71944 | 0 |
| 7.72083 | 0 |
| 7.72222 | 0 |
| 7.72361 | 0 |
| 7.725 | 0 |
| 7.72639 | 0 |
| 7.72778 | 0 |
| 7.72917 | 0 |
| 7.73056 | 0 |
| 7.73194 | 0 |
| 7.73333 | 0 |
| 7.73472 | 0 |
| 7.73611 | 0 |
| 7.7375 | 0 |
| 7.73889 | 0 |
| 7.74028 | 0 |
| 7.74167 | 0 |
| 7.74306 | 0 |
| 7.74444 | 0 |
| 7.74583 | 0 |
| 7.74722 | 0 |
| 7.74861 | 0 |
| 7.75 | 0 |
| 7.75139 | 0 |
| 7.75278 | 0 |
| 7.75417 | 0 |
| 7.75556 | 0 |
| 7.75694 | 0 |
| 7.75833 | 0 |
| 7.75972 | 0 |
| 7.76111 | 0 |
| 7.7625 | 0 |
| 7.76389 | 0 |
| 7.76528 | 0 |
| 7.76667 | 0 |
| 7.76806 | 0 |
| 7.76944 | 0 |
| 7.77083 | 0 |
| 7.77222 | 0 |
| 7.77361 | 0 |
| 7.775 | 0 |
| 7.77639 | 0 |
| 7.77778 | 0 |
| 7.77917 | 0 |
| 7.78056 | 0 |
| 7.78194 | 0 |
| 7.78333 | 0 |
| 7.78472 | 0 |
| 7.78611 | 0 |
| 7.7875 | 0 |
| 7.78889 | 0 |
| 7.79028 | 0 |
| 7.79167 | 0 |
| 7.79306 | 0 |
| 7.79444 | 0 |
| 7.79583 | 0 |
| 7.79722 | 0 |
| 7.79861 | 0 |
| 7.8 | 0 |
| 7.80139 | 0 |
| 7.80278 | 0 |
| 7.80417 | 0 |
| 7.80556 | 0 |
| 7.80694 | 0 |
| 7.80833 | 0 |
| 7.80972 | 0 |
| 7.81111 | 0 |
| 7.8125 | 0 |
| 7.81389 | 0 |
| 7.81528 | 0 |
| 7.81667 | 0 |
| 7.81806 | 0 |
| 7.81944 | 0 |
| 7.82083 | 0 |
| 7.82222 | 0 |
| 7.82361 | 0 |
| 7.825 | 0 |
| 7.82639 | 0 |
| 7.82778 | 0 |
| 7.82917 | 0 |
| 7.83056 | 0 |
| 7.83194 | 0 |
| 7.83333 | 0 |
| 7.83472 | 0 |
| 7.83611 | 0 |
| 7.8375 | 0 |
| 7.83889 | 0 |
| 7.84028 | 0 |
| 7.84167 | 0 |
| 7.84306 | 0 |
| 7.84444 | 0 |
| 7.84583 | 0 |
| 7.84722 | 0 |
| 7.84861 | 0 |
| 7.85 | 0 |
| 7.85139 | 0 |
| 7.85278 | 0 |
| 7.85417 | 0 |
| 7.85556 | 0 |
| 7.85694 | 0 |
| 7.85833 | 0 |
| 7.85972 | 0 |
| 7.86111 | 0 |
| 7.8625 | 0 |
| 7.86389 | 0 |
| 7.86528 | 0 |
| 7.86667 | 0 |
| 7.86806 | 0 |
| 7.86944 | 0 |
| 7.87083 | 0 |
| 7.87222 | 0 |
| 7.87361 | 0 |
| 7.875 | 0 |
| 7.87639 | 0 |
| 7.87778 | 0 |
| 7.87917 | 0 |
| 7.88056 | 0 |
| 7.88194 | 0 |
| 7.88333 | 0 |
| 7.88472 | 0 |
| 7.88611 | 0 |
| 7.8875 | 0 |
| 7.88889 | 0 |
| 7.89028 | 0 |
| 7.89167 | 0 |
| 7.89306 | 0 |
| 7.89444 | 0 |
| 7.89583 | 0 |
| 7.89722 | 0 |
| 7.89861 | 0 |
| 7.9 | 0 |
| 7.90139 | 0 |
| 7.90278 | 0 |
| 7.90417 | 0 |
| 7.90556 | 0 |
| 7.90694 | 0 |
| 7.90833 | 0 |
| 7.90972 | 0 |
| 7.91111 | 0 |
| 7.9125 | 0 |
| 7.91389 | 0 |
| 7.91528 | 0 |
| 7.91667 | 0 |
| 7.91806 | 0 |
| 7.91944 | 0 |
| 7.92083 | 0 |
| 7.92222 | 0 |
| 7.92361 | 0 |
| 7.925 | 0 |
| 7.92639 | 0 |
| 7.92778 | 0 |
| 7.92917 | 0 |
| 7.93056 | 0 |
| 7.93194 | 0 |
| 7.93333 | 0 |
| 7.93472 | 0 |
| 7.93611 | 0 |
| 7.9375 | 0 |
| 7.93889 | 0 |
| 7.94028 | 0 |
| 7.94167 | 0 |
| 7.94306 | 0 |
| 7.94444 | 0 |
| 7.94583 | 0 |
| 7.94722 | 0 |
| 7.94861 | 0 |
| 7.95 | 0 |
| 7.95139 | 0 |
| 7.95278 | 0 |
| 7.95417 | 0 |
| 7.95556 | 0 |
| 7.95694 | 0 |
| 7.95833 | 0 |
| 7.95972 | 0 |
| 7.96111 | 0 |
| 7.9625 | 0 |
| 7.96389 | 0 |
| 7.96528 | 0 |
| 7.96667 | 0 |
| 7.96806 | 0 |
| 7.96944 | 0 |
| 7.97083 | 0 |
| 7.97222 | 0 |
| 7.97361 | 0 |
| 7.975 | 0 |
| 7.97639 | 0 |
| 7.97778 | 0 |
| 7.97917 | 0 |
| 7.98056 | 0 |
| 7.98194 | 0 |
| 7.98333 | 0 |
| 7.98472 | 0 |
| 7.98611 | 0 |
| 7.9875 | 0 |
| 7.98889 | 0 |
| 7.99028 | 0 |
| 7.99167 | 0 |
| 7.99306 | 0 |
| 7.99444 | 0 |
| 7.99583 | 0 |
| 7.99722 | 0 |
| 7.99861 | 0 |
| 8.0 | 0 |
| 8.00139 | 0 |
| 8.00278 | 0 |
| 8.00417 | 0 |
| 8.00556 | 0 |
| 8.00694 | 0 |
| 8.00833 | 0 |
| 8.00972 | 0 |
| 8.01111 | 0 |
| 8.0125 | 0 |
| 8.01389 | 0 |
| 8.01528 | 0 |
| 8.01667 | 0 |
| 8.01806 | 0 |
| 8.01944 | 0 |
| 8.02083 | 0 |
| 8.02222 | 0 |
| 8.02361 | 0 |
| 8.025 | 0 |
| 8.02639 | 0 |
| 8.02778 | 0 |
| 8.02917 | 0 |
| 8.03056 | 0 |
| 8.03194 | 0 |
| 8.03333 | 0 |
| 8.03472 | 0 |
| 8.03611 | 0 |
| 8.0375 | 0 |
| 8.03889 | 0 |
| 8.04028 | 0 |
| 8.04167 | 0 |
| 8.04306 | 0 |
| 8.04444 | 0 |
| 8.04583 | 0 |
| 8.04722 | 0 |
| 8.04861 | 0 |
| 8.05 | 0 |
| 8.05139 | 0 |
| 8.05278 | 0 |
| 8.05417 | 0 |
| 8.05556 | 0 |
| 8.05694 | 0 |
| 8.05833 | 0 |
| 8.05972 | 0 |
| 8.06111 | 0 |
| 8.0625 | 0 |
| 8.06389 | 0 |
| 8.06528 | 0 |
| 8.06667 | 0 |
| 8.06806 | 0 |
| 8.06944 | 0 |
| 8.07083 | 0 |
| 8.07222 | 0 |
| 8.07361 | 0 |
| 8.075 | 0 |
| 8.07639 | 0 |
| 8.07778 | 0 |
| 8.07917 | 0 |
| 8.08056 | 0 |
| 8.08194 | 0 |
| 8.08333 | 0 |
| 8.08472 | 0 |
| 8.08611 | 0 |
| 8.0875 | 0 |
| 8.08889 | 0 |
| 8.09028 | 0 |
| 8.09167 | 0 |
| 8.09306 | 0 |
| 8.09444 | 0 |
| 8.09583 | 0 |
| 8.09722 | 0 |
| 8.09861 | 0 |
| 8.1 | 0 |
| 8.10139 | 0 |
| 8.10278 | 0 |
| 8.10417 | 0 |
| 8.10556 | 0 |
| 8.10694 | 0 |
| 8.10833 | 0 |
| 8.10972 | 0 |
| 8.11111 | 0 |
| 8.1125 | 0 |
| 8.11389 | 0 |
| 8.11528 | 0 |
| 8.11667 | 0 |
| 8.11806 | 0 |
| 8.11944 | 0 |
| 8.12083 | 0 |
| 8.12222 | 0 |
| 8.12361 | 0 |
| 8.125 | 0 |
| 8.12639 | 0 |
| 8.12778 | 0 |
| 8.12917 | 0 |
| 8.13056 | 0 |
| 8.13194 | 0 |
| 8.13333 | 0 |
| 8.13472 | 0 |
| 8.13611 | 0 |
| 8.1375 | 0 |
| 8.13889 | 0 |
| 8.14028 | 0 |
| 8.14167 | 0 |
| 8.14306 | 0 |
| 8.14444 | 0 |
| 8.14583 | 0 |
| 8.14722 | 0 |
| 8.14861 | 0 |
| 8.15 | 0 |
| 8.15139 | 0 |
| 8.15278 | 0 |
| 8.15417 | 0 |
| 8.15556 | 0 |
| 8.15694 | 0 |
| 8.15833 | 0 |
| 8.15972 | 0 |
| 8.16111 | 0 |
| 8.1625 | 0 |
| 8.16389 | 0 |
| 8.16528 | 0 |
| 8.16667 | 0 |
| 8.16806 | 0 |
| 8.16944 | 0 |
| 8.17083 | 0 |
| 8.17222 | 0 |
| 8.17361 | 0 |
| 8.175 | 0 |
| 8.17639 | 0 |
| 8.17778 | 0 |
| 8.17917 | 0 |
| 8.18056 | 0 |
| 8.18194 | 0 |
| 8.18333 | 0 |
| 8.18472 | 0 |
| 8.18611 | 0 |
| 8.1875 | 0 |
| 8.18889 | 0 |
| 8.19028 | 0 |
| 8.19167 | 0 |
| 8.19306 | 0 |
| 8.19444 | 0 |
| 8.19583 | 0 |
| 8.19722 | 0 |
| 8.19861 | 0 |
| 8.2 | 0 |
| 8.20139 | 0 |
| 8.20278 | 0 |
| 8.20417 | 0 |
| 8.20556 | 0 |
| 8.20694 | 0 |
| 8.20833 | 0 |
| 8.20972 | 0 |
| 8.21111 | 0 |
| 8.2125 | 0 |
| 8.21389 | 0 |
| 8.21528 | 0 |
| 8.21667 | 0 |
| 8.21806 | 0 |
| 8.21944 | 0 |
| 8.22083 | 0 |
| 8.22222 | 0 |
| 8.22361 | 0 |
| 8.225 | 0 |
| 8.22639 | 0 |
| 8.22778 | 0 |
| 8.22917 | 0 |
| 8.23056 | 0 |
| 8.23194 | 0 |
| 8.23333 | 0 |
| 8.23472 | 0 |
| 8.23611 | 0 |
| 8.2375 | 0 |
| 8.23889 | 0 |
| 8.24028 | 0 |
| 8.24167 | 0 |
| 8.24306 | 0 |
| 8.24444 | 0 |
| 8.24583 | 0 |
| 8.24722 | 0 |
| 8.24861 | 0 |
| 8.25 | 0 |
| 8.25139 | 0 |
| 8.25278 | 0 |
| 8.25417 | 0 |
| 8.25556 | 0 |
| 8.25694 | 0 |
| 8.25833 | 0 |
| 8.25972 | 0 |
| 8.26111 | 0 |
| 8.2625 | 0 |
| 8.26389 | 0 |
| 8.26528 | 0 |
| 8.26667 | 0 |
| 8.26806 | 0 |
| 8.26944 | 0 |
| 8.27083 | 0 |
| 8.27222 | 0 |
| 8.27361 | 0 |
| 8.275 | 0 |
| 8.27639 | 0 |
| 8.27778 | 0 |
| 8.27917 | 0 |
| 8.28056 | 0 |
| 8.28194 | 0 |
| 8.28333 | 0 |
| 8.28472 | 0 |
| 8.28611 | 0 |
| 8.2875 | 0 |
| 8.28889 | 0 |
| 8.29028 | 0 |
| 8.29167 | 0 |
| 8.29306 | 0 |
| 8.29444 | 0 |
| 8.29583 | 0 |
| 8.29722 | 0 |
| 8.29861 | 0 |
| 8.3 | 0 |
| 8.30139 | 0 |
| 8.30278 | 0 |
| 8.30417 | 0 |
| 8.30556 | 0 |
| 8.30694 | 0 |
| 8.30833 | 0 |
| 8.30972 | 0 |
| 8.31111 | 0 |
| 8.3125 | 0 |
| 8.31389 | 0 |
| 8.31528 | 0 |
| 8.31667 | 0 |
| 8.31806 | 0 |
| 8.31944 | 0 |
| 8.32083 | 0 |
| 8.32222 | 0 |
| 8.32361 | 0 |
| 8.325 | 0 |
| 8.32639 | 0 |
| 8.32778 | 0 |
| 8.32917 | 0 |
| 8.33056 | 0 |
| 8.33194 | 0 |
| 8.33333 | 0 |
| 8.33472 | 0 |
| 8.33611 | 0 |
| 8.3375 | 0 |
| 8.33889 | 0 |
| 8.34028 | 0 |
| 8.34167 | 0 |
| 8.34306 | 0 |
| 8.34444 | 0 |
| 8.34583 | 0 |
| 8.34722 | 0 |
| 8.34861 | 0 |
| 8.35 | 0 |
| 8.35139 | 0 |
| 8.35278 | 0 |
| 8.35417 | 0 |
| 8.35556 | 0 |
| 8.35694 | 0 |
| 8.35833 | 0 |
| 8.35972 | 0 |
| 8.36111 | 0 |
| 8.3625 | 0 |
| 8.36389 | 0 |
| 8.36528 | 0 |
| 8.36667 | 0 |
| 8.36806 | 0 |
| 8.36944 | 0 |
| 8.37083 | 0 |
| 8.37222 | 0 |
| 8.37361 | 0 |
| 8.375 | 0 |
| 8.37639 | 0 |
| 8.37778 | 0 |
| 8.37917 | 0 |
| 8.38056 | 0 |
| 8.38194 | 0 |
| 8.38333 | 0 |
| 8.38472 | 0 |
| 8.38611 | 0 |
| 8.3875 | 0 |
| 8.38889 | 0 |
| 8.39028 | 0 |
| 8.39167 | 0 |
| 8.39306 | 0 |
| 8.39444 | 0 |
| 8.39583 | 0 |
| 8.39722 | 0 |
| 8.39861 | 0 |
| 8.4 | 0 |
| 8.40139 | 0 |
| 8.40278 | 0 |
| 8.40417 | 0 |
| 8.40556 | 0 |
| 8.40694 | 0 |
| 8.40833 | 0 |
| 8.40972 | 0 |
| 8.41111 | 0 |
| 8.4125 | 0 |
| 8.41389 | 0 |
| 8.41528 | 0 |
| 8.41667 | 0 |
| 8.41806 | 0 |
| 8.41944 | 0 |
| 8.42083 | 0 |
| 8.42222 | 0 |
| 8.42361 | 0 |
| 8.425 | 0 |
| 8.42639 | 0 |
| 8.42778 | 0 |
| 8.42917 | 0 |
| 8.43056 | 0 |
| 8.43194 | 0 |
| 8.43333 | 0 |
| 8.43472 | 0 |
| 8.43611 | 0 |
| 8.4375 | 0 |
| 8.43889 | 0 |
| 8.44028 | 0 |
| 8.44167 | 0 |
| 8.44306 | 0 |
| 8.44444 | 0 |
| 8.44583 | 0 |
| 8.44722 | 0 |
| 8.44861 | 0 |
| 8.45 | 0 |
| 8.45139 | 0 |
| 8.45278 | 0 |
| 8.45417 | 0 |
| 8.45556 | 0 |
| 8.45694 | 0 |
| 8.45833 | 0 |
| 8.45972 | 0 |
| 8.46111 | 0 |
| 8.4625 | 0 |
| 8.46389 | 0 |
| 8.46528 | 0 |
| 8.46667 | 0 |
| 8.46806 | 0 |
| 8.46944 | 0 |
| 8.47083 | 0 |
| 8.47222 | 0 |
| 8.47361 | 0 |
| 8.475 | 0 |
| 8.47639 | 0 |
| 8.47778 | 0 |
| 8.47917 | 0 |
| 8.48056 | 0 |
| 8.48194 | 0 |
| 8.48333 | 0 |
| 8.48472 | 0 |
| 8.48611 | 0 |
| 8.4875 | 0 |
| 8.48889 | 0 |
| 8.49028 | 0 |
| 8.49167 | 0 |
| 8.49306 | 0 |
| 8.49444 | 0 |
| 8.49583 | 0 |
| 8.49722 | 0 |
| 8.49861 | 0 |
| 8.5 | 0 |
| 8.50139 | 0 |
| 8.50278 | 0 |
| 8.50417 | 0 |
| 8.50556 | 0 |
| 8.50694 | 0 |
| 8.50833 | 0 |
| 8.50972 | 0 |
| 8.51111 | 0 |
| 8.5125 | 0 |
| 8.51389 | 0 |
| 8.51528 | 0 |
| 8.51667 | 0 |
| 8.51806 | 0 |
| 8.51944 | 0 |
| 8.52083 | 0 |
| 8.52222 | 0 |
| 8.52361 | 0 |
| 8.525 | 0 |
| 8.52639 | 0 |
| 8.52778 | 0 |
| 8.52917 | 0 |
| 8.53056 | 0 |
| 8.53194 | 0 |
| 8.53333 | 0 |
| 8.53472 | 0 |
| 8.53611 | 0 |
| 8.5375 | 0 |
| 8.53889 | 0 |
| 8.54028 | 0 |
| 8.54167 | 0 |
| 8.54306 | 0 |
| 8.54444 | 0 |
| 8.54583 | 0 |
| 8.54722 | 0 |
| 8.54861 | 0 |
| 8.55 | 0 |
| 8.55139 | 0 |
| 8.55278 | 0 |
| 8.55417 | 0 |
| 8.55556 | 0 |
| 8.55694 | 0 |
| 8.55833 | 0 |
| 8.55972 | 0 |
| 8.56111 | 0 |
| 8.5625 | 0 |
| 8.56389 | 0 |
| 8.56528 | 0 |
| 8.56667 | 0 |
| 8.56806 | 0 |
| 8.56944 | 0 |
| 8.57083 | 0 |
| 8.57222 | 0 |
| 8.57361 | 0 |
| 8.575 | 0 |
| 8.57639 | 0 |
| 8.57778 | 0 |
| 8.57917 | 0 |
| 8.58056 | 0 |
| 8.58194 | 0 |
| 8.58333 | 0 |
| 8.58472 | 0 |
| 8.58611 | 0 |
| 8.5875 | 0 |
| 8.58889 | 0 |
| 8.59028 | 0 |
| 8.59167 | 0 |
| 8.59306 | 0 |
| 8.59444 | 0 |
| 8.59583 | 0 |
| 8.59722 | 0 |
| 8.59861 | 0 |
| 8.6 | 0 |
| 8.60139 | 0 |
| 8.60278 | 0 |
| 8.60417 | 0 |
| 8.60556 | 0 |
| 8.60694 | 0 |
| 8.60833 | 0 |
| 8.60972 | 0 |
| 8.61111 | 0 |
| 8.6125 | 0 |
| 8.61389 | 0 |
| 8.61528 | 0 |
| 8.61667 | 0 |
| 8.61806 | 0 |
| 8.61944 | 0 |
| 8.62083 | 0 |
| 8.62222 | 0 |
| 8.62361 | 0 |
| 8.625 | 0 |
| 8.62639 | 0 |
| 8.62778 | 0 |
| 8.62917 | 0 |
| 8.63056 | 0 |
| 8.63194 | 0 |
| 8.63333 | 0 |
| 8.63472 | 0 |
| 8.63611 | 0 |
| 8.6375 | 0 |
| 8.63889 | 0 |
| 8.64028 | 0 |
| 8.64167 | 0 |
| 8.64306 | 0 |
| 8.64444 | 0 |
| 8.64583 | 0 |
| 8.64722 | 0 |
| 8.64861 | 0 |
| 8.65 | 0 |
| 8.65139 | 0 |
| 8.65278 | 0 |
| 8.65417 | 0 |
| 8.65556 | 0 |
| 8.65694 | 0 |
| 8.65833 | 0 |
| 8.65972 | 0 |
| 8.66111 | 0 |
| 8.6625 | 0 |
| 8.66389 | 0 |
| 8.66528 | 0 |
| 8.66667 | 0 |
| 8.66806 | 0 |
| 8.66944 | 0 |
| 8.67083 | 0 |
| 8.67222 | 0 |
| 8.67361 | 0 |
| 8.675 | 0 |
| 8.67639 | 0 |
| 8.67778 | 0 |
| 8.67917 | 0 |
| 8.68056 | 0 |
| 8.68194 | 0 |
| 8.68333 | 0 |
| 8.68472 | 0 |
| 8.68611 | 0 |
| 8.6875 | 0 |
| 8.68889 | 0 |
| 8.69028 | 0 |
| 8.69167 | 0 |
| 8.69306 | 0 |
| 8.69444 | 0 |
| 8.69583 | 0 |
| 8.69722 | 0 |
| 8.69861 | 0 |
| 8.7 | 0 |
| 8.70139 | 0 |
| 8.70278 | 0 |
| 8.70417 | 0 |
| 8.70556 | 0 |
| 8.70694 | 0 |
| 8.70833 | 0 |
| 8.70972 | 0 |
| 8.71111 | 0 |
| 8.7125 | 0 |
| 8.71389 | 0 |
| 8.71528 | 0 |
| 8.71667 | 0 |
| 8.71806 | 0 |
| 8.71944 | 0 |
| 8.72083 | 0 |
| 8.72222 | 0 |
| 8.72361 | 0 |
| 8.725 | 0 |
| 8.72639 | 0 |
| 8.72778 | 0 |
| 8.72917 | 0 |
| 8.73056 | 0 |
| 8.73194 | 0 |
| 8.73333 | 0 |
| 8.73472 | 0 |
| 8.73611 | 0 |
| 8.7375 | 0 |
| 8.73889 | 0 |
| 8.74028 | 0 |
| 8.74167 | 0 |
| 8.74306 | 0 |
| 8.74444 | 0 |
| 8.74583 | 0 |
| 8.74722 | 0 |
| 8.74861 | 0 |
| 8.75 | 0 |
| 8.75139 | 0 |
| 8.75278 | 0 |
| 8.75417 | 0 |
| 8.75556 | 0 |
| 8.75694 | 0 |
| 8.75833 | 0 |
| 8.75972 | 0 |
| 8.76111 | 0 |
| 8.7625 | 0 |
| 8.76389 | 0 |
| 8.76528 | 0 |
| 8.76667 | 0 |
| 8.76806 | 0 |
| 8.76944 | 0 |
| 8.77083 | 0 |
| 8.77222 | 0 |
| 8.77361 | 0 |
| 8.775 | 0 |
| 8.77639 | 0 |
| 8.77778 | 0 |
| 8.77917 | 0 |
| 8.78056 | 0 |
| 8.78194 | 0 |
| 8.78333 | 0 |
| 8.78472 | 0 |
| 8.78611 | 0 |
| 8.7875 | 0 |
| 8.78889 | 0 |
| 8.79028 | 0 |
| 8.79167 | 0 |
| 8.79306 | 0 |
| 8.79444 | 0 |
| 8.79583 | 0 |
| 8.79722 | 0 |
| 8.79861 | 0 |
| 8.8 | 0 |
| 8.80139 | 0 |
| 8.80278 | 0 |
| 8.80417 | 0 |
| 8.80556 | 0 |
| 8.80694 | 0 |
| 8.80833 | 0 |
| 8.80972 | 0 |
| 8.81111 | 0 |
| 8.8125 | 0 |
| 8.81389 | 0 |
| 8.81528 | 0 |
| 8.81667 | 0 |
| 8.81806 | 0 |
| 8.81944 | 0 |
| 8.82083 | 0 |
| 8.82222 | 0 |
| 8.82361 | 0 |
| 8.825 | 0 |
| 8.82639 | 0 |
| 8.82778 | 0 |
| 8.82917 | 0 |
| 8.83056 | 0 |
| 8.83194 | 0 |
| 8.83333 | 0 |
| 8.83472 | 0 |
| 8.83611 | 0 |
| 8.8375 | 0 |
| 8.83889 | 0 |
| 8.84028 | 0 |
| 8.84167 | 0 |
| 8.84306 | 0 |
| 8.84444 | 0 |
| 8.84583 | 0 |
| 8.84722 | 0 |
| 8.84861 | 0 |
| 8.85 | 0 |
| 8.85139 | 0 |
| 8.85278 | 0 |
| 8.85417 | 0 |
| 8.85556 | 0 |
| 8.85694 | 0 |
| 8.85833 | 0 |
| 8.85972 | 0 |
| 8.86111 | 0 |
| 8.8625 | 0 |
| 8.86389 | 0 |
| 8.86528 | 0 |
| 8.86667 | 0 |
| 8.86806 | 0 |
| 8.86944 | 0 |
| 8.87083 | 0 |
| 8.87222 | 0 |
| 8.87361 | 0 |
| 8.875 | 0 |
| 8.87639 | 0 |
| 8.87778 | 0 |
| 8.87917 | 0 |
| 8.88056 | 0 |
| 8.88194 | 0 |
| 8.88333 | 0 |
| 8.88472 | 0 |
| 8.88611 | 0 |
| 8.8875 | 0 |
| 8.88889 | 0 |
| 8.89028 | 0 |
| 8.89167 | 0 |
| 8.89306 | 0 |
| 8.89444 | 0 |
| 8.89583 | 0 |
| 8.89722 | 0 |
| 8.89861 | 0 |
| 8.9 | 0 |
| 8.90139 | 0 |
| 8.90278 | 0 |
| 8.90417 | 0 |
| 8.90556 | 0 |
| 8.90694 | 0 |
| 8.90833 | 0 |
| 8.90972 | 0 |
| 8.91111 | 0 |
| 8.9125 | 0 |
| 8.91389 | 0 |
| 8.91528 | 0 |
| 8.91667 | 0 |
| 8.91806 | 0 |
| 8.91944 | 0 |
| 8.92083 | 0 |
| 8.92222 | 0 |
| 8.92361 | 0 |
| 8.925 | 0 |
| 8.92639 | 0 |
| 8.92778 | 0 |
| 8.92917 | 0 |
| 8.93056 | 0 |
| 8.93194 | 0 |
| 8.93333 | 0 |
| 8.93472 | 0 |
| 8.93611 | 0 |
| 8.9375 | 0 |
| 8.93889 | 0 |
| 8.94028 | 0 |
| 8.94167 | 0 |
| 8.94306 | 0 |
| 8.94444 | 0 |
| 8.94583 | 0 |
| 8.94722 | 0 |
| 8.94861 | 0 |
| 8.95 | 0 |
| 8.95139 | 0 |
| 8.95278 | 0 |
| 8.95417 | 0 |
| 8.95556 | 0 |
| 8.95694 | 0 |
| 8.95833 | 0 |
| 8.95972 | 0 |
| 8.96111 | 0 |
| 8.9625 | 0 |
| 8.96389 | 0 |
| 8.96528 | 0 |
| 8.96667 | 0 |
| 8.96806 | 0 |
| 8.96944 | 0 |
| 8.97083 | 0 |
| 8.97222 | 0 |
| 8.97361 | 0 |
| 8.975 | 0 |
| 8.97639 | 0 |
| 8.97778 | 0 |
| 8.97917 | 0 |
| 8.98056 | 0 |
| 8.98194 | 0 |
| 8.98333 | 0 |
| 8.98472 | 0 |
| 8.98611 | 0 |
| 8.9875 | 0 |
| 8.98889 | 0 |
| 8.99028 | 0 |
| 8.99167 | 0 |
| 8.99306 | 0 |
| 8.99444 | 0 |
| 8.99583 | 0 |
| 8.99722 | 0 |
| 8.99861 | 0 |
| 9.0 | 0 |
| 9.00139 | 0 |
| 9.00278 | 0 |
| 9.00417 | 0 |
| 9.00556 | 0 |
| 9.00694 | 0 |
| 9.00833 | 0 |
| 9.00972 | 0 |
| 9.01111 | 0 |
| 9.0125 | 0 |
| 9.01389 | 0 |
| 9.01528 | 0 |
| 9.01667 | 0 |
| 9.01806 | 0 |
| 9.01944 | 0 |
| 9.02083 | 0 |
| 9.02222 | 0 |
| 9.02361 | 0 |
| 9.025 | 0 |
| 9.02639 | 0 |
| 9.02778 | 0 |
| 9.02917 | 0 |
| 9.03056 | 0 |
| 9.03194 | 0 |
| 9.03333 | 0 |
| 9.03472 | 0 |
| 9.03611 | 0 |
| 9.0375 | 0 |
| 9.03889 | 0 |
| 9.04028 | 0 |
| 9.04167 | 0 |
| 9.04306 | 0 |
| 9.04444 | 0 |
| 9.04583 | 0 |
| 9.04722 | 0 |
| 9.04861 | 0 |
| 9.05 | 0 |
| 9.05139 | 0 |
| 9.05278 | 0 |
| 9.05417 | 0 |
| 9.05556 | 0 |
| 9.05694 | 0 |
| 9.05833 | 0 |
| 9.05972 | 0 |
| 9.06111 | 0 |
| 9.0625 | 0 |
| 9.06389 | 0 |
| 9.06528 | 0 |
| 9.06667 | 0 |
| 9.06806 | 0 |
| 9.06944 | 0 |
| 9.07083 | 0 |
| 9.07222 | 0 |
| 9.07361 | 0 |
| 9.075 | 0 |
| 9.07639 | 0 |
| 9.07778 | 0 |
| 9.07917 | 0 |
| 9.08056 | 0 |
| 9.08194 | 0 |
| 9.08333 | 0 |
| 9.08472 | 0 |
| 9.08611 | 0 |
| 9.0875 | 0 |
| 9.08889 | 0 |
| 9.09028 | 0 |
| 9.09167 | 0 |
| 9.09306 | 0 |
| 9.09444 | 0 |
| 9.09583 | 0 |
| 9.09722 | 0 |
| 9.09861 | 0 |
| 9.1 | 0 |
| 9.10139 | 0 |
| 9.10278 | 0 |
| 9.10417 | 0 |
| 9.10556 | 0 |
| 9.10694 | 0 |
| 9.10833 | 0 |
| 9.10972 | 0 |
| 9.11111 | 0 |
| 9.1125 | 0 |
| 9.11389 | 0 |
| 9.11528 | 0 |
| 9.11667 | 0 |
| 9.11806 | 0 |
| 9.11944 | 0 |
| 9.12083 | 0 |
| 9.12222 | 0 |
| 9.12361 | 0 |
| 9.125 | 0 |
| 9.12639 | 0 |
| 9.12778 | 0 |
| 9.12917 | 0 |
| 9.13056 | 0 |
| 9.13194 | 0 |
| 9.13333 | 0 |
| 9.13472 | 0 |
| 9.13611 | 0 |
| 9.1375 | 0 |
| 9.13889 | 0 |
| 9.14028 | 0 |
| 9.14167 | 0 |
| 9.14306 | 0 |
| 9.14444 | 0 |
| 9.14583 | 0 |
| 9.14722 | 0 |
| 9.14861 | 0 |
| 9.15 | 0 |
| 9.15139 | 0 |
| 9.15278 | 0 |
| 9.15417 | 0 |
| 9.15556 | 0 |
| 9.15694 | 0 |
| 9.15833 | 0 |
| 9.15972 | 0 |
| 9.16111 | 0 |
| 9.1625 | 0 |
| 9.16389 | 0 |
| 9.16528 | 0 |
| 9.16667 | 0 |
| 9.16806 | 0 |
| 9.16944 | 0 |
| 9.17083 | 0 |
| 9.17222 | 0 |
| 9.17361 | 0 |
| 9.175 | 0 |
| 9.17639 | 0 |
| 9.17778 | 0 |
| 9.17917 | 0 |
| 9.18056 | 0 |
| 9.18194 | 0 |
| 9.18333 | 0 |
| 9.18472 | 0 |
| 9.18611 | 0 |
| 9.1875 | 0 |
| 9.18889 | 0 |
| 9.19028 | 0 |
| 9.19167 | 0 |
| 9.19306 | 0 |
| 9.19444 | 0 |
| 9.19583 | 0 |
| 9.19722 | 0 |
| 9.19861 | 0 |
| 9.2 | 0 |
| 9.20139 | 0 |
| 9.20278 | 0 |
| 9.20417 | 0 |
| 9.20556 | 0 |
| 9.20694 | 0 |
| 9.20833 | 0 |
| 9.20972 | 0 |
| 9.21111 | 0 |
| 9.2125 | 0 |
| 9.21389 | 0 |
| 9.21528 | 0 |
| 9.21667 | 0 |
| 9.21806 | 0 |
| 9.21944 | 0 |
| 9.22083 | 0 |
| 9.22222 | 0 |
| 9.22361 | 0 |
| 9.225 | 0 |
| 9.22639 | 0 |
| 9.22778 | 0 |
| 9.22917 | 0 |
| 9.23056 | 0 |
| 9.23194 | 0 |
| 9.23333 | 0 |
| 9.23472 | 0 |
| 9.23611 | 0 |
| 9.2375 | 0 |
| 9.23889 | 0 |
| 9.24028 | 0 |
| 9.24167 | 0 |
| 9.24306 | 0 |
| 9.24444 | 0 |
| 9.24583 | 0 |
| 9.24722 | 0 |
| 9.24861 | 0 |
| 9.25 | 0 |
| 9.25139 | 0 |
| 9.25278 | 0 |
| 9.25417 | 0 |
| 9.25556 | 0 |
| 9.25694 | 0 |
| 9.25833 | 0 |
| 9.25972 | 0 |
| 9.26111 | 0 |
| 9.2625 | 0 |
| 9.26389 | 0 |
| 9.26528 | 0 |
| 9.26667 | 0 |
| 9.26806 | 0 |
| 9.26944 | 0 |
| 9.27083 | 0 |
| 9.27222 | 0 |
| 9.27361 | 0 |
| 9.275 | 0 |
| 9.27639 | 0 |
| 9.27778 | 0 |
| 9.27917 | 0 |
| 9.28056 | 0 |
| 9.28194 | 0 |
| 9.28333 | 0 |
| 9.28472 | 0 |
| 9.28611 | 0 |
| 9.2875 | 0 |
| 9.28889 | 0 |
| 9.29028 | 0 |
| 9.29167 | 0 |
| 9.29306 | 0 |
| 9.29444 | 0 |
| 9.29583 | 0 |
| 9.29722 | 0 |
| 9.29861 | 0 |
| 9.3 | 0 |
| 9.30139 | 0 |
| 9.30278 | 0 |
| 9.30417 | 0 |
| 9.30556 | 0 |
| 9.30694 | 0 |
| 9.30833 | 0 |
| 9.30972 | 0 |
| 9.31111 | 0 |
| 9.3125 | 0 |
| 9.31389 | 0 |
| 9.31528 | 0 |
| 9.31667 | 0 |
| 9.31806 | 0 |
| 9.31944 | 0 |
| 9.32083 | 0 |
| 9.32222 | 0 |
| 9.32361 | 0 |
| 9.325 | 0 |
| 9.32639 | 0 |
| 9.32778 | 0 |
| 9.32917 | 0 |
| 9.33056 | 0 |
| 9.33194 | 0 |
| 9.33333 | 0 |
| 9.33472 | 0 |
| 9.33611 | 0 |
| 9.3375 | 0 |
| 9.33889 | 0 |
| 9.34028 | 0 |
| 9.34167 | 0 |
| 9.34306 | 0 |
| 9.34444 | 0 |
| 9.34583 | 0 |
| 9.34722 | 0 |
| 9.34861 | 0 |
| 9.35 | 0 |
| 9.35139 | 0 |
| 9.35278 | 0 |
| 9.35417 | 0 |
| 9.35556 | 0 |
| 9.35694 | 0 |
| 9.35833 | 0 |
| 9.35972 | 0 |
| 9.36111 | 0 |
| 9.3625 | 0 |
| 9.36389 | 0 |
| 9.36528 | 0 |
| 9.36667 | 0 |
| 9.36806 | 0 |
| 9.36944 | 0 |
| 9.37083 | 0 |
| 9.37222 | 0 |
| 9.37361 | 0 |
| 9.375 | 0 |
| 9.37639 | 0 |
| 9.37778 | 0 |
| 9.37917 | 0 |
| 9.38056 | 0 |
| 9.38194 | 0 |
| 9.38333 | 0 |
| 9.38472 | 0 |
| 9.38611 | 0 |
| 9.3875 | 0 |
| 9.38889 | 0 |
| 9.39028 | 0 |
| 9.39167 | 0 |
| 9.39306 | 0 |
| 9.39444 | 0 |
| 9.39583 | 0 |
| 9.39722 | 0 |
| 9.39861 | 0 |
| 9.4 | 0 |
| 9.40139 | 0 |
| 9.40278 | 0 |
| 9.40417 | 0 |
| 9.40556 | 0 |
| 9.40694 | 0 |
| 9.40833 | 0 |
| 9.40972 | 0 |
| 9.41111 | 0 |
| 9.4125 | 0 |
| 9.41389 | 0 |
| 9.41528 | 0 |
| 9.41667 | 0 |
| 9.41806 | 0 |
| 9.41944 | 0 |
| 9.42083 | 0 |
| 9.42222 | 0 |
| 9.42361 | 0 |
| 9.425 | 0 |
| 9.42639 | 0 |
| 9.42778 | 0 |
| 9.42917 | 0 |
| 9.43056 | 0 |
| 9.43194 | 0 |
| 9.43333 | 0 |
| 9.43472 | 0 |
| 9.43611 | 0 |
| 9.4375 | 0 |
| 9.43889 | 0 |
| 9.44028 | 0 |
| 9.44167 | 0 |
| 9.44306 | 0 |
| 9.44444 | 0 |
| 9.44583 | 0 |
| 9.44722 | 0 |
| 9.44861 | 0 |
| 9.45 | 0 |
| 9.45139 | 0 |
| 9.45278 | 0 |
| 9.45417 | 0 |
| 9.45556 | 0 |
| 9.45694 | 0 |
| 9.45833 | 0 |
| 9.45972 | 0 |
| 9.46111 | 0 |
| 9.4625 | 0 |
| 9.46389 | 0 |
| 9.46528 | 0 |
| 9.46667 | 0 |
| 9.46806 | 0 |
| 9.46944 | 0 |
| 9.47083 | 0 |
| 9.47222 | 0 |
| 9.47361 | 0 |
| 9.475 | 0 |
| 9.47639 | 0 |
| 9.47778 | 0 |
| 9.47917 | 0 |
| 9.48056 | 0 |
| 9.48194 | 0 |
| 9.48333 | 0 |
| 9.48472 | 0 |
| 9.48611 | 0 |
| 9.4875 | 0 |
| 9.48889 | 0 |
| 9.49028 | 0 |
| 9.49167 | 0 |
| 9.49306 | 0 |
| 9.49444 | 0 |
| 9.49583 | 0 |
| 9.49722 | 0 |
| 9.49861 | 0 |
| 9.5 | 0 |
| 9.50139 | 0 |
| 9.50278 | 0 |
| 9.50417 | 0 |
| 9.50556 | 0 |
| 9.50694 | 0 |
| 9.50833 | 0 |
| 9.50972 | 0 |
| 9.51111 | 0 |
| 9.5125 | 0 |
| 9.51389 | 0 |
| 9.51528 | 0 |
| 9.51667 | 0 |
| 9.51806 | 0 |
| 9.51944 | 0 |
| 9.52083 | 0 |
| 9.52222 | 0 |
| 9.52361 | 0 |
| 9.525 | 0 |
| 9.52639 | 0 |
| 9.52778 | 0 |
| 9.52917 | 0 |
| 9.53056 | 0 |
| 9.53194 | 0 |
| 9.53333 | 0 |
| 9.53472 | 0 |
| 9.53611 | 0 |
| 9.5375 | 0 |
| 9.53889 | 0 |
| 9.54028 | 0 |
| 9.54167 | 0 |
| 9.54306 | 0 |
| 9.54444 | 0 |
| 9.54583 | 0 |
| 9.54722 | 0 |
| 9.54861 | 0 |
| 9.55 | 0 |
| 9.55139 | 0 |
| 9.55278 | 0 |
| 9.55417 | 0 |
| 9.55556 | 0 |
| 9.55694 | 0 |
| 9.55833 | 0 |
| 9.55972 | 0 |
| 9.56111 | 0 |
| 9.5625 | 0 |
| 9.56389 | 0 |
| 9.56528 | 0 |
| 9.56667 | 0 |
| 9.56806 | 0 |
| 9.56944 | 0 |
| 9.57083 | 0 |
| 9.57222 | 0 |
| 9.57361 | 0 |
| 9.575 | 0 |
| 9.57639 | 0 |
| 9.57778 | 0 |
| 9.57917 | 0 |
| 9.58056 | 0 |
| 9.58194 | 0 |
| 9.58333 | 0 |
| 9.58472 | 0 |
| 9.58611 | 0 |
| 9.5875 | 0 |
| 9.58889 | 0 |
| 9.59028 | 0 |
| 9.59167 | 0 |
| 9.59306 | 0 |
| 9.59444 | 0 |
| 9.59583 | 0 |
| 9.59722 | 0 |
| 9.59861 | 0 |
| 9.6 | 0 |
| 9.60139 | 0 |
| 9.60278 | 0 |
| 9.60417 | 0 |
| 9.60556 | 0 |
| 9.60694 | 0 |
| 9.60833 | 0 |
| 9.60972 | 0 |
| 9.61111 | 0 |
| 9.6125 | 0 |
| 9.61389 | 0 |
| 9.61528 | 0 |
| 9.61667 | 0 |
| 9.61806 | 0 |
| 9.61944 | 0 |
| 9.62083 | 0 |
| 9.62222 | 0 |
| 9.62361 | 0 |
| 9.625 | 0 |
| 9.62639 | 0 |
| 9.62778 | 0 |
| 9.62917 | 0 |
| 9.63056 | 0 |
| 9.63194 | 0 |
| 9.63333 | 0 |
| 9.63472 | 0 |
| 9.63611 | 0 |
| 9.6375 | 0 |
| 9.63889 | 0 |
| 9.64028 | 0 |
| 9.64167 | 0 |
| 9.64306 | 0 |
| 9.64444 | 0 |
| 9.64583 | 0 |
| 9.64722 | 0 |
| 9.64861 | 0 |
| 9.65 | 0 |
| 9.65139 | 0 |
| 9.65278 | 0 |
| 9.65417 | 0 |
| 9.65556 | 0 |
| 9.65694 | 0 |
| 9.65833 | 0 |
| 9.65972 | 0 |
| 9.66111 | 0 |
| 9.6625 | 0 |
| 9.66389 | 0 |
| 9.66528 | 0 |
| 9.66667 | 0 |
| 9.66806 | 0 |
| 9.66944 | 0 |
| 9.67083 | 0 |
| 9.67222 | 0 |
| 9.67361 | 0 |
| 9.675 | 0 |
| 9.67639 | 0 |
| 9.67778 | 0 |
| 9.67917 | 0 |
| 9.68056 | 0 |
| 9.68194 | 0 |
| 9.68333 | 0 |
| 9.68472 | 0 |
| 9.68611 | 0 |
| 9.6875 | 0 |
| 9.68889 | 0 |
| 9.69028 | 0 |
| 9.69167 | 0 |
| 9.69306 | 0 |
| 9.69444 | 0 |
| 9.69583 | 0 |
| 9.69722 | 0 |
| 9.69861 | 0 |
| 9.7 | 0 |
| 9.70139 | 0 |
| 9.70278 | 0 |
| 9.70417 | 0 |
| 9.70556 | 0 |
| 9.70694 | 0 |
| 9.70833 | 0 |
| 9.70972 | 0 |
| 9.71111 | 0 |
| 9.7125 | 0 |
| 9.71389 | 0 |
| 9.71528 | 0 |
| 9.71667 | 0 |
| 9.71806 | 0 |
| 9.71944 | 0 |
| 9.72083 | 0 |
| 9.72222 | 0 |
| 9.72361 | 0 |
| 9.725 | 0 |
| 9.72639 | 0 |
| 9.72778 | 0 |
| 9.72917 | 0 |
| 9.73056 | 0 |
| 9.73194 | 0 |
| 9.73333 | 0 |
| 9.73472 | 0 |
| 9.73611 | 0 |
| 9.7375 | 0 |
| 9.73889 | 0 |
| 9.74028 | 0 |
| 9.74167 | 0 |
| 9.74306 | 0 |
| 9.74444 | 0 |
| 9.74583 | 0 |
| 9.74722 | 0 |
| 9.74861 | 0 |
| 9.75 | 0 |
| 9.75139 | 0 |
| 9.75278 | 0 |
| 9.75417 | 0 |
| 9.75556 | 0 |
| 9.75694 | 0 |
| 9.75833 | 0 |
| 9.75972 | 0 |
| 9.76111 | 0 |
| 9.7625 | 0 |
| 9.76389 | 0 |
| 9.76528 | 0 |
| 9.76667 | 0 |
| 9.76806 | 0 |
| 9.76944 | 0 |
| 9.77083 | 0 |
| 9.77222 | 0 |
| 9.77361 | 0 |
| 9.775 | 0 |
| 9.77639 | 0 |
| 9.77778 | 0 |
| 9.77917 | 0 |
| 9.78056 | 0 |
| 9.78194 | 0 |
| 9.78333 | 0 |
| 9.78472 | 0 |
| 9.78611 | 0 |
| 9.7875 | 0 |
| 9.78889 | 0 |
| 9.79028 | 0 |
| 9.79167 | 0 |
| 9.79306 | 0 |
| 9.79444 | 0 |
| 9.79583 | 0 |
| 9.79722 | 0 |
| 9.79861 | 0 |
| 9.8 | 0 |
| 9.80139 | 0 |
| 9.80278 | 0 |
| 9.80417 | 0 |
| 9.80556 | 0 |
| 9.80694 | 0 |
| 9.80833 | 0 |
| 9.80972 | 0 |
| 9.81111 | 0 |
| 9.8125 | 0 |
| 9.81389 | 0 |
| 9.81528 | 0 |
| 9.81667 | 0 |
| 9.81806 | 0 |
| 9.81944 | 0 |
| 9.82083 | 0 |
| 9.82222 | 0 |
| 9.82361 | 0 |
| 9.825 | 0 |
| 9.82639 | 0 |
| 9.82778 | 0 |
| 9.82917 | 0 |
| 9.83056 | 0 |
| 9.83194 | 0 |
| 9.83333 | 0 |
| 9.83472 | 0 |
| 9.83611 | 0 |
| 9.8375 | 0 |
| 9.83889 | 0 |
| 9.84028 | 0 |
| 9.84167 | 0 |
| 9.84306 | 0 |
| 9.84444 | 0 |
| 9.84583 | 0 |
| 9.84722 | 0 |
| 9.84861 | 0 |
| 9.85 | 0 |
| 9.85139 | 0 |
| 9.85278 | 0 |
| 9.85417 | 0 |
| 9.85556 | 0 |
| 9.85694 | 0 |
| 9.85833 | 0 |
| 9.85972 | 0 |
| 9.86111 | 0 |
| 9.8625 | 0 |
| 9.86389 | 0 |
| 9.86528 | 0 |
| 9.86667 | 0 |
| 9.86806 | 0 |
| 9.86944 | 0 |
| 9.87083 | 0 |
| 9.87222 | 0 |
| 9.87361 | 0 |
| 9.875 | 0 |
| 9.87639 | 0 |
| 9.87778 | 0 |
| 9.87917 | 0 |
| 9.88056 | 0 |
| 9.88194 | 0 |
| 9.88333 | 0 |
| 9.88472 | 0 |
| 9.88611 | 0 |
| 9.8875 | 0 |
| 9.88889 | 0 |
| 9.89028 | 0 |
| 9.89167 | 0 |
| 9.89306 | 0 |
| 9.89444 | 0 |
| 9.89583 | 0 |
| 9.89722 | 0 |
| 9.89861 | 0 |
| 9.9 | 0 |
| 9.90139 | 0 |
| 9.90278 | 0 |
| 9.90417 | 0 |
| 9.90556 | 0 |
| 9.90694 | 0 |
| 9.90833 | 0 |
| 9.90972 | 0 |
| 9.91111 | 0 |
| 9.9125 | 0 |
| 9.91389 | 0 |
| 9.91528 | 0 |
| 9.91667 | 0 |
| 9.91806 | 0 |
| 9.91944 | 0 |
| 9.92083 | 0 |
| 9.92222 | 0 |
| 9.92361 | 0 |
| 9.925 | 0 |
| 9.92639 | 0 |
| 9.92778 | 0 |
| 9.92917 | 0 |
| 9.93056 | 0 |
| 9.93194 | 0 |
| 9.93333 | 0 |
| 9.93472 | 0 |
| 9.93611 | 0 |
| 9.9375 | 0 |
| 9.93889 | 0 |
| 9.94028 | 0 |
| 9.94167 | 0 |
| 9.94306 | 0 |
| 9.94444 | 0 |
| 9.94583 | 0 |
| 9.94722 | 0 |
| 9.94861 | 0 |
| 9.95 | 0 |
| 9.95139 | 0 |
| 9.95278 | 0 |
| 9.95417 | 0 |
| 9.95556 | 0 |
| 9.95694 | 0 |
| 9.95833 | 0 |
| 9.95972 | 0 |
| 9.96111 | 0 |
| 9.9625 | 0 |
| 9.96389 | 0 |
| 9.96528 | 0 |
| 9.96667 | 0 |
| 9.96806 | 0 |
| 9.96944 | 0 |
| 9.97083 | 0 |
| 9.97222 | 0 |
| 9.97361 | 0 |
| 9.975 | 0 |
| 9.97639 | 0 |
| 9.97778 | 0 |
| 9.97917 | 0 |
| 9.98056 | 0 |
| 9.98194 | 0 |
| 9.98333 | 0 |
| 9.98472 | 0 |
| 9.98611 | 0 |
| 9.9875 | 0 |
| 9.98889 | 0 |
| 9.99028 | 0 |
| 9.99167 | 0 |
| 9.99306 | 0 |
| 9.99444 | 0 |
| 9.99583 | 0 |
| 9.99722 | 0 |
| 9.99861 | 0 |
| 10.0 | 0 |
| 10.00139 | 0 |
| 10.00278 | 0 |
| 10.00417 | 0 |
| 10.00556 | 0 |
| 10.00694 | 0 |
| 10.00833 | 0 |
| 10.00972 | 0 |
| 10.01111 | 0 |
| 10.0125 | 0 |
| 10.01389 | 0 |
| 10.01528 | 0 |
| 10.01667 | 0 |
| 10.01806 | 0 |
| 10.01944 | 0 |
| 10.02083 | 0 |
| 10.02222 | 0 |
| 10.02361 | 0 |
| 10.025 | 0 |
| 10.02639 | 0 |
| 10.02778 | 0 |
| 10.02917 | 0 |
| 10.03056 | 0 |
| 10.03194 | 0 |
| 10.03333 | 0 |
| 10.03472 | 0 |
| 10.03611 | 0 |
| 10.0375 | 0 |
| 10.03889 | 0 |
| 10.04028 | 0 |
| 10.04167 | 0 |
| 10.04306 | 0 |
| 10.04444 | 0 |
| 10.04583 | 0 |
| 10.04722 | 0 |
| 10.04861 | 0 |
| 10.05 | 0 |
| 10.05139 | 0 |
| 10.05278 | 0 |
| 10.05417 | 0 |
| 10.05556 | 0 |
| 10.05694 | 0 |
| 10.05833 | 0 |
| 10.05972 | 0 |
| 10.06111 | 0 |
| 10.0625 | 0 |
| 10.06389 | 0 |
| 10.06528 | 0 |
| 10.06667 | 0 |
| 10.06806 | 0 |
| 10.06944 | 0 |
| 10.07083 | 0 |
| 10.07222 | 0 |
| 10.07361 | 0 |
| 10.075 | 0 |
| 10.07639 | 0 |
| 10.07778 | 0 |
| 10.07917 | 0 |
| 10.08056 | 0 |
| 10.08194 | 0 |
| 10.08333 | 0 |
| 10.08472 | 0 |
| 10.08611 | 0 |
| 10.0875 | 0 |
| 10.08889 | 0 |
| 10.09028 | 0 |
| 10.09167 | 0 |
| 10.09306 | 0 |
| 10.09444 | 0 |
| 10.09583 | 0 |
| 10.09722 | 0 |
| 10.09861 | 0 |
| 10.1 | 0 |
| 10.10139 | 0 |
| 10.10278 | 0 |
| 10.10417 | 0 |
| 10.10556 | 0 |
| 10.10694 | 0 |
| 10.10833 | 0 |
| 10.10972 | 0 |
| 10.11111 | 0 |
| 10.1125 | 0 |
| 10.11389 | 0 |
| 10.11528 | 0 |
| 10.11667 | 0 |
| 10.11806 | 0 |
| 10.11944 | 0 |
| 10.12083 | 0 |
| 10.12222 | 0 |
| 10.12361 | 0 |
| 10.125 | 0 |
| 10.12639 | 0 |
| 10.12778 | 0 |
| 10.12917 | 0 |
| 10.13056 | 0 |
| 10.13194 | 0 |
| 10.13333 | 0 |
| 10.13472 | 0 |
| 10.13611 | 0 |
| 10.1375 | 0 |
| 10.13889 | 0 |
| 10.14028 | 0 |
| 10.14167 | 0 |
| 10.14306 | 0 |
| 10.14444 | 0 |
| 10.14583 | 0 |
| 10.14722 | 0 |
| 10.14861 | 0 |
| 10.15 | 0 |
| 10.15139 | 0 |
| 10.15278 | 0 |
| 10.15417 | 0 |
| 10.15556 | 0 |
| 10.15694 | 0 |
| 10.15833 | 0 |
| 10.15972 | 0 |
| 10.16111 | 0 |
| 10.1625 | 0 |
| 10.16389 | 0 |
| 10.16528 | 0 |
| 10.16667 | 0 |
| 10.16806 | 0 |
| 10.16944 | 0 |
| 10.17083 | 0 |
| 10.17222 | 0 |
| 10.17361 | 0 |
| 10.175 | 0 |
| 10.17639 | 0 |
| 10.17778 | 0 |
| 10.17917 | 0 |
| 10.18056 | 0 |
| 10.18194 | 0 |
| 10.18333 | 0 |
| 10.18472 | 0 |
| 10.18611 | 0 |
| 10.1875 | 0 |
| 10.18889 | 0 |
| 10.19028 | 0 |
| 10.19167 | 0 |
| 10.19306 | 0 |
| 10.19444 | 0 |
| 10.19583 | 0 |
| 10.19722 | 0 |
| 10.19861 | 0 |
| 10.2 | 0 |
| 10.20139 | 0 |
| 10.20278 | 0 |
| 10.20417 | 0 |
| 10.20556 | 0 |
| 10.20694 | 0 |
| 10.20833 | 0 |
| 10.20972 | 0 |
| 10.21111 | 0 |
| 10.2125 | 0 |
| 10.21389 | 0 |
| 10.21528 | 0 |
| 10.21667 | 0 |
| 10.21806 | 0 |
| 10.21944 | 0 |
| 10.22083 | 0 |
| 10.22222 | 0 |
| 10.22361 | 0 |
| 10.225 | 0 |
| 10.22639 | 0 |
| 10.22778 | 0 |
| 10.22917 | 0 |
| 10.23056 | 0 |
| 10.23194 | 0 |
| 10.23333 | 0 |
| 10.23472 | 0 |
| 10.23611 | 0 |
| 10.2375 | 0 |
| 10.23889 | 0 |
| 10.24028 | 0 |
| 10.24167 | 0 |
| 10.24306 | 0 |
| 10.24444 | 0 |
| 10.24583 | 0 |
| 10.24722 | 0 |
| 10.24861 | 0 |
| 10.25 | 0 |
| 10.25139 | 0 |
| 10.25278 | 0 |
| 10.25417 | 0 |
| 10.25556 | 0 |
| 10.25694 | 0 |
| 10.25833 | 0 |
| 10.25972 | 0 |
| 10.26111 | 0 |
| 10.2625 | 0 |
| 10.26389 | 0 |
| 10.26528 | 0 |
| 10.26667 | 0 |
| 10.26806 | 0 |
| 10.26944 | 0 |
| 10.27083 | 0 |
| 10.27222 | 0 |
| 10.27361 | 0 |
| 10.275 | 0 |
| 10.27639 | 0 |
| 10.27778 | 0 |
| 10.27917 | 0 |
| 10.28056 | 0 |
| 10.28194 | 0 |
| 10.28333 | 0 |
| 10.28472 | 0 |
| 10.28611 | 0 |
| 10.2875 | 0 |
| 10.28889 | 0 |
| 10.29028 | 0 |
| 10.29167 | 0 |
| 10.29306 | 0 |
| 10.29444 | 0 |
| 10.29583 | 0 |
| 10.29722 | 0 |
| 10.29861 | 0 |
| 10.3 | 0 |
| 10.30139 | 0 |
| 10.30278 | 0 |
| 10.30417 | 0 |
| 10.30556 | 0 |
| 10.30694 | 0 |
| 10.30833 | 0 |
| 10.30972 | 0 |
| 10.31111 | 0 |
| 10.3125 | 0 |
| 10.31389 | 0 |
| 10.31528 | 0 |
| 10.31667 | 0 |
| 10.31806 | 0 |
| 10.31944 | 0 |
| 10.32083 | 0 |
| 10.32222 | 0 |
| 10.32361 | 0 |
| 10.325 | 0 |
| 10.32639 | 0 |
| 10.32778 | 0 |
| 10.32917 | 0 |
| 10.33056 | 0 |
| 10.33194 | 0 |
| 10.33333 | 0 |
| 10.33472 | 0 |
| 10.33611 | 0 |
| 10.3375 | 0 |
| 10.33889 | 0 |
| 10.34028 | 0 |
| 10.34167 | 0 |
| 10.34306 | 0 |
| 10.34444 | 0 |
| 10.34583 | 0 |
| 10.34722 | 0 |
| 10.34861 | 0 |
| 10.35 | 0 |
| 10.35139 | 0 |
| 10.35278 | 0 |
| 10.35417 | 0 |
| 10.35556 | 0 |
| 10.35694 | 0 |
| 10.35833 | 0 |
| 10.35972 | 0 |
| 10.36111 | 0 |
| 10.3625 | 0 |
| 10.36389 | 0 |
| 10.36528 | 0 |
| 10.36667 | 0 |
| 10.36806 | 0 |
| 10.36944 | 0 |
| 10.37083 | 0 |
| 10.37222 | 0 |
| 10.37361 | 0 |
| 10.375 | 0 |
| 10.37639 | 0 |
| 10.37778 | 0 |
| 10.37917 | 0 |
| 10.38056 | 0 |
| 10.38194 | 0 |
| 10.38333 | 0 |
| 10.38472 | 0 |
| 10.38611 | 0 |
| 10.3875 | 0 |
| 10.38889 | 0 |
| 10.39028 | 0 |
| 10.39167 | 0 |
| 10.39306 | 0 |
| 10.39444 | 0 |
| 10.39583 | 0 |
| 10.39722 | 0 |
| 10.39861 | 0 |
| 10.4 | 0 |
| 10.40139 | 0 |
| 10.40278 | 0 |
| 10.40417 | 0 |
| 10.40556 | 0 |
| 10.40694 | 0 |
| 10.40833 | 0 |
| 10.40972 | 0 |
| 10.41111 | 0 |
| 10.4125 | 0 |
| 10.41389 | 0 |
| 10.41528 | 0 |
| 10.41667 | 0 |
| 10.41806 | 0 |
| 10.41944 | 0 |
| 10.42083 | 0 |
| 10.42222 | 0 |
| 10.42361 | 0 |
| 10.425 | 0 |
| 10.42639 | 0 |
| 10.42778 | 0 |
| 10.42917 | 0 |
| 10.43056 | 0 |
| 10.43194 | 0 |
| 10.43333 | 0 |
| 10.43472 | 0 |
| 10.43611 | 0 |
| 10.4375 | 0 |
| 10.43889 | 0 |
| 10.44028 | 0 |
| 10.44167 | 0 |
| 10.44306 | 0 |
| 10.44444 | 0 |
| 10.44583 | 0 |
| 10.44722 | 0 |
| 10.44861 | 0 |
| 10.45 | 0 |
| 10.45139 | 0 |
| 10.45278 | 0 |
| 10.45417 | 0 |
| 10.45556 | 0 |
| 10.45694 | 0 |
| 10.45833 | 0 |
| 10.45972 | 0 |
| 10.46111 | 0 |
| 10.4625 | 0 |
| 10.46389 | 0 |
| 10.46528 | 0 |
| 10.46667 | 0 |
| 10.46806 | 0 |
| 10.46944 | 0 |
| 10.47083 | 0 |
| 10.47222 | 0 |
| 10.47361 | 0 |
| 10.475 | 0 |
| 10.47639 | 0 |
| 10.47778 | 0 |
| 10.47917 | 0 |
| 10.48056 | 0 |
| 10.48194 | 0 |
| 10.48333 | 0 |
| 10.48472 | 0 |
| 10.48611 | 0 |
| 10.4875 | 0 |
| 10.48889 | 0 |
| 10.49028 | 0 |
| 10.49167 | 0 |
| 10.49306 | 0 |
| 10.49444 | 0 |
| 10.49583 | 0 |
| 10.49722 | 0 |
| 10.49861 | 0 |
| 10.5 | 0 |
| 10.50139 | 0 |
| 10.50278 | 0 |
| 10.50417 | 0 |
| 10.50556 | 0 |
| 10.50694 | 0 |
| 10.50833 | 0 |
| 10.50972 | 0 |
| 10.51111 | 0 |
| 10.5125 | 0 |
| 10.51389 | 0 |
| 10.51528 | 0 |
| 10.51667 | 0 |
| 10.51806 | 0 |
| 10.51944 | 0 |
| 10.52083 | 0 |
| 10.52222 | 0 |
| 10.52361 | 0 |
| 10.525 | 0 |
| 10.52639 | 0 |
| 10.52778 | 0 |
| 10.52917 | 0 |
| 10.53056 | 0 |
| 10.53194 | 0 |
| 10.53333 | 0 |
| 10.53472 | 0 |
| 10.53611 | 0 |
| 10.5375 | 0 |
| 10.53889 | 0 |
| 10.54028 | 0 |
| 10.54167 | 0 |
| 10.54306 | 0 |
| 10.54444 | 0 |
| 10.54583 | 0 |
| 10.54722 | 0 |
| 10.54861 | 0 |
| 10.55 | 0 |
| 10.55139 | 0 |
| 10.55278 | 0 |
| 10.55417 | 0 |
| 10.55556 | 0 |
| 10.55694 | 0 |
| 10.55833 | 0 |
| 10.55972 | 0 |
| 10.56111 | 0 |
| 10.5625 | 0 |
| 10.56389 | 0 |
| 10.56528 | 0 |
| 10.56667 | 0 |
| 10.56806 | 0 |
| 10.56944 | 0 |
| 10.57083 | 0 |
| 10.57222 | 0 |
| 10.57361 | 0 |
| 10.575 | 0 |
| 10.57639 | 0 |
| 10.57778 | 0 |
| 10.57917 | 0 |
| 10.58056 | 0 |
| 10.58194 | 0 |
| 10.58333 | 0 |
| 10.58472 | 0 |
| 10.58611 | 0 |
| 10.5875 | 0 |
| 10.58889 | 0 |
| 10.59028 | 0 |
| 10.59167 | 0 |
| 10.59306 | 0 |
| 10.59444 | 0 |
| 10.59583 | 0 |
| 10.59722 | 0 |
| 10.59861 | 0 |
| 10.6 | 0 |
| 10.60139 | 0 |
| 10.60278 | 0 |
| 10.60417 | 0 |
| 10.60556 | 0 |
| 10.60694 | 0 |
| 10.60833 | 0 |
| 10.60972 | 0 |
| 10.61111 | 0 |
| 10.6125 | 0 |
| 10.61389 | 0 |
| 10.61528 | 0 |
| 10.61667 | 0 |
| 10.61806 | 0 |
| 10.61944 | 0 |
| 10.62083 | 0 |
| 10.62222 | 0 |
| 10.62361 | 0 |
| 10.625 | 0 |
| 10.62639 | 0 |
| 10.62778 | 0 |
| 10.62917 | 0 |
| 10.63056 | 0 |
| 10.63194 | 0 |
| 10.63333 | 0 |
| 10.63472 | 0 |
| 10.63611 | 0 |
| 10.6375 | 0 |
| 10.63889 | 0 |
| 10.64028 | 0 |
| 10.64167 | 0 |
| 10.64306 | 0 |
| 10.64444 | 0 |
| 10.64583 | 0 |
| 10.64722 | 0 |
| 10.64861 | 0 |
| 10.65 | 0 |
| 10.65139 | 0 |
| 10.65278 | 0 |
| 10.65417 | 0 |
| 10.65556 | 0 |
| 10.65694 | 0 |
| 10.65833 | 0 |
| 10.65972 | 0 |
| 10.66111 | 0 |
| 10.6625 | 0 |
| 10.66389 | 0 |
| 10.66528 | 0 |
| 10.66667 | 0 |
| 10.66806 | 0 |
| 10.66944 | 0 |
| 10.67083 | 0 |
| 10.67222 | 0 |
| 10.67361 | 0 |
| 10.675 | 0 |
| 10.67639 | 0 |
| 10.67778 | 0 |
| 10.67917 | 0 |
| 10.68056 | 0 |
| 10.68194 | 0 |
| 10.68333 | 0 |
| 10.68472 | 0 |
| 10.68611 | 0 |
| 10.6875 | 0 |
| 10.68889 | 0 |
| 10.69028 | 0 |
| 10.69167 | 0 |
| 10.69306 | 0 |
| 10.69444 | 0 |
| 10.69583 | 0 |
| 10.69722 | 0 |
| 10.69861 | 0 |
| 10.7 | 0 |
| 10.70139 | 0 |
| 10.70278 | 0 |